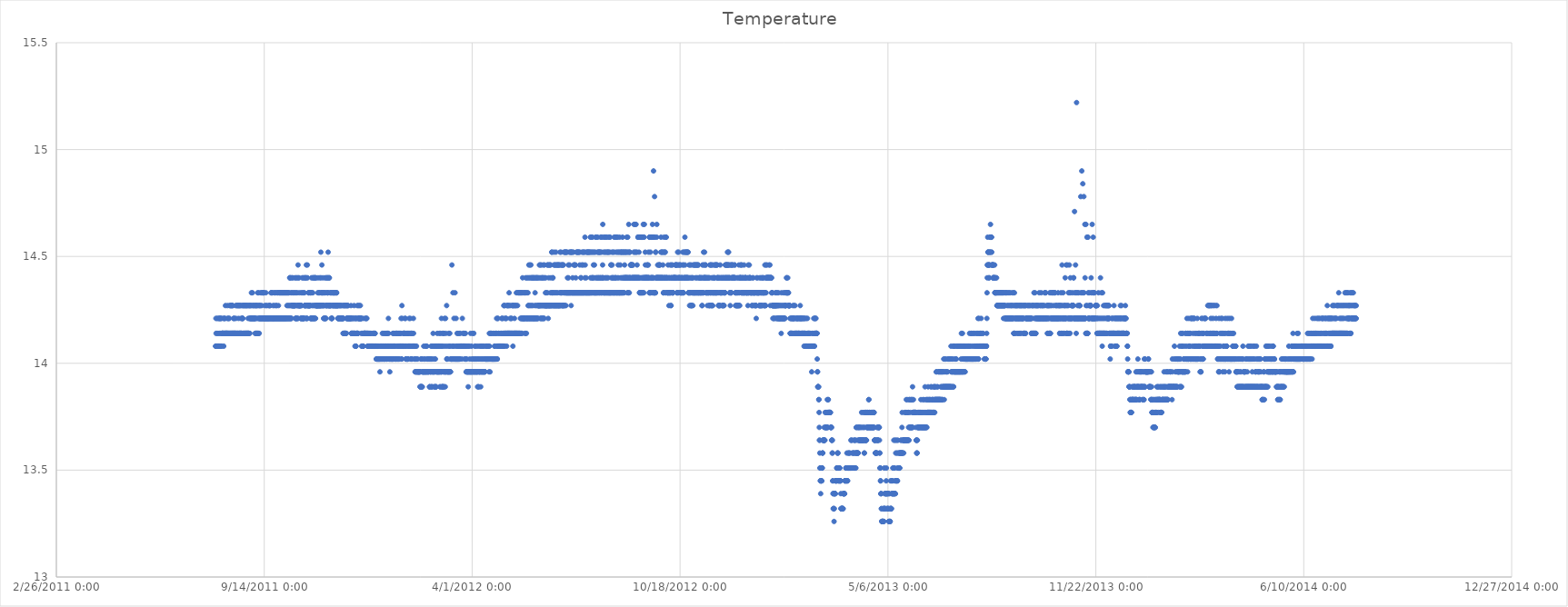
| Category | Temperature  |
|---|---|
| 40753.165972222225 | 14.08 |
| 40753.33263888889 | 14.08 |
| 40753.49930555555 | 14.21 |
| 40753.665972222225 | 14.14 |
| 40753.83263888889 | 14.08 |
| 40753.99930555555 | 14.08 |
| 40754.165972222225 | 14.08 |
| 40754.33263888889 | 14.08 |
| 40754.49930555555 | 14.21 |
| 40754.665972222225 | 14.14 |
| 40754.83263888889 | 14.08 |
| 40754.99930555555 | 14.08 |
| 40755.165972222225 | 14.08 |
| 40755.33263888889 | 14.08 |
| 40755.49930555555 | 14.21 |
| 40755.665972222225 | 14.14 |
| 40755.83263888889 | 14.08 |
| 40755.99930555555 | 14.08 |
| 40756.165972222225 | 14.08 |
| 40756.33263888889 | 14.08 |
| 40756.49930555555 | 14.21 |
| 40756.665972222225 | 14.21 |
| 40756.83263888889 | 14.14 |
| 40756.99930555555 | 14.08 |
| 40757.165972222225 | 14.08 |
| 40757.33263888889 | 14.08 |
| 40757.49930555555 | 14.21 |
| 40757.665972222225 | 14.21 |
| 40757.83263888889 | 14.14 |
| 40757.99930555555 | 14.08 |
| 40758.165972222225 | 14.08 |
| 40758.33263888889 | 14.08 |
| 40758.49930555555 | 14.21 |
| 40758.665972222225 | 14.21 |
| 40758.83263888889 | 14.08 |
| 40758.99930555555 | 14.14 |
| 40759.165972222225 | 14.14 |
| 40759.33263888889 | 14.14 |
| 40759.49930555555 | 14.14 |
| 40759.665972222225 | 14.14 |
| 40759.83263888889 | 14.14 |
| 40759.99930555555 | 14.14 |
| 40760.165972222225 | 14.14 |
| 40760.33263888889 | 14.14 |
| 40760.49930555555 | 14.14 |
| 40760.665972222225 | 14.21 |
| 40760.83263888889 | 14.14 |
| 40760.99930555555 | 14.08 |
| 40761.165972222225 | 14.14 |
| 40761.33263888889 | 14.14 |
| 40761.49930555555 | 14.21 |
| 40761.665972222225 | 14.21 |
| 40761.83263888889 | 14.14 |
| 40761.99930555555 | 14.14 |
| 40762.165972222225 | 14.14 |
| 40762.33263888889 | 14.14 |
| 40762.49930555555 | 14.21 |
| 40762.665972222225 | 14.27 |
| 40762.83263888889 | 14.14 |
| 40762.99930555555 | 14.14 |
| 40763.165972222225 | 14.14 |
| 40763.33263888889 | 14.14 |
| 40763.49930555555 | 14.14 |
| 40763.665972222225 | 14.14 |
| 40763.83263888889 | 14.14 |
| 40763.99930555555 | 14.14 |
| 40764.165972222225 | 14.14 |
| 40764.33263888889 | 14.14 |
| 40764.49930555555 | 14.21 |
| 40764.665972222225 | 14.27 |
| 40764.83263888889 | 14.14 |
| 40764.99930555555 | 14.14 |
| 40765.165972222225 | 14.14 |
| 40765.33263888889 | 14.14 |
| 40765.49930555555 | 14.21 |
| 40765.665972222225 | 14.21 |
| 40765.83263888889 | 14.14 |
| 40765.99930555555 | 14.14 |
| 40766.165972222225 | 14.14 |
| 40766.33263888889 | 14.14 |
| 40766.49930555555 | 14.21 |
| 40766.665972222225 | 14.27 |
| 40766.83263888889 | 14.14 |
| 40766.99930555555 | 14.14 |
| 40767.165972222225 | 14.14 |
| 40767.33263888889 | 14.14 |
| 40767.49930555555 | 14.27 |
| 40767.665972222225 | 14.27 |
| 40767.83263888889 | 14.14 |
| 40767.99930555555 | 14.14 |
| 40768.165972222225 | 14.14 |
| 40768.33263888889 | 14.14 |
| 40768.49930555555 | 14.27 |
| 40768.665972222225 | 14.27 |
| 40768.83263888889 | 14.14 |
| 40768.99930555555 | 14.14 |
| 40769.165972222225 | 14.14 |
| 40769.33263888889 | 14.14 |
| 40769.49930555555 | 14.27 |
| 40769.665972222225 | 14.27 |
| 40769.83263888889 | 14.14 |
| 40769.99930555555 | 14.14 |
| 40770.165972222225 | 14.14 |
| 40770.33263888889 | 14.14 |
| 40770.49930555555 | 14.21 |
| 40770.665972222225 | 14.21 |
| 40770.83263888889 | 14.14 |
| 40770.99930555555 | 14.14 |
| 40771.165972222225 | 14.14 |
| 40771.33263888889 | 14.14 |
| 40771.49930555555 | 14.21 |
| 40771.665972222225 | 14.14 |
| 40771.83263888889 | 14.14 |
| 40771.99930555555 | 14.14 |
| 40772.165972222225 | 14.14 |
| 40772.33263888889 | 14.14 |
| 40772.49930555555 | 14.27 |
| 40772.665972222225 | 14.21 |
| 40772.83263888889 | 14.14 |
| 40772.99930555555 | 14.14 |
| 40773.165972222225 | 14.14 |
| 40773.33263888889 | 14.14 |
| 40773.49930555555 | 14.27 |
| 40773.665972222225 | 14.27 |
| 40773.83263888889 | 14.14 |
| 40773.99930555555 | 14.14 |
| 40774.165972222225 | 14.14 |
| 40774.33263888889 | 14.14 |
| 40774.49930555555 | 14.27 |
| 40774.665972222225 | 14.27 |
| 40774.83263888889 | 14.14 |
| 40774.99930555555 | 14.14 |
| 40775.165972222225 | 14.14 |
| 40775.33263888889 | 14.21 |
| 40775.49930555555 | 14.27 |
| 40775.665972222225 | 14.27 |
| 40775.83263888889 | 14.14 |
| 40775.99930555555 | 14.14 |
| 40776.165972222225 | 14.14 |
| 40776.33263888889 | 14.14 |
| 40776.49930555555 | 14.27 |
| 40776.665972222225 | 14.27 |
| 40776.83263888889 | 14.14 |
| 40776.99930555555 | 14.14 |
| 40777.165972222225 | 14.14 |
| 40777.33263888889 | 14.14 |
| 40777.49930555555 | 14.27 |
| 40777.665972222225 | 14.21 |
| 40777.83263888889 | 14.14 |
| 40777.99930555555 | 14.14 |
| 40778.165972222225 | 14.14 |
| 40778.33263888889 | 14.14 |
| 40778.49930555555 | 14.27 |
| 40778.665972222225 | 14.21 |
| 40778.83263888889 | 14.21 |
| 40778.99930555555 | 14.14 |
| 40779.165972222225 | 14.21 |
| 40779.33263888889 | 14.21 |
| 40779.49930555555 | 14.27 |
| 40779.665972222225 | 14.27 |
| 40779.83263888889 | 14.14 |
| 40779.99930555555 | 14.14 |
| 40780.165972222225 | 14.14 |
| 40780.33263888889 | 14.14 |
| 40780.49930555555 | 14.27 |
| 40780.665972222225 | 14.27 |
| 40780.83263888889 | 14.14 |
| 40780.99930555555 | 14.14 |
| 40781.165972222225 | 14.14 |
| 40781.33263888889 | 14.14 |
| 40781.49930555555 | 14.27 |
| 40781.665972222225 | 14.27 |
| 40781.83263888889 | 14.14 |
| 40781.99930555555 | 14.14 |
| 40782.165972222225 | 14.14 |
| 40782.33263888889 | 14.14 |
| 40782.49930555555 | 14.27 |
| 40782.665972222225 | 14.27 |
| 40782.83263888889 | 14.14 |
| 40782.99930555555 | 14.14 |
| 40783.165972222225 | 14.14 |
| 40783.33263888889 | 14.14 |
| 40783.49930555555 | 14.27 |
| 40783.665972222225 | 14.27 |
| 40783.83263888889 | 14.14 |
| 40783.99930555555 | 14.14 |
| 40784.165972222225 | 14.14 |
| 40784.33263888889 | 14.14 |
| 40784.49930555555 | 14.21 |
| 40784.665972222225 | 14.27 |
| 40784.83263888889 | 14.14 |
| 40784.99930555555 | 14.14 |
| 40785.165972222225 | 14.14 |
| 40785.33263888889 | 14.14 |
| 40785.49930555555 | 14.27 |
| 40785.665972222225 | 14.27 |
| 40785.83263888889 | 14.21 |
| 40785.99930555555 | 14.21 |
| 40786.165972222225 | 14.14 |
| 40786.33263888889 | 14.21 |
| 40786.49930555555 | 14.27 |
| 40786.665972222225 | 14.27 |
| 40786.83263888889 | 14.21 |
| 40786.99930555555 | 14.21 |
| 40787.165972222225 | 14.21 |
| 40787.33263888889 | 14.21 |
| 40787.49930555555 | 14.27 |
| 40787.665972222225 | 14.33 |
| 40787.83263888889 | 14.21 |
| 40787.99930555555 | 14.21 |
| 40788.165972222225 | 14.21 |
| 40788.33263888889 | 14.21 |
| 40788.49930555555 | 14.27 |
| 40788.665972222225 | 14.33 |
| 40788.83263888889 | 14.21 |
| 40788.99930555555 | 14.21 |
| 40789.165972222225 | 14.21 |
| 40789.33263888889 | 14.21 |
| 40789.49930555555 | 14.27 |
| 40789.665972222225 | 14.27 |
| 40789.83263888889 | 14.21 |
| 40789.99930555555 | 14.21 |
| 40790.165972222225 | 14.21 |
| 40790.33263888889 | 14.21 |
| 40790.49930555555 | 14.27 |
| 40790.665972222225 | 14.21 |
| 40790.83263888889 | 14.21 |
| 40790.99930555555 | 14.21 |
| 40791.165972222225 | 14.14 |
| 40791.33263888889 | 14.21 |
| 40791.49930555555 | 14.27 |
| 40791.665972222225 | 14.27 |
| 40791.83263888889 | 14.21 |
| 40791.99930555555 | 14.14 |
| 40792.165972222225 | 14.14 |
| 40792.33263888889 | 14.14 |
| 40792.49930555555 | 14.27 |
| 40792.665972222225 | 14.27 |
| 40792.83263888889 | 14.21 |
| 40792.99930555555 | 14.14 |
| 40793.165972222225 | 14.14 |
| 40793.33263888889 | 14.14 |
| 40793.49930555555 | 14.27 |
| 40793.665972222225 | 14.33 |
| 40793.83263888889 | 14.21 |
| 40793.99930555555 | 14.14 |
| 40794.165972222225 | 14.14 |
| 40794.33263888889 | 14.14 |
| 40794.49930555555 | 14.27 |
| 40794.665972222225 | 14.33 |
| 40794.83263888889 | 14.21 |
| 40794.99930555555 | 14.21 |
| 40795.165972222225 | 14.14 |
| 40795.33263888889 | 14.21 |
| 40795.49930555555 | 14.27 |
| 40795.665972222225 | 14.27 |
| 40795.83263888889 | 14.21 |
| 40795.99930555555 | 14.21 |
| 40796.165972222225 | 14.21 |
| 40796.33263888889 | 14.21 |
| 40796.49930555555 | 14.27 |
| 40796.665972222225 | 14.33 |
| 40796.83263888889 | 14.21 |
| 40796.99930555555 | 14.21 |
| 40797.165972222225 | 14.21 |
| 40797.33263888889 | 14.21 |
| 40797.49930555555 | 14.33 |
| 40797.665972222225 | 14.27 |
| 40797.83263888889 | 14.21 |
| 40797.99930555555 | 14.21 |
| 40798.165972222225 | 14.21 |
| 40798.33263888889 | 14.21 |
| 40798.49930555555 | 14.33 |
| 40798.665972222225 | 14.33 |
| 40798.83263888889 | 14.21 |
| 40798.99930555555 | 14.21 |
| 40799.165972222225 | 14.21 |
| 40799.33263888889 | 14.21 |
| 40799.49930555555 | 14.33 |
| 40799.665972222225 | 14.33 |
| 40799.83263888889 | 14.21 |
| 40799.99930555555 | 14.21 |
| 40800.165972222225 | 14.21 |
| 40800.33263888889 | 14.21 |
| 40800.49930555555 | 14.27 |
| 40800.665972222225 | 14.21 |
| 40800.83263888889 | 14.21 |
| 40800.99930555555 | 14.21 |
| 40801.165972222225 | 14.21 |
| 40801.33263888889 | 14.21 |
| 40801.49930555555 | 14.33 |
| 40801.665972222225 | 14.27 |
| 40801.83263888889 | 14.21 |
| 40801.99930555555 | 14.21 |
| 40802.165972222225 | 14.21 |
| 40802.33263888889 | 14.21 |
| 40802.49930555555 | 14.21 |
| 40802.665972222225 | 14.27 |
| 40802.83263888889 | 14.21 |
| 40802.99930555555 | 14.21 |
| 40803.165972222225 | 14.21 |
| 40803.33263888889 | 14.21 |
| 40803.49930555555 | 14.21 |
| 40803.665972222225 | 14.21 |
| 40803.83263888889 | 14.21 |
| 40803.99930555555 | 14.21 |
| 40804.165972222225 | 14.21 |
| 40804.33263888889 | 14.21 |
| 40804.49930555555 | 14.27 |
| 40804.665972222225 | 14.27 |
| 40804.83263888889 | 14.21 |
| 40804.99930555555 | 14.21 |
| 40805.165972222225 | 14.21 |
| 40805.33263888889 | 14.21 |
| 40805.49930555555 | 14.27 |
| 40805.665972222225 | 14.27 |
| 40805.83263888889 | 14.21 |
| 40805.99930555555 | 14.21 |
| 40806.165972222225 | 14.21 |
| 40806.33263888889 | 14.21 |
| 40806.49930555555 | 14.33 |
| 40806.665972222225 | 14.33 |
| 40806.83263888889 | 14.21 |
| 40806.99930555555 | 14.21 |
| 40807.165972222225 | 14.21 |
| 40807.33263888889 | 14.21 |
| 40807.49930555555 | 14.33 |
| 40807.665972222225 | 14.33 |
| 40807.83263888889 | 14.21 |
| 40807.99930555555 | 14.21 |
| 40808.165972222225 | 14.21 |
| 40808.33263888889 | 14.21 |
| 40808.49930555555 | 14.27 |
| 40808.665972222225 | 14.21 |
| 40808.83263888889 | 14.21 |
| 40808.99930555555 | 14.21 |
| 40809.165972222225 | 14.21 |
| 40809.33263888889 | 14.21 |
| 40809.49930555555 | 14.33 |
| 40809.665972222225 | 14.27 |
| 40809.83263888889 | 14.21 |
| 40809.99930555555 | 14.21 |
| 40810.165972222225 | 14.21 |
| 40810.33263888889 | 14.21 |
| 40810.49930555555 | 14.33 |
| 40810.665972222225 | 14.33 |
| 40810.83263888889 | 14.21 |
| 40810.99930555555 | 14.21 |
| 40811.165972222225 | 14.21 |
| 40811.33263888889 | 14.21 |
| 40811.49930555555 | 14.27 |
| 40811.665972222225 | 14.27 |
| 40811.83263888889 | 14.21 |
| 40811.99930555555 | 14.21 |
| 40812.165972222225 | 14.21 |
| 40812.33263888889 | 14.21 |
| 40812.49930555555 | 14.33 |
| 40812.665972222225 | 14.33 |
| 40812.83263888889 | 14.21 |
| 40812.99930555555 | 14.21 |
| 40813.165972222225 | 14.21 |
| 40813.33263888889 | 14.21 |
| 40813.49930555555 | 14.33 |
| 40813.665972222225 | 14.27 |
| 40813.83263888889 | 14.21 |
| 40813.99930555555 | 14.21 |
| 40814.165972222225 | 14.21 |
| 40814.33263888889 | 14.21 |
| 40814.49930555555 | 14.33 |
| 40814.665972222225 | 14.33 |
| 40814.83263888889 | 14.21 |
| 40814.99930555555 | 14.21 |
| 40815.165972222225 | 14.21 |
| 40815.33263888889 | 14.21 |
| 40815.49930555555 | 14.33 |
| 40815.665972222225 | 14.33 |
| 40815.83263888889 | 14.21 |
| 40815.99930555555 | 14.21 |
| 40816.165972222225 | 14.21 |
| 40816.33263888889 | 14.21 |
| 40816.49930555555 | 14.33 |
| 40816.665972222225 | 14.33 |
| 40816.83263888889 | 14.21 |
| 40816.99930555555 | 14.21 |
| 40817.165972222225 | 14.21 |
| 40817.33263888889 | 14.21 |
| 40817.49930555555 | 14.33 |
| 40817.665972222225 | 14.33 |
| 40817.83263888889 | 14.21 |
| 40817.99930555555 | 14.21 |
| 40818.165972222225 | 14.21 |
| 40818.33263888889 | 14.21 |
| 40818.49930555555 | 14.33 |
| 40818.665972222225 | 14.33 |
| 40818.83263888889 | 14.21 |
| 40818.99930555555 | 14.21 |
| 40819.165972222225 | 14.21 |
| 40819.33263888889 | 14.21 |
| 40819.49930555555 | 14.33 |
| 40819.665972222225 | 14.33 |
| 40819.83263888889 | 14.21 |
| 40819.99930555555 | 14.21 |
| 40820.165972222225 | 14.21 |
| 40820.33263888889 | 14.21 |
| 40820.49930555555 | 14.33 |
| 40820.665972222225 | 14.33 |
| 40820.83263888889 | 14.21 |
| 40820.99930555555 | 14.21 |
| 40821.165972222225 | 14.21 |
| 40821.33263888889 | 14.21 |
| 40821.49930555555 | 14.33 |
| 40821.665972222225 | 14.33 |
| 40821.83263888889 | 14.27 |
| 40821.99930555555 | 14.21 |
| 40822.165972222225 | 14.21 |
| 40822.33263888889 | 14.21 |
| 40822.49930555555 | 14.33 |
| 40822.665972222225 | 14.33 |
| 40822.83263888889 | 14.27 |
| 40822.99930555555 | 14.21 |
| 40823.165972222225 | 14.21 |
| 40823.33263888889 | 14.21 |
| 40823.49930555555 | 14.33 |
| 40823.665972222225 | 14.33 |
| 40823.83263888889 | 14.27 |
| 40823.99930555555 | 14.21 |
| 40824.165972222225 | 14.21 |
| 40824.33263888889 | 14.21 |
| 40824.49930555555 | 14.4 |
| 40824.665972222225 | 14.4 |
| 40824.83263888889 | 14.27 |
| 40824.99930555555 | 14.21 |
| 40825.165972222225 | 14.21 |
| 40825.33263888889 | 14.21 |
| 40825.49930555555 | 14.4 |
| 40825.665972222225 | 14.33 |
| 40825.83263888889 | 14.27 |
| 40825.99930555555 | 14.21 |
| 40826.165972222225 | 14.21 |
| 40826.33263888889 | 14.27 |
| 40826.49930555555 | 14.33 |
| 40826.665972222225 | 14.4 |
| 40826.83263888889 | 14.27 |
| 40826.99930555555 | 14.27 |
| 40827.165972222225 | 14.27 |
| 40827.33263888889 | 14.27 |
| 40827.49930555555 | 14.4 |
| 40827.665972222225 | 14.33 |
| 40827.83263888889 | 14.27 |
| 40827.99930555555 | 14.27 |
| 40828.165972222225 | 14.27 |
| 40828.33263888889 | 14.27 |
| 40828.49930555555 | 14.33 |
| 40828.665972222225 | 14.27 |
| 40828.83263888889 | 14.27 |
| 40828.99930555555 | 14.27 |
| 40829.165972222225 | 14.27 |
| 40829.33263888889 | 14.27 |
| 40829.49930555555 | 14.4 |
| 40829.665972222225 | 14.33 |
| 40829.83263888889 | 14.27 |
| 40829.99930555555 | 14.21 |
| 40830.165972222225 | 14.21 |
| 40830.33263888889 | 14.21 |
| 40830.49930555555 | 14.4 |
| 40830.665972222225 | 14.33 |
| 40830.83263888889 | 14.27 |
| 40830.99930555555 | 14.21 |
| 40831.165972222225 | 14.21 |
| 40831.33263888889 | 14.21 |
| 40831.49930555555 | 14.4 |
| 40831.665972222225 | 14.33 |
| 40831.83263888889 | 14.27 |
| 40831.99930555555 | 14.27 |
| 40832.165972222225 | 14.21 |
| 40832.33263888889 | 14.21 |
| 40832.49930555555 | 14.46 |
| 40832.665972222225 | 14.4 |
| 40832.83263888889 | 14.27 |
| 40832.99930555555 | 14.27 |
| 40833.165972222225 | 14.27 |
| 40833.33263888889 | 14.27 |
| 40833.49930555555 | 14.4 |
| 40833.665972222225 | 14.33 |
| 40833.83263888889 | 14.27 |
| 40833.99930555555 | 14.27 |
| 40834.165972222225 | 14.27 |
| 40834.33263888889 | 14.27 |
| 40834.49930555555 | 14.27 |
| 40834.665972222225 | 14.27 |
| 40834.83263888889 | 14.27 |
| 40834.99930555555 | 14.21 |
| 40835.165972222225 | 14.21 |
| 40835.33263888889 | 14.21 |
| 40835.49930555555 | 14.33 |
| 40835.665972222225 | 14.27 |
| 40835.83263888889 | 14.27 |
| 40835.99930555555 | 14.21 |
| 40836.165972222225 | 14.21 |
| 40836.33263888889 | 14.21 |
| 40836.49930555555 | 14.4 |
| 40836.665972222225 | 14.33 |
| 40836.83263888889 | 14.21 |
| 40836.99930555555 | 14.21 |
| 40837.165972222225 | 14.21 |
| 40837.33263888889 | 14.21 |
| 40837.49930555555 | 14.4 |
| 40837.665972222225 | 14.33 |
| 40837.83263888889 | 14.21 |
| 40837.99930555555 | 14.21 |
| 40838.165972222225 | 14.21 |
| 40838.33263888889 | 14.21 |
| 40838.49930555555 | 14.4 |
| 40838.665972222225 | 14.33 |
| 40838.83263888889 | 14.27 |
| 40838.99930555555 | 14.27 |
| 40839.165972222225 | 14.27 |
| 40839.33263888889 | 14.27 |
| 40839.49930555555 | 14.4 |
| 40839.665972222225 | 14.4 |
| 40839.83263888889 | 14.27 |
| 40839.99930555555 | 14.27 |
| 40840.165972222225 | 14.21 |
| 40840.33263888889 | 14.21 |
| 40840.49930555555 | 14.46 |
| 40840.665972222225 | 14.4 |
| 40840.83263888889 | 14.27 |
| 40840.99930555555 | 14.27 |
| 40841.165972222225 | 14.21 |
| 40841.33263888889 | 14.21 |
| 40841.49930555555 | 14.46 |
| 40841.665972222225 | 14.4 |
| 40841.83263888889 | 14.27 |
| 40841.99930555555 | 14.27 |
| 40842.165972222225 | 14.27 |
| 40842.33263888889 | 14.27 |
| 40842.49930555555 | 14.33 |
| 40842.665972222225 | 14.33 |
| 40842.83263888889 | 14.27 |
| 40842.99930555555 | 14.27 |
| 40843.165972222225 | 14.27 |
| 40843.33263888889 | 14.27 |
| 40843.49930555555 | 14.27 |
| 40843.665972222225 | 14.33 |
| 40843.83263888889 | 14.27 |
| 40843.99930555555 | 14.27 |
| 40844.165972222225 | 14.27 |
| 40844.33263888889 | 14.21 |
| 40844.49930555555 | 14.33 |
| 40844.665972222225 | 14.33 |
| 40844.83263888889 | 14.21 |
| 40844.99930555555 | 14.21 |
| 40845.165972222225 | 14.21 |
| 40845.33263888889 | 14.21 |
| 40845.49930555555 | 14.4 |
| 40845.665972222225 | 14.33 |
| 40845.83263888889 | 14.27 |
| 40845.99930555555 | 14.21 |
| 40846.165972222225 | 14.21 |
| 40846.33263888889 | 14.21 |
| 40846.49930555555 | 14.4 |
| 40846.665972222225 | 14.33 |
| 40846.83263888889 | 14.27 |
| 40846.99930555555 | 14.21 |
| 40847.165972222225 | 14.21 |
| 40847.33263888889 | 14.21 |
| 40847.49930555555 | 14.4 |
| 40847.665972222225 | 14.4 |
| 40847.83263888889 | 14.27 |
| 40847.99930555555 | 14.21 |
| 40848.165972222225 | 14.21 |
| 40848.33263888889 | 14.21 |
| 40848.49930555555 | 14.4 |
| 40848.665972222225 | 14.4 |
| 40848.83263888889 | 14.27 |
| 40848.99930555555 | 14.27 |
| 40849.165972222225 | 14.21 |
| 40849.33263888889 | 14.21 |
| 40849.49930555555 | 14.4 |
| 40849.665972222225 | 14.4 |
| 40849.83263888889 | 14.27 |
| 40849.99930555555 | 14.27 |
| 40850.165972222225 | 14.27 |
| 40850.33263888889 | 14.27 |
| 40850.49930555555 | 14.27 |
| 40850.665972222225 | 14.27 |
| 40850.83263888889 | 14.27 |
| 40850.99930555555 | 14.27 |
| 40851.165972222225 | 14.27 |
| 40851.33263888889 | 14.27 |
| 40851.49930555555 | 14.33 |
| 40851.665972222225 | 14.4 |
| 40851.83263888889 | 14.27 |
| 40851.99930555555 | 14.27 |
| 40852.165972222225 | 14.27 |
| 40852.33263888889 | 14.27 |
| 40852.49930555555 | 14.33 |
| 40852.665972222225 | 14.33 |
| 40852.83263888889 | 14.27 |
| 40852.99930555555 | 14.27 |
| 40853.12430555555 | 14.27 |
| 40853.290972222225 | 14.27 |
| 40853.45763888889 | 14.4 |
| 40853.62430555555 | 14.33 |
| 40853.790972222225 | 14.27 |
| 40853.95763888889 | 14.27 |
| 40854.12430584491 | 14.27 |
| 40854.29097256945 | 14.27 |
| 40854.45763929398 | 14.52 |
| 40854.624306018515 | 14.4 |
| 40854.79097274305 | 14.27 |
| 40854.95763946759 | 14.27 |
| 40855.12430619213 | 14.33 |
| 40855.290972916664 | 14.33 |
| 40855.4576396412 | 14.46 |
| 40855.62430636574 | 14.33 |
| 40855.790973090276 | 14.27 |
| 40855.95763981481 | 14.33 |
| 40856.12430653935 | 14.27 |
| 40856.29097326389 | 14.27 |
| 40856.457639988424 | 14.4 |
| 40856.62430671296 | 14.33 |
| 40856.7909734375 | 14.27 |
| 40856.957640162036 | 14.27 |
| 40857.12430688657 | 14.21 |
| 40857.29097361111 | 14.21 |
| 40857.45764033565 | 14.33 |
| 40857.624307060185 | 14.33 |
| 40857.79097378472 | 14.27 |
| 40857.95764050926 | 14.21 |
| 40858.1243072338 | 14.21 |
| 40858.290973958334 | 14.21 |
| 40858.45764068287 | 14.4 |
| 40858.62430740741 | 14.33 |
| 40858.790974131945 | 14.27 |
| 40858.95764085648 | 14.21 |
| 40859.12430758102 | 14.21 |
| 40859.29097430556 | 14.21 |
| 40859.457641030094 | 14.4 |
| 40859.62430775463 | 14.33 |
| 40859.79097447917 | 14.27 |
| 40859.957641203706 | 14.27 |
| 40860.12430792824 | 14.27 |
| 40860.29097465278 | 14.27 |
| 40860.45764137732 | 14.4 |
| 40860.624308101855 | 14.4 |
| 40860.79097482639 | 14.27 |
| 40860.95764155093 | 14.33 |
| 40861.124308275466 | 14.33 |
| 40861.290975 | 14.33 |
| 40861.45764172453 | 14.52 |
| 40861.62430844907 | 14.4 |
| 40861.79097517361 | 14.27 |
| 40861.957641898145 | 14.27 |
| 40862.12430862268 | 14.27 |
| 40862.29097534722 | 14.27 |
| 40862.45764207176 | 14.4 |
| 40862.624308796294 | 14.4 |
| 40862.79097552083 | 14.27 |
| 40862.95764224537 | 14.27 |
| 40863.124308969906 | 14.27 |
| 40863.29097569444 | 14.27 |
| 40863.45764241898 | 14.33 |
| 40863.62430914352 | 14.33 |
| 40863.790975868054 | 14.27 |
| 40863.95764259259 | 14.27 |
| 40864.12430931713 | 14.27 |
| 40864.290976041666 | 14.21 |
| 40864.4576427662 | 14.33 |
| 40864.62430949074 | 14.33 |
| 40864.79097621528 | 14.21 |
| 40864.957642939815 | 14.21 |
| 40865.12430966435 | 14.21 |
| 40865.29097638889 | 14.21 |
| 40865.45764311343 | 14.33 |
| 40865.624309837964 | 14.33 |
| 40865.7909765625 | 14.27 |
| 40865.95764328704 | 14.27 |
| 40866.124310011575 | 14.27 |
| 40866.29097673611 | 14.27 |
| 40866.45764346065 | 14.33 |
| 40866.62431018519 | 14.33 |
| 40866.790976909724 | 14.33 |
| 40866.95764363426 | 14.27 |
| 40867.1243103588 | 14.33 |
| 40867.290977083336 | 14.27 |
| 40867.45764380787 | 14.33 |
| 40867.62431053241 | 14.33 |
| 40867.79097725695 | 14.27 |
| 40867.957643981485 | 14.27 |
| 40868.12431070602 | 14.27 |
| 40868.29097743056 | 14.27 |
| 40868.457644155096 | 14.33 |
| 40868.624310879626 | 14.33 |
| 40868.79097760416 | 14.27 |
| 40868.9576443287 | 14.27 |
| 40869.12431105324 | 14.27 |
| 40869.290977777775 | 14.33 |
| 40869.45764450231 | 14.33 |
| 40869.62431122685 | 14.33 |
| 40869.79097795139 | 14.27 |
| 40869.957644675924 | 14.27 |
| 40870.12431140046 | 14.27 |
| 40870.290978125 | 14.27 |
| 40870.457644849535 | 14.27 |
| 40870.62431157407 | 14.27 |
| 40870.79097829861 | 14.21 |
| 40870.95764502315 | 14.21 |
| 40871.124311747684 | 14.21 |
| 40871.29097847222 | 14.21 |
| 40871.45764519676 | 14.27 |
| 40871.624311921296 | 14.27 |
| 40871.79097864583 | 14.21 |
| 40871.95764537037 | 14.21 |
| 40872.12431209491 | 14.21 |
| 40872.290978819445 | 14.21 |
| 40872.45764554398 | 14.27 |
| 40872.62431226852 | 14.27 |
| 40872.790978993056 | 14.21 |
| 40872.95764571759 | 14.21 |
| 40873.12431244213 | 14.21 |
| 40873.29097916667 | 14.21 |
| 40873.457645891205 | 14.27 |
| 40873.62431261574 | 14.27 |
| 40873.79097934028 | 14.21 |
| 40873.95764606482 | 14.21 |
| 40874.124312789354 | 14.21 |
| 40874.29097951389 | 14.21 |
| 40874.45764623843 | 14.27 |
| 40874.624312962966 | 14.21 |
| 40874.7909796875 | 14.21 |
| 40874.95764641204 | 14.21 |
| 40875.12431313658 | 14.21 |
| 40875.290979861114 | 14.21 |
| 40875.45764658565 | 14.27 |
| 40875.62431331018 | 14.21 |
| 40875.79098003472 | 14.14 |
| 40875.957646759256 | 14.21 |
| 40876.12431348379 | 14.21 |
| 40876.29098020833 | 14.14 |
| 40876.45764693287 | 14.27 |
| 40876.624313657405 | 14.27 |
| 40876.79098038194 | 14.14 |
| 40876.95764710648 | 14.14 |
| 40877.12431383102 | 14.14 |
| 40877.290980555554 | 14.14 |
| 40877.45764728009 | 14.27 |
| 40877.62431400463 | 14.27 |
| 40877.790980729165 | 14.14 |
| 40877.9576474537 | 14.14 |
| 40878.12431417824 | 14.14 |
| 40878.29098090278 | 14.14 |
| 40878.457647627314 | 14.27 |
| 40878.62431435185 | 14.27 |
| 40878.79098107639 | 14.14 |
| 40878.957647800926 | 14.14 |
| 40879.12431452546 | 14.21 |
| 40879.29098125 | 14.21 |
| 40879.45764797454 | 14.27 |
| 40879.624314699075 | 14.27 |
| 40879.79098142361 | 14.21 |
| 40879.95764814815 | 14.21 |
| 40880.124314872686 | 14.21 |
| 40880.29098159722 | 14.21 |
| 40880.45764832176 | 14.27 |
| 40880.6243150463 | 14.27 |
| 40880.790981770835 | 14.21 |
| 40880.95764849537 | 14.21 |
| 40881.12431521991 | 14.21 |
| 40881.29098194445 | 14.21 |
| 40881.457648668984 | 14.21 |
| 40881.62431539352 | 14.21 |
| 40881.79098211806 | 14.21 |
| 40881.957648842596 | 14.21 |
| 40882.12431556713 | 14.21 |
| 40882.29098229167 | 14.21 |
| 40882.45764901621 | 14.21 |
| 40882.624315740744 | 14.21 |
| 40882.790982465274 | 14.21 |
| 40882.95764918981 | 14.21 |
| 40883.12431591435 | 14.21 |
| 40883.290982638886 | 14.21 |
| 40883.45764936342 | 14.27 |
| 40883.62431608796 | 14.21 |
| 40883.7909828125 | 14.14 |
| 40883.957649537035 | 14.14 |
| 40884.12431626157 | 14.14 |
| 40884.29098298611 | 14.14 |
| 40884.45764971065 | 14.21 |
| 40884.62431643518 | 14.21 |
| 40884.79098315972 | 14.14 |
| 40884.95764988426 | 14.14 |
| 40885.124316608795 | 14.14 |
| 40885.29098333333 | 14.14 |
| 40885.45765005787 | 14.21 |
| 40885.62431678241 | 14.21 |
| 40885.790983506944 | 14.14 |
| 40885.95765023148 | 14.14 |
| 40886.12431695602 | 14.14 |
| 40886.290983680556 | 14.14 |
| 40886.45765040509 | 14.27 |
| 40886.62431712963 | 14.21 |
| 40886.79098385417 | 14.14 |
| 40886.957650578704 | 14.14 |
| 40887.12431730324 | 14.14 |
| 40887.29098402778 | 14.08 |
| 40887.457650752316 | 14.21 |
| 40887.62431747685 | 14.21 |
| 40887.79098420139 | 14.14 |
| 40887.95765092593 | 14.08 |
| 40888.124317650465 | 14.08 |
| 40888.290984375 | 14.08 |
| 40888.45765109954 | 14.21 |
| 40888.62431782408 | 14.21 |
| 40888.790984548614 | 14.14 |
| 40888.95765127315 | 14.14 |
| 40889.12431799769 | 14.14 |
| 40889.290984722225 | 14.14 |
| 40889.45765144676 | 14.27 |
| 40889.6243181713 | 14.21 |
| 40889.79098489583 | 14.14 |
| 40889.95765162037 | 14.14 |
| 40890.124318344904 | 14.14 |
| 40890.29098506944 | 14.14 |
| 40890.45765179398 | 14.27 |
| 40890.624318518516 | 14.21 |
| 40890.79098524305 | 14.21 |
| 40890.95765196759 | 14.21 |
| 40891.12431869213 | 14.21 |
| 40891.290985416665 | 14.21 |
| 40891.4576521412 | 14.27 |
| 40891.62431886574 | 14.21 |
| 40891.790985590276 | 14.21 |
| 40891.95765231481 | 14.21 |
| 40892.12431903935 | 14.21 |
| 40892.29098576389 | 14.21 |
| 40892.457652488425 | 14.27 |
| 40892.62431921296 | 14.21 |
| 40892.7909859375 | 14.21 |
| 40892.95765266204 | 14.21 |
| 40893.124319386574 | 14.21 |
| 40893.29098611111 | 14.14 |
| 40893.45765283565 | 14.21 |
| 40893.624319560186 | 14.21 |
| 40893.79098628472 | 14.08 |
| 40893.95765300926 | 14.08 |
| 40894.1243197338 | 14.08 |
| 40894.290986458334 | 14.08 |
| 40894.45765318287 | 14.14 |
| 40894.62431990741 | 14.14 |
| 40894.790986631946 | 14.08 |
| 40894.95765335648 | 14.08 |
| 40895.12432008102 | 14.08 |
| 40895.29098680556 | 14.08 |
| 40895.457653530095 | 14.21 |
| 40895.62432025463 | 14.14 |
| 40895.79098697917 | 14.14 |
| 40895.95765370371 | 14.14 |
| 40896.124320428244 | 14.14 |
| 40896.29098715278 | 14.14 |
| 40896.45765387732 | 14.14 |
| 40896.624320601855 | 14.14 |
| 40896.79098732639 | 14.14 |
| 40896.95765405092 | 14.14 |
| 40897.12432077546 | 14.14 |
| 40897.2909875 | 14.14 |
| 40897.457654224534 | 14.21 |
| 40897.62432094907 | 14.21 |
| 40897.79098767361 | 14.14 |
| 40897.957654398146 | 14.14 |
| 40898.12432112268 | 14.14 |
| 40898.29098784722 | 14.14 |
| 40898.45765457176 | 14.21 |
| 40898.624321296295 | 14.21 |
| 40898.79098802083 | 14.14 |
| 40898.95765474537 | 14.14 |
| 40899.124321469906 | 14.14 |
| 40899.29098819444 | 14.08 |
| 40899.45765491898 | 14.14 |
| 40899.62432164352 | 14.14 |
| 40899.790988368055 | 14.08 |
| 40899.95765509259 | 14.08 |
| 40900.12432181713 | 14.08 |
| 40900.29098854167 | 14.08 |
| 40900.457655266204 | 14.14 |
| 40900.62432199074 | 14.14 |
| 40900.79098871528 | 14.08 |
| 40900.957655439815 | 14.08 |
| 40901.12432216435 | 14.08 |
| 40901.29098888889 | 14.08 |
| 40901.45765561343 | 14.14 |
| 40901.624322337964 | 14.14 |
| 40901.7909890625 | 14.08 |
| 40901.95765578704 | 14.08 |
| 40902.124322511576 | 14.08 |
| 40902.29098923611 | 14.08 |
| 40902.45765596065 | 14.14 |
| 40902.62432268519 | 14.14 |
| 40902.790989409725 | 14.08 |
| 40902.95765613426 | 14.08 |
| 40903.1243228588 | 14.08 |
| 40903.290989583336 | 14.08 |
| 40903.45765630787 | 14.08 |
| 40903.62432303241 | 14.08 |
| 40903.79098975695 | 14.08 |
| 40903.95765648148 | 14.08 |
| 40904.124323206015 | 14.08 |
| 40904.29098993055 | 14.08 |
| 40904.45765665509 | 14.14 |
| 40904.62432337963 | 14.14 |
| 40904.790990104164 | 14.08 |
| 40904.9576568287 | 14.08 |
| 40905.12432355324 | 14.08 |
| 40905.290990277776 | 14.08 |
| 40905.45765700231 | 14.14 |
| 40905.62432372685 | 14.14 |
| 40905.79099045139 | 14.08 |
| 40905.957657175924 | 14.08 |
| 40906.12432390046 | 14.08 |
| 40906.290990625 | 14.08 |
| 40906.457657349536 | 14.14 |
| 40906.62432407407 | 14.14 |
| 40906.79099079861 | 14.08 |
| 40906.95765752315 | 14.08 |
| 40907.124324247685 | 14.08 |
| 40907.29099097222 | 14.08 |
| 40907.45765769676 | 14.08 |
| 40907.6243244213 | 14.08 |
| 40907.790991145834 | 14.02 |
| 40907.95765787037 | 14.02 |
| 40908.12432459491 | 14.02 |
| 40908.290991319445 | 14.02 |
| 40908.45765804398 | 14.08 |
| 40908.62432476852 | 14.08 |
| 40908.79099149306 | 14.02 |
| 40908.957658217594 | 14.02 |
| 40909.12432494213 | 14.02 |
| 40909.29099166667 | 14.02 |
| 40909.457658391206 | 14.08 |
| 40909.62432511574 | 14.08 |
| 40909.79099184028 | 14.02 |
| 40909.95765856482 | 14.02 |
| 40910.124325289355 | 14.02 |
| 40910.29099201389 | 14.02 |
| 40910.45765873843 | 14.02 |
| 40910.624325462966 | 14.02 |
| 40910.7909921875 | 14.02 |
| 40910.95765891204 | 14.02 |
| 40911.12432563657 | 14.02 |
| 40911.29099236111 | 13.96 |
| 40911.457659085645 | 14.08 |
| 40911.62432581018 | 14.08 |
| 40911.79099253472 | 14.02 |
| 40911.95765925926 | 14.02 |
| 40912.124325983794 | 14.02 |
| 40912.29099270833 | 14.02 |
| 40912.45765943287 | 14.08 |
| 40912.624326157405 | 14.08 |
| 40912.79099288194 | 14.02 |
| 40912.95765960648 | 14.02 |
| 40913.12432633102 | 14.02 |
| 40913.290993055554 | 14.02 |
| 40913.45765978009 | 14.08 |
| 40913.62432650463 | 14.14 |
| 40913.790993229166 | 14.02 |
| 40913.9576599537 | 14.02 |
| 40914.12432667824 | 14.02 |
| 40914.29099340278 | 14.02 |
| 40914.457660127315 | 14.08 |
| 40914.62432685185 | 14.14 |
| 40914.79099357639 | 14.08 |
| 40914.95766030093 | 14.08 |
| 40915.12432702546 | 14.02 |
| 40915.29099375 | 14.02 |
| 40915.45766047454 | 14.08 |
| 40915.624327199075 | 14.14 |
| 40915.79099392361 | 14.02 |
| 40915.95766064815 | 14.02 |
| 40916.12432737269 | 14.02 |
| 40916.290994097224 | 14.02 |
| 40916.45766082176 | 14.14 |
| 40916.6243275463 | 14.08 |
| 40916.790994270836 | 14.08 |
| 40916.95766099537 | 14.08 |
| 40917.12432771991 | 14.08 |
| 40917.29099444445 | 14.02 |
| 40917.457661168984 | 14.14 |
| 40917.62432789352 | 14.14 |
| 40917.79099461806 | 14.02 |
| 40917.957661342596 | 14.02 |
| 40918.124328067126 | 14.02 |
| 40918.29099479166 | 14.02 |
| 40918.4576615162 | 14.14 |
| 40918.62432824074 | 14.14 |
| 40918.790994965275 | 14.08 |
| 40918.95766168981 | 14.08 |
| 40919.12432841435 | 14.08 |
| 40919.29099513889 | 14.08 |
| 40919.457661863424 | 14.21 |
| 40919.62432858796 | 14.14 |
| 40919.7909953125 | 14.08 |
| 40919.957662037035 | 14.02 |
| 40920.12432876157 | 14.02 |
| 40920.29099548611 | 14.02 |
| 40920.45766221065 | 14.08 |
| 40920.624328935184 | 14.02 |
| 40920.79099565972 | 13.96 |
| 40920.95766238426 | 14.02 |
| 40921.124329108796 | 14.02 |
| 40921.29099583333 | 14.02 |
| 40921.45766255787 | 14.08 |
| 40921.62432928241 | 14.08 |
| 40921.790996006945 | 14.02 |
| 40921.95766273148 | 14.02 |
| 40922.12432945602 | 14.02 |
| 40922.290996180556 | 14.02 |
| 40922.45766290509 | 14.08 |
| 40922.62432962963 | 14.08 |
| 40922.79099635417 | 14.02 |
| 40922.957663078705 | 14.02 |
| 40923.12432980324 | 14.02 |
| 40923.29099652778 | 14.02 |
| 40923.45766325232 | 14.08 |
| 40923.624329976854 | 14.14 |
| 40923.79099670139 | 14.02 |
| 40923.95766342593 | 14.02 |
| 40924.124330150466 | 14.02 |
| 40924.290996875 | 14.08 |
| 40924.45766359954 | 14.14 |
| 40924.62433032408 | 14.14 |
| 40924.790997048614 | 14.08 |
| 40924.95766377315 | 14.08 |
| 40925.12433049769 | 14.08 |
| 40925.29099722222 | 14.08 |
| 40925.457663946756 | 14.08 |
| 40925.62433067129 | 14.08 |
| 40925.79099739583 | 14.02 |
| 40925.95766412037 | 14.02 |
| 40926.124330844905 | 14.02 |
| 40926.29099756944 | 14.02 |
| 40926.45766429398 | 14.14 |
| 40926.62433101852 | 14.14 |
| 40926.79099774305 | 14.02 |
| 40926.95766446759 | 14.02 |
| 40927.12433119213 | 14.02 |
| 40927.290997916665 | 14.02 |
| 40927.4576646412 | 14.14 |
| 40927.62433136574 | 14.14 |
| 40927.79099809028 | 14.08 |
| 40927.957664814814 | 14.02 |
| 40928.12433153935 | 14.02 |
| 40928.29099826389 | 14.02 |
| 40928.457664988426 | 14.14 |
| 40928.62433171296 | 14.08 |
| 40928.7909984375 | 14.08 |
| 40928.95766516204 | 14.08 |
| 40929.124331886575 | 14.02 |
| 40929.29099861111 | 14.02 |
| 40929.45766533565 | 14.14 |
| 40929.624332060186 | 14.14 |
| 40929.79099878472 | 14.08 |
| 40929.95766550926 | 14.02 |
| 40930.1243322338 | 14.08 |
| 40930.290998958335 | 14.08 |
| 40930.45766568287 | 14.14 |
| 40930.62433240741 | 14.14 |
| 40930.79099913195 | 14.08 |
| 40930.957665856484 | 14.08 |
| 40931.12433258102 | 14.08 |
| 40931.29099930556 | 14.08 |
| 40931.457666030095 | 14.14 |
| 40931.62433275463 | 14.21 |
| 40931.79099947917 | 14.08 |
| 40931.95766620371 | 14.08 |
| 40932.124332928244 | 14.02 |
| 40932.290999652774 | 14.02 |
| 40932.45766637731 | 14.27 |
| 40932.62433310185 | 14.21 |
| 40932.790999826386 | 14.08 |
| 40932.95766655092 | 14.08 |
| 40933.12433327546 | 14.08 |
| 40933.291 | 14.08 |
| 40933.457666724535 | 14.08 |
| 40933.62433344907 | 14.14 |
| 40933.79100017361 | 14.08 |
| 40933.957666898146 | 14.08 |
| 40934.12433362268 | 14.14 |
| 40934.29100034722 | 14.14 |
| 40934.45766707176 | 14.14 |
| 40934.624333796295 | 14.14 |
| 40934.79100052083 | 14.14 |
| 40934.95766724537 | 14.14 |
| 40935.12433396991 | 14.14 |
| 40935.291000694444 | 14.08 |
| 40935.45766741898 | 14.21 |
| 40935.62433414352 | 14.21 |
| 40935.791000868056 | 14.08 |
| 40935.95766759259 | 14.08 |
| 40936.12433431713 | 14.02 |
| 40936.29100104167 | 14.02 |
| 40936.457667766204 | 14.14 |
| 40936.62433449074 | 14.08 |
| 40936.79100121528 | 14.02 |
| 40936.957667939816 | 14.02 |
| 40937.12433466435 | 14.02 |
| 40937.29100138889 | 14.02 |
| 40937.45766811343 | 14.14 |
| 40937.624334837965 | 14.14 |
| 40937.7910015625 | 14.02 |
| 40937.95766828704 | 14.02 |
| 40938.12433501158 | 14.02 |
| 40938.291001736114 | 14.02 |
| 40938.45766846065 | 14.14 |
| 40938.62433518519 | 14.14 |
| 40938.791001909725 | 14.08 |
| 40938.95766863426 | 14.08 |
| 40939.1243353588 | 14.08 |
| 40939.29100208334 | 14.08 |
| 40939.45766880787 | 14.21 |
| 40939.624335532404 | 14.14 |
| 40939.79100225694 | 14.08 |
| 40939.95766898148 | 14.08 |
| 40940.124335706016 | 14.08 |
| 40940.29100243055 | 14.08 |
| 40940.45766915509 | 14.21 |
| 40940.62433587963 | 14.14 |
| 40940.791002604165 | 14.08 |
| 40940.9576693287 | 14.02 |
| 40941.12433605324 | 14.02 |
| 40941.291002777776 | 14.02 |
| 40941.45766950231 | 14.14 |
| 40941.62433622685 | 14.14 |
| 40941.79100295139 | 14.08 |
| 40941.957669675925 | 14.02 |
| 40942.12433640046 | 14.02 |
| 40942.291003125 | 14.08 |
| 40942.45766984954 | 14.14 |
| 40942.624336574074 | 14.08 |
| 40942.79100329861 | 14.08 |
| 40942.95767002315 | 14.08 |
| 40943.124336747685 | 14.08 |
| 40943.29100347222 | 14.08 |
| 40943.45767019676 | 14.21 |
| 40943.6243369213 | 14.14 |
| 40943.791003645834 | 14.08 |
| 40943.95767037037 | 14.08 |
| 40944.12433709491 | 14.08 |
| 40944.291003819446 | 14.08 |
| 40944.45767054398 | 14.08 |
| 40944.62433726852 | 14.08 |
| 40944.79100399306 | 14.02 |
| 40944.957670717595 | 14.02 |
| 40945.12433744213 | 13.96 |
| 40945.29100416667 | 13.96 |
| 40945.45767089121 | 14.08 |
| 40945.62433761574 | 14.02 |
| 40945.79100434028 | 13.96 |
| 40945.95767106482 | 13.96 |
| 40946.124337789355 | 13.96 |
| 40946.29100451389 | 13.96 |
| 40946.45767123842 | 14.08 |
| 40946.62433796296 | 14.02 |
| 40946.7910046875 | 13.96 |
| 40946.957671412034 | 13.96 |
| 40947.12433813657 | 13.96 |
| 40947.29100486111 | 13.96 |
| 40947.457671585646 | 14.02 |
| 40947.62433831018 | 13.96 |
| 40947.79100503472 | 13.96 |
| 40947.95767175926 | 13.96 |
| 40948.124338483794 | 13.96 |
| 40948.29100520833 | 13.96 |
| 40948.45767193287 | 13.96 |
| 40948.624338657406 | 13.96 |
| 40948.79100538194 | 13.96 |
| 40948.95767210648 | 13.96 |
| 40949.12433883102 | 13.96 |
| 40949.291005555555 | 13.96 |
| 40949.45767228009 | 13.96 |
| 40949.62433900463 | 13.96 |
| 40949.79100572917 | 13.96 |
| 40949.957672453704 | 13.89 |
| 40950.12433917824 | 13.89 |
| 40950.29100590278 | 13.89 |
| 40950.457672627315 | 13.96 |
| 40950.62433935185 | 14.02 |
| 40950.79100607639 | 13.89 |
| 40950.95767280093 | 13.89 |
| 40951.124339525464 | 13.89 |
| 40951.29100625 | 13.89 |
| 40951.45767297454 | 14.02 |
| 40951.624339699076 | 14.02 |
| 40951.79100642361 | 13.89 |
| 40951.95767314815 | 13.89 |
| 40952.12433987269 | 13.96 |
| 40952.291006597225 | 13.96 |
| 40952.45767332176 | 13.96 |
| 40952.6243400463 | 13.96 |
| 40952.791006770836 | 13.96 |
| 40952.95767349537 | 13.96 |
| 40953.12434021991 | 13.96 |
| 40953.29100694445 | 13.96 |
| 40953.457673668985 | 14.08 |
| 40953.624340393515 | 14.02 |
| 40953.79100711805 | 13.96 |
| 40953.95767384259 | 13.96 |
| 40954.12434056713 | 13.96 |
| 40954.291007291664 | 13.96 |
| 40954.4576740162 | 13.96 |
| 40954.62434074074 | 14.02 |
| 40954.791007465275 | 13.96 |
| 40954.95767418981 | 13.96 |
| 40955.12434091435 | 13.96 |
| 40955.29100763889 | 13.96 |
| 40955.457674363424 | 14.08 |
| 40955.62434108796 | 14.08 |
| 40955.7910078125 | 13.96 |
| 40955.957674537036 | 13.96 |
| 40956.12434126157 | 13.96 |
| 40956.29100798611 | 13.96 |
| 40956.45767471065 | 14.08 |
| 40956.624341435185 | 14.02 |
| 40956.79100815972 | 13.96 |
| 40956.95767488426 | 13.96 |
| 40957.1243416088 | 13.96 |
| 40957.29100833333 | 13.96 |
| 40957.45767505787 | 14.02 |
| 40957.62434178241 | 14.02 |
| 40957.791008506945 | 13.96 |
| 40957.95767523148 | 13.96 |
| 40958.12434195602 | 13.96 |
| 40958.29100868056 | 13.96 |
| 40958.457675405094 | 14.02 |
| 40958.62434212963 | 14.02 |
| 40958.79100885417 | 13.96 |
| 40958.957675578706 | 13.89 |
| 40959.12434230324 | 13.89 |
| 40959.29100902778 | 13.89 |
| 40959.45767575232 | 14.02 |
| 40959.624342476855 | 14.02 |
| 40959.79100920139 | 13.96 |
| 40959.95767592593 | 13.96 |
| 40960.124342650466 | 13.96 |
| 40960.291009375 | 13.96 |
| 40960.45767609954 | 14.08 |
| 40960.62434282407 | 14.02 |
| 40960.79100954861 | 13.96 |
| 40960.957676273145 | 13.89 |
| 40961.12434299768 | 13.89 |
| 40961.29100972222 | 13.89 |
| 40961.45767644676 | 14.08 |
| 40961.624343171294 | 14.02 |
| 40961.79100989583 | 13.96 |
| 40961.95767662037 | 13.96 |
| 40962.124343344905 | 13.96 |
| 40962.29101006944 | 13.96 |
| 40962.45767679398 | 14.14 |
| 40962.62434351852 | 14.08 |
| 40962.791010243054 | 13.96 |
| 40962.95767696759 | 13.96 |
| 40963.12434369213 | 13.89 |
| 40963.291010416666 | 13.96 |
| 40963.4576771412 | 14.02 |
| 40963.62434386574 | 14.08 |
| 40963.79101059028 | 13.96 |
| 40963.957677314815 | 13.89 |
| 40964.12434403935 | 13.96 |
| 40964.29101076389 | 13.89 |
| 40964.457677488426 | 14.08 |
| 40964.62434421296 | 14.02 |
| 40964.7910109375 | 13.96 |
| 40964.95767766204 | 13.89 |
| 40965.124344386575 | 13.89 |
| 40965.29101111111 | 13.89 |
| 40965.45767783565 | 14.08 |
| 40965.62434456019 | 14.08 |
| 40965.791011284724 | 13.96 |
| 40965.95767800926 | 13.96 |
| 40966.1243447338 | 13.96 |
| 40966.291011458336 | 13.96 |
| 40966.45767818287 | 14.14 |
| 40966.62434490741 | 14.08 |
| 40966.79101163195 | 13.96 |
| 40966.957678356484 | 13.96 |
| 40967.12434508102 | 13.96 |
| 40967.29101180556 | 13.96 |
| 40967.457678530096 | 14.08 |
| 40967.62434525463 | 14.08 |
| 40967.79101197916 | 13.96 |
| 40967.9576787037 | 13.96 |
| 40968.12434542824 | 13.96 |
| 40968.291012152775 | 13.96 |
| 40968.45767887731 | 14.14 |
| 40968.62434560185 | 14.08 |
| 40968.79101232639 | 13.96 |
| 40968.95767905092 | 13.96 |
| 40969.12434577546 | 13.89 |
| 40969.2910125 | 13.89 |
| 40969.457679224535 | 14.14 |
| 40969.62434594907 | 14.08 |
| 40969.79101267361 | 13.96 |
| 40969.95767939815 | 13.96 |
| 40970.124346122684 | 13.96 |
| 40970.29101284722 | 13.96 |
| 40970.45767957176 | 14.21 |
| 40970.624346296296 | 14.08 |
| 40970.79101302083 | 13.96 |
| 40970.95767974537 | 13.89 |
| 40971.12434646991 | 13.89 |
| 40971.291013194445 | 13.89 |
| 40971.45767991898 | 14.14 |
| 40971.62434664352 | 14.08 |
| 40971.791013368056 | 13.96 |
| 40971.95768009259 | 13.89 |
| 40972.12434681713 | 13.89 |
| 40972.29101354167 | 13.89 |
| 40972.457680266205 | 14.14 |
| 40972.62434699074 | 14.14 |
| 40972.79101371528 | 13.96 |
| 40972.95768043982 | 13.96 |
| 40973.124347164354 | 13.96 |
| 40973.29101388889 | 13.89 |
| 40973.45768061343 | 14.21 |
| 40973.624347337965 | 14.08 |
| 40973.7910140625 | 13.96 |
| 40973.95768078704 | 13.96 |
| 40974.12434751158 | 13.89 |
| 40974.291014236114 | 13.96 |
| 40974.45768096065 | 14.21 |
| 40974.62434768519 | 14.14 |
| 40974.79101440972 | 13.96 |
| 40974.957681134256 | 13.96 |
| 40975.12430555555 | 13.96 |
| 40975.290972222225 | 13.96 |
| 40975.45763888889 | 14.27 |
| 40975.62430555555 | 14.02 |
| 40975.665972222225 | 14.08 |
| 40975.83263888889 | 14.02 |
| 40975.99930555555 | 14.02 |
| 40976.165972222225 | 14.02 |
| 40976.33263888889 | 13.96 |
| 40976.49930555555 | 13.96 |
| 40976.665972222225 | 13.96 |
| 40976.83263888889 | 13.96 |
| 40976.99930555555 | 13.96 |
| 40977.165972222225 | 13.96 |
| 40977.33263888889 | 13.96 |
| 40977.49930555555 | 14.14 |
| 40977.665972222225 | 14.08 |
| 40977.83263888889 | 13.96 |
| 40977.99930555555 | 13.96 |
| 40978.165972222225 | 13.96 |
| 40978.33263888889 | 13.96 |
| 40978.49930555555 | 14.14 |
| 40978.665972222225 | 14.08 |
| 40978.83263888889 | 13.96 |
| 40978.99930555555 | 13.96 |
| 40979.20763888889 | 13.96 |
| 40979.37430555555 | 14.02 |
| 40979.540972222225 | 14.02 |
| 40979.70763888889 | 14.02 |
| 40979.87430555555 | 14.02 |
| 40980.040972222225 | 14.02 |
| 40980.20763888889 | 14.02 |
| 40980.37430555555 | 14.02 |
| 40980.540972222225 | 14.46 |
| 40980.70763888889 | 14.08 |
| 40980.87430555555 | 14.02 |
| 40981.040972222225 | 14.02 |
| 40981.20763888889 | 14.02 |
| 40981.37430555555 | 14.02 |
| 40981.540972222225 | 14.33 |
| 40981.70763888889 | 14.08 |
| 40981.87430555555 | 14.02 |
| 40982.040972222225 | 14.02 |
| 40982.20763888889 | 14.02 |
| 40982.37430555555 | 14.02 |
| 40982.540972222225 | 14.21 |
| 40982.70763888889 | 14.08 |
| 40982.87430555555 | 14.02 |
| 40983.040972222225 | 14.02 |
| 40983.20763888889 | 14.02 |
| 40983.37430555555 | 14.02 |
| 40983.540972222225 | 14.33 |
| 40983.70763888889 | 14.02 |
| 40983.87430555555 | 14.02 |
| 40984.040972222225 | 14.02 |
| 40984.20763888889 | 14.02 |
| 40984.37430555555 | 14.02 |
| 40984.540972222225 | 14.21 |
| 40984.70763888889 | 14.08 |
| 40984.87430555555 | 14.02 |
| 40985.040972222225 | 14.02 |
| 40985.20763888889 | 14.02 |
| 40985.37430555555 | 14.02 |
| 40985.540972222225 | 14.14 |
| 40985.70763888889 | 14.08 |
| 40985.87430555555 | 14.02 |
| 40986.040972222225 | 14.02 |
| 40986.20763888889 | 14.02 |
| 40986.37430555555 | 14.02 |
| 40986.540972222225 | 14.14 |
| 40986.70763888889 | 14.08 |
| 40986.87430555555 | 14.02 |
| 40987.040972222225 | 14.02 |
| 40987.20763888889 | 14.02 |
| 40987.37430555555 | 14.08 |
| 40987.540972222225 | 14.14 |
| 40987.70763888889 | 14.08 |
| 40987.87430555555 | 14.02 |
| 40988.040972222225 | 14.02 |
| 40988.20763888889 | 14.02 |
| 40988.37430555555 | 14.08 |
| 40988.540972222225 | 14.14 |
| 40988.70763888889 | 14.08 |
| 40988.87430555555 | 14.08 |
| 40989.040972222225 | 14.08 |
| 40989.20763888889 | 14.08 |
| 40989.37430555555 | 14.08 |
| 40989.540972222225 | 14.08 |
| 40989.70763888889 | 14.08 |
| 40989.87430555555 | 14.08 |
| 40990.040972222225 | 14.08 |
| 40990.20763888889 | 14.02 |
| 40990.37430555555 | 14.08 |
| 40990.540972222225 | 14.21 |
| 40990.70763888889 | 14.08 |
| 40990.87430555555 | 14.08 |
| 40991.040972222225 | 14.08 |
| 40991.20763888889 | 14.08 |
| 40991.37430555555 | 14.08 |
| 40991.540972222225 | 14.14 |
| 40991.70763888889 | 14.14 |
| 40991.87430555555 | 14.08 |
| 40992.040972222225 | 14.08 |
| 40992.20763888889 | 14.08 |
| 40992.37430555555 | 14.08 |
| 40992.540972222225 | 14.14 |
| 40992.70763888889 | 14.08 |
| 40992.87430555555 | 14.08 |
| 40993.040972222225 | 14.08 |
| 40993.20763888889 | 14.02 |
| 40993.37430555555 | 14.02 |
| 40993.540972222225 | 14.14 |
| 40993.70763888889 | 14.08 |
| 40993.87430555555 | 14.02 |
| 40994.040972222225 | 14.02 |
| 40994.20763888889 | 13.96 |
| 40994.37430555555 | 13.96 |
| 40994.540972222225 | 14.08 |
| 40994.70763888889 | 14.02 |
| 40994.87430555555 | 13.96 |
| 40995.040972222225 | 13.96 |
| 40995.20763888889 | 13.96 |
| 40995.37430555555 | 13.96 |
| 40995.540972222225 | 14.08 |
| 40995.70763888889 | 13.96 |
| 40995.87430555555 | 13.96 |
| 40996.040972222225 | 13.96 |
| 40996.20763888889 | 13.89 |
| 40996.37430555555 | 13.96 |
| 40996.540972222225 | 14.08 |
| 40996.70763888889 | 13.96 |
| 40996.87430555555 | 13.96 |
| 40997.040972222225 | 13.96 |
| 40997.20763888889 | 13.96 |
| 40997.37430555555 | 13.96 |
| 40997.540972222225 | 14.08 |
| 40997.70763888889 | 14.02 |
| 40997.87430555555 | 13.96 |
| 40998.040972222225 | 13.96 |
| 40998.20763888889 | 13.96 |
| 40998.37430555555 | 13.96 |
| 40998.540972222225 | 14.14 |
| 40998.70763888889 | 13.96 |
| 40998.87430555555 | 13.96 |
| 40999.040972222225 | 13.96 |
| 40999.20763888889 | 13.96 |
| 40999.37430555555 | 13.96 |
| 40999.540972222225 | 14.08 |
| 40999.70763888889 | 14.02 |
| 40999.87430555555 | 13.96 |
| 41000.040972222225 | 13.96 |
| 41000.20763888889 | 13.96 |
| 41000.37430555555 | 13.96 |
| 41000.540972222225 | 14.14 |
| 41000.70763888889 | 14.02 |
| 41000.87430555555 | 13.96 |
| 41001.040972222225 | 13.96 |
| 41001.20763888889 | 13.96 |
| 41001.37430555555 | 13.96 |
| 41001.540972222225 | 14.14 |
| 41001.70763888889 | 14.02 |
| 41001.87430555555 | 13.96 |
| 41002.040972222225 | 13.96 |
| 41002.20763888889 | 13.96 |
| 41002.37430555555 | 13.96 |
| 41002.540972222225 | 14.08 |
| 41002.70763888889 | 14.02 |
| 41002.87430555555 | 13.96 |
| 41003.040972222225 | 13.96 |
| 41003.20763888889 | 13.96 |
| 41003.37430555555 | 13.96 |
| 41003.540972222225 | 14.08 |
| 41003.70763888889 | 14.02 |
| 41003.87430555555 | 13.96 |
| 41004.040972222225 | 13.96 |
| 41004.20763888889 | 13.96 |
| 41004.37430555555 | 13.96 |
| 41004.540972222225 | 14.02 |
| 41004.70763888889 | 13.96 |
| 41004.87430555555 | 13.96 |
| 41005.040972222225 | 13.96 |
| 41005.20763888889 | 13.89 |
| 41005.37430555555 | 13.96 |
| 41005.540972222225 | 14.08 |
| 41005.70763888889 | 14.02 |
| 41005.87430555555 | 13.96 |
| 41006.040972222225 | 13.89 |
| 41006.20763888889 | 13.89 |
| 41006.37430555555 | 13.96 |
| 41006.540972222225 | 14.02 |
| 41006.70763888889 | 13.96 |
| 41006.87430555555 | 13.96 |
| 41007.040972222225 | 13.96 |
| 41007.20763888889 | 13.96 |
| 41007.37430555555 | 13.96 |
| 41007.540972222225 | 14.08 |
| 41007.70763888889 | 14.02 |
| 41007.87430555555 | 13.96 |
| 41008.040972222225 | 13.96 |
| 41008.20763888889 | 13.89 |
| 41008.37430555555 | 13.96 |
| 41008.540972222225 | 14.08 |
| 41008.70763888889 | 14.02 |
| 41008.87430555555 | 13.96 |
| 41009.040972222225 | 13.96 |
| 41009.20763888889 | 13.96 |
| 41009.37430555555 | 13.96 |
| 41009.540972222225 | 14.08 |
| 41009.70763888889 | 14.02 |
| 41009.87430555555 | 13.96 |
| 41010.040972222225 | 13.96 |
| 41010.20763888889 | 13.96 |
| 41010.37430555555 | 13.96 |
| 41010.540972222225 | 14.08 |
| 41010.70763888889 | 14.02 |
| 41010.87430555555 | 13.96 |
| 41011.040972222225 | 13.96 |
| 41011.20763888889 | 13.96 |
| 41011.37430555555 | 13.96 |
| 41011.540972222225 | 14.08 |
| 41011.70763888889 | 14.02 |
| 41011.87430555555 | 13.96 |
| 41012.040972222225 | 13.96 |
| 41012.20763888889 | 13.96 |
| 41012.37430555555 | 13.96 |
| 41012.540972222225 | 14.02 |
| 41012.70763888889 | 14.02 |
| 41012.87430555555 | 14.02 |
| 41013.040972222225 | 14.02 |
| 41013.20763888889 | 14.02 |
| 41013.37430555555 | 14.02 |
| 41013.540972222225 | 14.08 |
| 41013.70763888889 | 14.08 |
| 41013.87430555555 | 14.02 |
| 41014.040972222225 | 14.02 |
| 41014.20763888889 | 14.02 |
| 41014.37430555555 | 14.02 |
| 41014.540972222225 | 14.08 |
| 41014.70763888889 | 14.08 |
| 41014.87430555555 | 14.02 |
| 41015.040972222225 | 14.02 |
| 41015.20763888889 | 14.02 |
| 41015.37430555555 | 14.02 |
| 41015.540972222225 | 14.08 |
| 41015.70763888889 | 14.08 |
| 41015.87430555555 | 14.02 |
| 41016.040972222225 | 14.02 |
| 41016.20763888889 | 13.96 |
| 41016.37430555555 | 14.02 |
| 41016.540972222225 | 14.14 |
| 41016.70763888889 | 14.08 |
| 41016.87430555555 | 14.02 |
| 41017.040972222225 | 14.02 |
| 41017.20763888889 | 13.96 |
| 41017.37430555555 | 14.02 |
| 41017.540972222225 | 14.14 |
| 41017.70763888889 | 14.14 |
| 41017.87430555555 | 14.02 |
| 41018.040972222225 | 14.02 |
| 41018.20763888889 | 14.02 |
| 41018.37430555555 | 14.02 |
| 41018.540972222225 | 14.14 |
| 41018.70763888889 | 14.14 |
| 41018.87430555555 | 14.02 |
| 41019.040972222225 | 14.02 |
| 41019.20763888889 | 14.02 |
| 41019.37430555555 | 14.02 |
| 41019.540972222225 | 14.02 |
| 41019.70763888889 | 14.02 |
| 41019.87430555555 | 14.02 |
| 41020.040972222225 | 14.02 |
| 41020.20763888889 | 14.02 |
| 41020.37430555555 | 14.02 |
| 41020.540972222225 | 14.14 |
| 41020.70763888889 | 14.14 |
| 41020.87430555555 | 14.02 |
| 41021.040972222225 | 14.02 |
| 41021.20763888889 | 14.02 |
| 41021.37430555555 | 14.02 |
| 41021.540972222225 | 14.08 |
| 41021.70763888889 | 14.08 |
| 41021.87430555555 | 14.02 |
| 41022.040972222225 | 14.02 |
| 41022.20763888889 | 14.02 |
| 41022.37430555555 | 14.02 |
| 41022.540972222225 | 14.14 |
| 41022.70763888889 | 14.14 |
| 41022.87430555555 | 14.02 |
| 41023.040972222225 | 14.02 |
| 41023.20763888889 | 14.02 |
| 41023.37430555555 | 14.02 |
| 41023.540972222225 | 14.21 |
| 41023.70763888889 | 14.14 |
| 41023.87430555555 | 14.08 |
| 41024.040972222225 | 14.02 |
| 41024.20763888889 | 14.02 |
| 41024.37430555555 | 14.08 |
| 41024.540972222225 | 14.21 |
| 41024.70763888889 | 14.21 |
| 41024.87430555555 | 14.08 |
| 41025.040972222225 | 14.08 |
| 41025.20763888889 | 14.08 |
| 41025.37430555555 | 14.08 |
| 41025.540972222225 | 14.14 |
| 41025.70763888889 | 14.14 |
| 41025.87430555555 | 14.08 |
| 41026.040972222225 | 14.08 |
| 41026.20763888889 | 14.08 |
| 41026.37430555555 | 14.08 |
| 41026.540972222225 | 14.08 |
| 41026.70763888889 | 14.08 |
| 41026.87430555555 | 14.08 |
| 41027.040972222225 | 14.08 |
| 41027.20763888889 | 14.08 |
| 41027.37430555555 | 14.08 |
| 41027.540972222225 | 14.14 |
| 41027.70763888889 | 14.14 |
| 41027.87430555555 | 14.08 |
| 41028.040972222225 | 14.08 |
| 41028.20763888889 | 14.08 |
| 41028.37430555555 | 14.14 |
| 41028.540972222225 | 14.21 |
| 41028.70763888889 | 14.21 |
| 41028.87430555555 | 14.08 |
| 41029.040972222225 | 14.08 |
| 41029.20763888889 | 14.08 |
| 41029.37430555555 | 14.14 |
| 41029.540972222225 | 14.14 |
| 41029.70763888889 | 14.21 |
| 41029.87430555555 | 14.08 |
| 41030.040972222225 | 14.08 |
| 41030.20763888889 | 14.08 |
| 41030.37430555555 | 14.14 |
| 41030.540972222225 | 14.27 |
| 41030.70763888889 | 14.27 |
| 41030.87430555555 | 14.14 |
| 41031.040972222225 | 14.14 |
| 41031.20763888889 | 14.08 |
| 41031.37430555555 | 14.14 |
| 41031.540972222225 | 14.27 |
| 41031.70763888889 | 14.21 |
| 41031.87430555555 | 14.14 |
| 41032.040972222225 | 14.14 |
| 41032.20763888889 | 14.14 |
| 41032.37430555555 | 14.14 |
| 41032.540972222225 | 14.21 |
| 41032.70763888889 | 14.21 |
| 41032.87430555555 | 14.14 |
| 41033.040972222225 | 14.14 |
| 41033.20763888889 | 14.08 |
| 41033.37430555555 | 14.14 |
| 41033.540972222225 | 14.27 |
| 41033.70763888889 | 14.27 |
| 41033.87430555555 | 14.14 |
| 41034.040972222225 | 14.14 |
| 41034.20763888889 | 14.14 |
| 41034.37430555555 | 14.14 |
| 41034.540972222225 | 14.27 |
| 41034.70763888889 | 14.27 |
| 41034.87430555555 | 14.14 |
| 41035.040972222225 | 14.14 |
| 41035.20763888889 | 14.14 |
| 41035.37430555555 | 14.14 |
| 41035.540972222225 | 14.33 |
| 41035.70763888889 | 14.27 |
| 41035.87430555555 | 14.14 |
| 41036.040972222225 | 14.14 |
| 41036.20763888889 | 14.14 |
| 41036.37430555555 | 14.14 |
| 41036.540972222225 | 14.21 |
| 41036.70763888889 | 14.27 |
| 41036.87430555555 | 14.14 |
| 41037.040972222225 | 14.14 |
| 41037.20763888889 | 14.14 |
| 41037.37430555555 | 14.14 |
| 41037.540972222225 | 14.21 |
| 41037.70763888889 | 14.21 |
| 41037.87430555555 | 14.14 |
| 41038.040972222225 | 14.14 |
| 41038.20763888889 | 14.14 |
| 41038.37430555555 | 14.14 |
| 41038.540972222225 | 14.27 |
| 41038.70763888889 | 14.27 |
| 41038.87430555555 | 14.14 |
| 41039.040972222225 | 14.14 |
| 41039.20763888889 | 14.08 |
| 41039.37430555555 | 14.14 |
| 41039.540972222225 | 14.27 |
| 41039.70763888889 | 14.27 |
| 41039.87430555555 | 14.14 |
| 41040.040972222225 | 14.14 |
| 41040.20763888889 | 14.14 |
| 41040.37430555555 | 14.14 |
| 41040.540972222225 | 14.27 |
| 41040.70763888889 | 14.21 |
| 41040.87430555555 | 14.14 |
| 41041.040972222225 | 14.14 |
| 41041.20763888889 | 14.14 |
| 41041.37430555555 | 14.14 |
| 41041.540972222225 | 14.27 |
| 41041.70763888889 | 14.27 |
| 41041.87430555555 | 14.14 |
| 41042.040972222225 | 14.14 |
| 41042.20763888889 | 14.14 |
| 41042.37430555555 | 14.14 |
| 41042.540972222225 | 14.33 |
| 41042.70763888889 | 14.27 |
| 41042.87430555555 | 14.14 |
| 41043.040972222225 | 14.14 |
| 41043.20763888889 | 14.14 |
| 41043.37430555555 | 14.14 |
| 41043.540972222225 | 14.33 |
| 41043.70763888889 | 14.27 |
| 41043.87430555555 | 14.14 |
| 41044.040972222225 | 14.14 |
| 41044.20763888889 | 14.14 |
| 41044.37430555555 | 14.14 |
| 41044.540972222225 | 14.33 |
| 41044.70763888889 | 14.33 |
| 41044.87430555555 | 14.14 |
| 41045.040972222225 | 14.14 |
| 41045.20763888889 | 14.14 |
| 41045.37430555555 | 14.14 |
| 41045.540972222225 | 14.33 |
| 41045.70763888889 | 14.33 |
| 41045.87430555555 | 14.14 |
| 41046.040972222225 | 14.14 |
| 41046.20763888889 | 14.14 |
| 41046.37430555555 | 14.21 |
| 41046.540972222225 | 14.33 |
| 41046.70763888889 | 14.33 |
| 41046.87430555555 | 14.21 |
| 41047.040972222225 | 14.14 |
| 41047.20763888889 | 14.14 |
| 41047.37430555555 | 14.21 |
| 41047.540972222225 | 14.33 |
| 41047.70763888889 | 14.33 |
| 41047.87430555555 | 14.21 |
| 41048.040972222225 | 14.21 |
| 41048.20763888889 | 14.14 |
| 41048.37430555555 | 14.21 |
| 41048.540972222225 | 14.4 |
| 41048.70763888889 | 14.33 |
| 41048.87430555555 | 14.21 |
| 41049.040972222225 | 14.21 |
| 41049.20763888889 | 14.21 |
| 41049.37430555555 | 14.21 |
| 41049.540972222225 | 14.33 |
| 41049.70763888889 | 14.21 |
| 41049.87430555555 | 14.21 |
| 41050.040972222225 | 14.21 |
| 41050.20763888889 | 14.21 |
| 41050.37430555555 | 14.21 |
| 41050.540972222225 | 14.33 |
| 41050.70763888889 | 14.33 |
| 41050.87430555555 | 14.21 |
| 41051.040972222225 | 14.14 |
| 41051.20763888889 | 14.14 |
| 41051.37430555555 | 14.21 |
| 41051.540972222225 | 14.4 |
| 41051.70763888889 | 14.33 |
| 41051.87430555555 | 14.21 |
| 41052.040972222225 | 14.21 |
| 41052.20763888889 | 14.14 |
| 41052.37430555555 | 14.21 |
| 41052.540972222225 | 14.4 |
| 41052.70763888889 | 14.33 |
| 41052.87430555555 | 14.21 |
| 41053.040972222225 | 14.21 |
| 41053.20763888889 | 14.21 |
| 41053.37430555555 | 14.21 |
| 41053.540972222225 | 14.4 |
| 41053.70763888889 | 14.33 |
| 41053.87430555555 | 14.27 |
| 41054.040972222225 | 14.21 |
| 41054.20763888889 | 14.21 |
| 41054.37430555555 | 14.27 |
| 41054.540972222225 | 14.46 |
| 41054.70763888889 | 14.4 |
| 41054.87430555555 | 14.21 |
| 41055.040972222225 | 14.21 |
| 41055.20763888889 | 14.21 |
| 41055.37430555555 | 14.27 |
| 41055.540972222225 | 14.46 |
| 41055.70763888889 | 14.4 |
| 41055.87430555555 | 14.21 |
| 41056.040972222225 | 14.21 |
| 41056.20763888889 | 14.21 |
| 41056.37430555555 | 14.27 |
| 41056.540972222225 | 14.46 |
| 41056.70763888889 | 14.4 |
| 41056.87430555555 | 14.21 |
| 41057.040972222225 | 14.21 |
| 41057.20763888889 | 14.21 |
| 41057.37430555555 | 14.27 |
| 41057.540972222225 | 14.4 |
| 41057.70763888889 | 14.4 |
| 41057.87430555555 | 14.21 |
| 41058.040972222225 | 14.21 |
| 41058.20763888889 | 14.21 |
| 41058.37430555555 | 14.27 |
| 41058.540972222225 | 14.4 |
| 41058.70763888889 | 14.4 |
| 41058.87430555555 | 14.21 |
| 41059.040972222225 | 14.21 |
| 41059.20763888889 | 14.21 |
| 41059.37430555555 | 14.21 |
| 41059.540972222225 | 14.4 |
| 41059.70763888889 | 14.4 |
| 41059.87430555555 | 14.21 |
| 41060.040972222225 | 14.21 |
| 41060.20763888889 | 14.21 |
| 41060.37430555555 | 14.27 |
| 41060.540972222225 | 14.33 |
| 41060.70763888889 | 14.4 |
| 41060.87430555555 | 14.21 |
| 41061.040972222225 | 14.21 |
| 41061.20763888889 | 14.21 |
| 41061.37430555555 | 14.27 |
| 41061.540972222225 | 14.4 |
| 41061.70763888889 | 14.4 |
| 41061.87430555555 | 14.21 |
| 41062.040972222225 | 14.21 |
| 41062.20763888889 | 14.21 |
| 41062.37430555555 | 14.27 |
| 41062.540972222225 | 14.4 |
| 41062.70763888889 | 14.4 |
| 41062.87430555555 | 14.21 |
| 41063.040972222225 | 14.21 |
| 41063.20763888889 | 14.21 |
| 41063.37430555555 | 14.27 |
| 41063.540972222225 | 14.4 |
| 41063.70763888889 | 14.27 |
| 41063.87430555555 | 14.27 |
| 41064.040972222225 | 14.27 |
| 41064.20763888889 | 14.27 |
| 41064.37430555555 | 14.27 |
| 41064.540972222225 | 14.4 |
| 41064.70763888889 | 14.46 |
| 41064.87430555555 | 14.27 |
| 41065.040972222225 | 14.27 |
| 41065.20763888889 | 14.21 |
| 41065.37430555555 | 14.27 |
| 41065.540972222225 | 14.46 |
| 41065.70763888889 | 14.4 |
| 41065.87430555555 | 14.27 |
| 41066.040972222225 | 14.21 |
| 41066.20763888889 | 14.21 |
| 41066.37430555555 | 14.27 |
| 41066.540972222225 | 14.46 |
| 41066.70763888889 | 14.4 |
| 41066.87430555555 | 14.27 |
| 41067.040972222225 | 14.21 |
| 41067.20763888889 | 14.21 |
| 41067.37430555555 | 14.27 |
| 41067.540972222225 | 14.4 |
| 41067.70763888889 | 14.4 |
| 41067.87430555555 | 14.27 |
| 41068.040972222225 | 14.21 |
| 41068.20763888889 | 14.21 |
| 41068.37430555555 | 14.27 |
| 41068.540972222225 | 14.46 |
| 41068.70763888889 | 14.4 |
| 41068.87430555555 | 14.27 |
| 41069.040972222225 | 14.21 |
| 41069.20763888889 | 14.21 |
| 41069.37430555555 | 14.27 |
| 41069.540972222225 | 14.46 |
| 41069.70763888889 | 14.4 |
| 41069.87430555555 | 14.27 |
| 41070.040972222225 | 14.27 |
| 41070.20763888889 | 14.27 |
| 41070.37430555555 | 14.27 |
| 41070.540972222225 | 14.33 |
| 41070.70763888889 | 14.4 |
| 41070.87430555555 | 14.27 |
| 41071.040972222225 | 14.27 |
| 41071.20763888889 | 14.27 |
| 41071.37430555555 | 14.33 |
| 41071.540972222225 | 14.27 |
| 41071.70763888889 | 14.27 |
| 41071.87430555555 | 14.27 |
| 41072.040972222225 | 14.27 |
| 41072.20763888889 | 14.27 |
| 41072.37430555555 | 14.33 |
| 41072.540972222225 | 14.46 |
| 41072.70763888889 | 14.46 |
| 41072.87430555555 | 14.27 |
| 41073.040972222225 | 14.27 |
| 41073.20763888889 | 14.21 |
| 41073.37430555555 | 14.27 |
| 41073.540972222225 | 14.46 |
| 41073.70763888889 | 14.4 |
| 41073.87430555555 | 14.27 |
| 41074.040972222225 | 14.27 |
| 41074.20763888889 | 14.27 |
| 41074.37430555555 | 14.27 |
| 41074.540972222225 | 14.46 |
| 41074.70763888889 | 14.46 |
| 41074.87430555555 | 14.27 |
| 41075.040972222225 | 14.27 |
| 41075.20763888889 | 14.27 |
| 41075.37430555555 | 14.33 |
| 41075.540972222225 | 14.46 |
| 41075.70763888889 | 14.4 |
| 41075.87430555555 | 14.27 |
| 41076.040972222225 | 14.27 |
| 41076.20763888889 | 14.27 |
| 41076.37430555555 | 14.33 |
| 41076.540972222225 | 14.52 |
| 41076.70763888889 | 14.52 |
| 41076.87430555555 | 14.27 |
| 41077.040972222225 | 14.27 |
| 41077.20763888889 | 14.33 |
| 41077.37430555555 | 14.33 |
| 41077.540972222225 | 14.4 |
| 41077.70763888889 | 14.4 |
| 41077.87430555555 | 14.27 |
| 41078.040972222225 | 14.27 |
| 41078.20763888889 | 14.27 |
| 41078.37430555555 | 14.33 |
| 41078.540972222225 | 14.52 |
| 41078.70763888889 | 14.46 |
| 41078.87430555555 | 14.27 |
| 41079.040972222225 | 14.27 |
| 41079.20763888889 | 14.27 |
| 41079.37430555555 | 14.33 |
| 41079.540972222225 | 14.46 |
| 41079.70763888889 | 14.46 |
| 41079.87430555555 | 14.27 |
| 41080.040972222225 | 14.27 |
| 41080.20763888889 | 14.27 |
| 41080.37430555555 | 14.33 |
| 41080.540972222225 | 14.52 |
| 41080.70763888889 | 14.46 |
| 41080.87430555555 | 14.27 |
| 41081.040972222225 | 14.27 |
| 41081.20763888889 | 14.27 |
| 41081.37430555555 | 14.33 |
| 41081.540972222225 | 14.46 |
| 41081.70763888889 | 14.46 |
| 41081.87430555555 | 14.27 |
| 41082.040972222225 | 14.27 |
| 41082.20763888889 | 14.27 |
| 41082.37430555555 | 14.33 |
| 41082.540972222225 | 14.46 |
| 41082.70763888889 | 14.46 |
| 41082.87430555555 | 14.27 |
| 41083.040972222225 | 14.27 |
| 41083.20763888889 | 14.27 |
| 41083.37430555555 | 14.27 |
| 41083.540972222225 | 14.46 |
| 41083.70763888889 | 14.46 |
| 41083.87430555555 | 14.27 |
| 41084.040972222225 | 14.27 |
| 41084.20763888889 | 14.27 |
| 41084.37430555555 | 14.33 |
| 41084.540972222225 | 14.52 |
| 41084.70763888889 | 14.46 |
| 41084.87430555555 | 14.33 |
| 41085.040972222225 | 14.27 |
| 41085.20763888889 | 14.27 |
| 41085.37430555555 | 14.33 |
| 41085.540972222225 | 14.52 |
| 41085.70763888889 | 14.46 |
| 41085.87430555555 | 14.33 |
| 41086.040972222225 | 14.33 |
| 41086.20763888889 | 14.27 |
| 41086.37430555555 | 14.33 |
| 41086.540972222225 | 14.46 |
| 41086.70763888889 | 14.46 |
| 41086.87430555555 | 14.27 |
| 41087.040972222225 | 14.27 |
| 41087.20763888889 | 14.27 |
| 41087.37430555555 | 14.27 |
| 41087.540972222225 | 14.46 |
| 41087.70763888889 | 14.46 |
| 41087.87430555555 | 14.33 |
| 41088.040972222225 | 14.27 |
| 41088.20763888889 | 14.27 |
| 41088.37430555555 | 14.33 |
| 41088.540972222225 | 14.52 |
| 41088.70763888889 | 14.52 |
| 41088.87430555555 | 14.33 |
| 41089.040972222225 | 14.27 |
| 41089.20763888889 | 14.27 |
| 41089.37430555555 | 14.33 |
| 41089.540972222225 | 14.52 |
| 41089.70763888889 | 14.52 |
| 41089.87430555555 | 14.33 |
| 41090.040972222225 | 14.33 |
| 41090.20763888889 | 14.27 |
| 41090.37430555555 | 14.33 |
| 41090.540972222225 | 14.52 |
| 41090.70763888889 | 14.52 |
| 41090.87430555555 | 14.33 |
| 41091.040972222225 | 14.33 |
| 41091.20763888889 | 14.33 |
| 41091.37430555555 | 14.33 |
| 41091.540972222225 | 14.52 |
| 41091.70763888889 | 14.4 |
| 41091.87430555555 | 14.33 |
| 41092.040972222225 | 14.33 |
| 41092.20763888889 | 14.33 |
| 41092.37430555555 | 14.33 |
| 41092.540972222225 | 14.46 |
| 41092.70763888889 | 14.4 |
| 41092.87430555555 | 14.33 |
| 41093.040972222225 | 14.33 |
| 41093.20763888889 | 14.33 |
| 41093.37430555555 | 14.33 |
| 41093.540972222225 | 14.52 |
| 41093.70763888889 | 14.46 |
| 41093.87430555555 | 14.33 |
| 41094.040972222225 | 14.33 |
| 41094.20763888889 | 14.33 |
| 41094.37430555555 | 14.33 |
| 41094.540972222225 | 14.52 |
| 41094.70763888889 | 14.52 |
| 41094.87430555555 | 14.33 |
| 41095.040972222225 | 14.33 |
| 41095.20763888889 | 14.27 |
| 41095.37430555555 | 14.33 |
| 41095.540972222225 | 14.52 |
| 41095.70763888889 | 14.52 |
| 41095.87430555555 | 14.33 |
| 41096.040972222225 | 14.33 |
| 41096.20763888889 | 14.33 |
| 41096.37430555555 | 14.33 |
| 41096.540972222225 | 14.52 |
| 41096.70763888889 | 14.4 |
| 41096.87430555555 | 14.33 |
| 41097.040972222225 | 14.33 |
| 41097.20763888889 | 14.33 |
| 41097.37430555555 | 14.33 |
| 41097.540972222225 | 14.52 |
| 41097.70763888889 | 14.46 |
| 41097.87430555555 | 14.33 |
| 41098.040972222225 | 14.33 |
| 41098.20763888889 | 14.33 |
| 41098.37430555555 | 14.33 |
| 41098.540972222225 | 14.46 |
| 41098.70763888889 | 14.46 |
| 41098.87430555555 | 14.33 |
| 41099.040972222225 | 14.33 |
| 41099.20763888889 | 14.33 |
| 41099.37430555555 | 14.33 |
| 41099.540972222225 | 14.46 |
| 41099.70763888889 | 14.4 |
| 41099.87430555555 | 14.33 |
| 41100.040972222225 | 14.33 |
| 41100.20763888889 | 14.33 |
| 41100.37430555555 | 14.33 |
| 41100.540972222225 | 14.52 |
| 41100.70763888889 | 14.52 |
| 41100.87430555555 | 14.33 |
| 41101.040972222225 | 14.33 |
| 41101.20763888889 | 14.33 |
| 41101.37430555555 | 14.33 |
| 41101.540972222225 | 14.52 |
| 41101.70763888889 | 14.52 |
| 41101.87430555555 | 14.33 |
| 41102.040972222225 | 14.33 |
| 41102.20763888889 | 14.33 |
| 41102.37430555555 | 14.33 |
| 41102.540972222225 | 14.52 |
| 41102.70763888889 | 14.52 |
| 41102.87430555555 | 14.33 |
| 41103.040972222225 | 14.33 |
| 41103.20763888889 | 14.33 |
| 41103.37430555555 | 14.33 |
| 41103.540972222225 | 14.46 |
| 41103.70763888889 | 14.52 |
| 41103.87430555555 | 14.33 |
| 41104.040972222225 | 14.33 |
| 41104.20763888889 | 14.33 |
| 41104.37430555555 | 14.33 |
| 41104.540972222225 | 14.4 |
| 41104.70763888889 | 14.4 |
| 41104.87430555555 | 14.33 |
| 41105.040972222225 | 14.33 |
| 41105.20763888889 | 14.33 |
| 41105.37430555555 | 14.33 |
| 41105.540972222225 | 14.46 |
| 41105.70763888889 | 14.52 |
| 41105.87430555555 | 14.33 |
| 41106.040972222225 | 14.33 |
| 41106.20763888889 | 14.33 |
| 41106.37430555555 | 14.33 |
| 41106.540972222225 | 14.52 |
| 41106.70763888889 | 14.46 |
| 41106.87430555555 | 14.33 |
| 41107.040972222225 | 14.33 |
| 41107.20763888889 | 14.33 |
| 41107.37430555555 | 14.33 |
| 41107.540972222225 | 14.52 |
| 41107.70763888889 | 14.52 |
| 41107.87430555555 | 14.33 |
| 41108.040972222225 | 14.33 |
| 41108.20763888889 | 14.33 |
| 41108.37430555555 | 14.4 |
| 41108.540972222225 | 14.59 |
| 41108.70763888889 | 14.46 |
| 41108.87430555555 | 14.33 |
| 41109.040972222225 | 14.33 |
| 41109.20763888889 | 14.33 |
| 41109.37430555555 | 14.33 |
| 41109.540972222225 | 14.52 |
| 41109.70763888889 | 14.4 |
| 41109.87430555555 | 14.33 |
| 41110.040972222225 | 14.33 |
| 41110.20763888889 | 14.33 |
| 41110.37430555555 | 14.33 |
| 41110.540972222225 | 14.52 |
| 41110.70763888889 | 14.52 |
| 41110.87430555555 | 14.33 |
| 41111.040972222225 | 14.33 |
| 41111.20763888889 | 14.33 |
| 41111.37430555555 | 14.33 |
| 41111.540972222225 | 14.52 |
| 41111.70763888889 | 14.52 |
| 41111.87430555555 | 14.33 |
| 41112.040972222225 | 14.33 |
| 41112.20763888889 | 14.33 |
| 41112.37430555555 | 14.33 |
| 41112.540972222225 | 14.52 |
| 41112.70763888889 | 14.52 |
| 41112.87430555555 | 14.33 |
| 41113.040972222225 | 14.33 |
| 41113.20763888889 | 14.33 |
| 41113.37430555555 | 14.33 |
| 41113.540972222225 | 14.52 |
| 41113.665972222225 | 14.59 |
| 41113.83263888889 | 14.4 |
| 41113.99930555555 | 14.33 |
| 41114.165972222225 | 14.33 |
| 41114.33263888889 | 14.33 |
| 41114.49930555555 | 14.52 |
| 41114.665972222225 | 14.59 |
| 41114.83263888889 | 14.4 |
| 41114.99930555555 | 14.33 |
| 41115.165972222225 | 14.33 |
| 41115.33263888889 | 14.33 |
| 41115.49930555555 | 14.52 |
| 41115.665972222225 | 14.59 |
| 41115.83263888889 | 14.4 |
| 41115.99930555555 | 14.4 |
| 41116.165972222225 | 14.33 |
| 41116.33263888889 | 14.4 |
| 41116.49930555555 | 14.52 |
| 41116.665972222225 | 14.46 |
| 41116.83263888889 | 14.33 |
| 41116.99930555555 | 14.33 |
| 41117.165972222225 | 14.33 |
| 41117.33263888889 | 14.33 |
| 41117.49930555555 | 14.52 |
| 41117.665972222225 | 14.46 |
| 41117.83263888889 | 14.4 |
| 41117.99930555555 | 14.33 |
| 41118.165972222225 | 14.33 |
| 41118.33263888889 | 14.33 |
| 41118.49930555555 | 14.52 |
| 41118.665972222225 | 14.59 |
| 41118.83263888889 | 14.33 |
| 41118.99930555555 | 14.33 |
| 41119.165972222225 | 14.33 |
| 41119.33263888889 | 14.33 |
| 41119.49930555555 | 14.4 |
| 41119.665972222225 | 14.59 |
| 41119.83263888889 | 14.4 |
| 41119.99930555555 | 14.33 |
| 41120.165972222225 | 14.33 |
| 41120.33263888889 | 14.33 |
| 41120.49930555555 | 14.52 |
| 41120.665972222225 | 14.59 |
| 41120.83263888889 | 14.4 |
| 41120.99930555555 | 14.33 |
| 41121.165972222225 | 14.33 |
| 41121.33263888889 | 14.4 |
| 41121.49930555555 | 14.52 |
| 41121.665972222225 | 14.52 |
| 41121.83263888889 | 14.4 |
| 41121.99930555555 | 14.33 |
| 41122.165972222225 | 14.33 |
| 41122.33263888889 | 14.33 |
| 41122.49930555555 | 14.52 |
| 41122.665972222225 | 14.52 |
| 41122.83263888889 | 14.4 |
| 41122.99930555555 | 14.33 |
| 41123.165972222225 | 14.33 |
| 41123.33263888889 | 14.4 |
| 41123.49930555555 | 14.52 |
| 41123.665972222225 | 14.59 |
| 41123.83263888889 | 14.4 |
| 41123.99930555555 | 14.33 |
| 41124.165972222225 | 14.33 |
| 41124.33263888889 | 14.33 |
| 41124.49930555555 | 14.52 |
| 41124.665972222225 | 14.59 |
| 41124.83263888889 | 14.4 |
| 41124.99930555555 | 14.33 |
| 41125.165972222225 | 14.33 |
| 41125.33263888889 | 14.4 |
| 41125.49930555555 | 14.46 |
| 41125.665972222225 | 14.65 |
| 41125.83263888889 | 14.4 |
| 41125.99930555555 | 14.4 |
| 41126.165972222225 | 14.33 |
| 41126.33263888889 | 14.33 |
| 41126.49930555555 | 14.52 |
| 41126.665972222225 | 14.59 |
| 41126.83263888889 | 14.33 |
| 41126.99930555555 | 14.33 |
| 41127.165972222225 | 14.33 |
| 41127.33263888889 | 14.33 |
| 41127.49930555555 | 14.52 |
| 41127.665972222225 | 14.59 |
| 41127.83263888889 | 14.4 |
| 41127.99930555555 | 14.33 |
| 41128.165972222225 | 14.33 |
| 41128.33263888889 | 14.33 |
| 41128.49930555555 | 14.52 |
| 41128.665972222225 | 14.59 |
| 41128.83263888889 | 14.4 |
| 41128.99930555555 | 14.33 |
| 41129.165972222225 | 14.33 |
| 41129.33263888889 | 14.33 |
| 41129.49930555555 | 14.52 |
| 41129.665972222225 | 14.59 |
| 41129.83263888889 | 14.4 |
| 41129.99930555555 | 14.33 |
| 41130.165972222225 | 14.33 |
| 41130.33263888889 | 14.33 |
| 41130.49930555555 | 14.52 |
| 41130.665972222225 | 14.52 |
| 41130.83263888889 | 14.4 |
| 41130.99930555555 | 14.33 |
| 41131.165972222225 | 14.33 |
| 41131.33263888889 | 14.33 |
| 41131.49930555555 | 14.52 |
| 41131.665972222225 | 14.59 |
| 41131.83263888889 | 14.33 |
| 41131.99930555555 | 14.33 |
| 41132.165972222225 | 14.33 |
| 41132.33263888889 | 14.33 |
| 41132.49930555555 | 14.52 |
| 41132.665972222225 | 14.59 |
| 41132.83263888889 | 14.33 |
| 41132.99930555555 | 14.33 |
| 41133.165972222225 | 14.33 |
| 41133.33263888889 | 14.33 |
| 41133.49930555555 | 14.46 |
| 41133.665972222225 | 14.46 |
| 41133.83263888889 | 14.4 |
| 41133.99930555555 | 14.33 |
| 41134.165972222225 | 14.33 |
| 41134.33263888889 | 14.33 |
| 41134.49930555555 | 14.52 |
| 41134.665972222225 | 14.46 |
| 41134.83263888889 | 14.4 |
| 41134.99930555555 | 14.33 |
| 41135.165972222225 | 14.33 |
| 41135.33263888889 | 14.4 |
| 41135.49930555555 | 14.52 |
| 41135.665972222225 | 14.4 |
| 41135.83263888889 | 14.33 |
| 41135.99930555555 | 14.33 |
| 41136.165972222225 | 14.33 |
| 41136.33263888889 | 14.33 |
| 41136.49930555555 | 14.52 |
| 41136.665972222225 | 14.59 |
| 41136.83263888889 | 14.4 |
| 41136.99930555555 | 14.33 |
| 41137.165972222225 | 14.33 |
| 41137.33263888889 | 14.33 |
| 41137.49930555555 | 14.59 |
| 41137.665972222225 | 14.4 |
| 41137.83263888889 | 14.4 |
| 41137.99930555555 | 14.33 |
| 41138.165972222225 | 14.33 |
| 41138.33263888889 | 14.4 |
| 41138.49930555555 | 14.52 |
| 41138.665972222225 | 14.59 |
| 41138.83263888889 | 14.33 |
| 41138.99930555555 | 14.33 |
| 41139.165972222225 | 14.33 |
| 41139.33263888889 | 14.33 |
| 41139.49930555555 | 14.59 |
| 41139.665972222225 | 14.52 |
| 41139.83263888889 | 14.4 |
| 41139.99930555555 | 14.33 |
| 41140.165972222225 | 14.33 |
| 41140.33263888889 | 14.33 |
| 41140.49930555555 | 14.46 |
| 41140.665972222225 | 14.52 |
| 41140.83263888889 | 14.4 |
| 41140.99930555555 | 14.33 |
| 41141.165972222225 | 14.33 |
| 41141.33263888889 | 14.33 |
| 41141.49930555555 | 14.52 |
| 41141.665972222225 | 14.59 |
| 41141.83263888889 | 14.33 |
| 41141.99930555555 | 14.33 |
| 41142.165972222225 | 14.33 |
| 41142.33263888889 | 14.33 |
| 41142.49930555555 | 14.46 |
| 41142.665972222225 | 14.52 |
| 41142.83263888889 | 14.4 |
| 41142.99930555555 | 14.33 |
| 41143.165972222225 | 14.33 |
| 41143.33263888889 | 14.33 |
| 41143.49930555555 | 14.52 |
| 41143.665972222225 | 14.52 |
| 41143.83263888889 | 14.4 |
| 41143.99930555555 | 14.33 |
| 41144.165972222225 | 14.33 |
| 41144.33263888889 | 14.33 |
| 41144.49930555555 | 14.52 |
| 41144.665972222225 | 14.59 |
| 41144.83263888889 | 14.4 |
| 41144.99930555555 | 14.33 |
| 41145.165972222225 | 14.33 |
| 41145.33263888889 | 14.4 |
| 41145.49930555555 | 14.52 |
| 41145.665972222225 | 14.52 |
| 41145.83263888889 | 14.4 |
| 41145.99930555555 | 14.33 |
| 41146.165972222225 | 14.33 |
| 41146.33263888889 | 14.4 |
| 41146.49930555555 | 14.52 |
| 41146.665972222225 | 14.46 |
| 41146.83263888889 | 14.4 |
| 41146.99930555555 | 14.4 |
| 41147.165972222225 | 14.4 |
| 41147.33263888889 | 14.4 |
| 41147.49930555555 | 14.52 |
| 41147.665972222225 | 14.52 |
| 41147.83263888889 | 14.4 |
| 41147.99930555555 | 14.4 |
| 41148.165972222225 | 14.4 |
| 41148.33263888889 | 14.4 |
| 41148.49930555555 | 14.52 |
| 41148.665972222225 | 14.59 |
| 41148.83263888889 | 14.4 |
| 41148.99930555555 | 14.4 |
| 41149.165972222225 | 14.33 |
| 41149.33263888889 | 14.4 |
| 41149.49930555555 | 14.52 |
| 41149.665972222225 | 14.59 |
| 41149.83263888889 | 14.4 |
| 41149.99930555555 | 14.4 |
| 41150.165972222225 | 14.33 |
| 41150.33263888889 | 14.33 |
| 41150.49930555555 | 14.52 |
| 41150.665972222225 | 14.65 |
| 41150.83263888889 | 14.4 |
| 41150.99930555555 | 14.4 |
| 41151.165972222225 | 14.33 |
| 41151.33263888889 | 14.4 |
| 41151.49930555555 | 14.52 |
| 41151.665972222225 | 14.52 |
| 41151.83263888889 | 14.4 |
| 41151.99930555555 | 14.4 |
| 41152.165972222225 | 14.4 |
| 41152.33263888889 | 14.46 |
| 41152.49930555555 | 14.46 |
| 41152.665972222225 | 14.46 |
| 41152.83263888889 | 14.4 |
| 41152.99930555555 | 14.46 |
| 41153.165972222225 | 14.46 |
| 41153.33263888889 | 14.46 |
| 41153.49930555555 | 14.46 |
| 41153.665972222225 | 14.46 |
| 41153.83263888889 | 14.4 |
| 41153.99930555555 | 14.4 |
| 41154.165972222225 | 14.4 |
| 41154.33263888889 | 14.4 |
| 41154.49930555555 | 14.46 |
| 41154.665972222225 | 14.46 |
| 41154.83263888889 | 14.4 |
| 41154.99930555555 | 14.4 |
| 41155.165972222225 | 14.4 |
| 41155.33263888889 | 14.4 |
| 41155.49930555555 | 14.52 |
| 41155.665972222225 | 14.65 |
| 41155.83263888889 | 14.4 |
| 41155.99930555555 | 14.4 |
| 41156.165972222225 | 14.4 |
| 41156.33263888889 | 14.4 |
| 41156.49930555555 | 14.52 |
| 41156.665972222225 | 14.65 |
| 41156.83263888889 | 14.4 |
| 41156.99930555555 | 14.4 |
| 41157.165972222225 | 14.4 |
| 41157.33263888889 | 14.4 |
| 41157.49930555555 | 14.52 |
| 41157.665972222225 | 14.65 |
| 41157.83263888889 | 14.4 |
| 41157.99930555555 | 14.4 |
| 41158.165972222225 | 14.4 |
| 41158.33263888889 | 14.4 |
| 41158.49930555555 | 14.52 |
| 41158.665972222225 | 14.46 |
| 41158.83263888889 | 14.4 |
| 41158.99930555555 | 14.4 |
| 41159.165972222225 | 14.4 |
| 41159.33263888889 | 14.4 |
| 41159.49930555555 | 14.59 |
| 41159.665972222225 | 14.59 |
| 41159.83263888889 | 14.4 |
| 41159.99930555555 | 14.4 |
| 41160.165972222225 | 14.4 |
| 41160.33263888889 | 14.4 |
| 41160.49930555555 | 14.52 |
| 41160.665972222225 | 14.59 |
| 41160.83263888889 | 14.4 |
| 41160.99930555555 | 14.33 |
| 41161.165972222225 | 14.33 |
| 41161.33263888889 | 14.33 |
| 41161.49930555555 | 14.59 |
| 41161.665972222225 | 14.59 |
| 41161.83263888889 | 14.4 |
| 41161.99930555555 | 14.33 |
| 41162.165972222225 | 14.33 |
| 41162.33263888889 | 14.33 |
| 41162.49930555555 | 14.59 |
| 41162.665972222225 | 14.59 |
| 41162.83263888889 | 14.4 |
| 41162.99930555555 | 14.33 |
| 41163.165972222225 | 14.33 |
| 41163.33263888889 | 14.33 |
| 41163.49930555555 | 14.59 |
| 41163.665972222225 | 14.59 |
| 41163.83263888889 | 14.4 |
| 41163.99930555555 | 14.4 |
| 41164.165972222225 | 14.33 |
| 41164.33263888889 | 14.33 |
| 41164.49930555555 | 14.59 |
| 41164.665972222225 | 14.65 |
| 41164.83263888889 | 14.4 |
| 41164.99930555555 | 14.4 |
| 41165.165972222225 | 14.33 |
| 41165.33263888889 | 14.4 |
| 41165.49930555555 | 14.59 |
| 41165.665972222225 | 14.65 |
| 41165.83263888889 | 14.4 |
| 41165.99930555555 | 14.4 |
| 41166.165972222225 | 14.4 |
| 41166.33263888889 | 14.4 |
| 41166.49930555555 | 14.52 |
| 41166.665972222225 | 14.46 |
| 41166.83263888889 | 14.4 |
| 41166.99930555555 | 14.4 |
| 41167.165972222225 | 14.4 |
| 41167.33263888889 | 14.4 |
| 41167.49930555555 | 14.4 |
| 41167.665972222225 | 14.4 |
| 41167.83263888889 | 14.4 |
| 41167.99930555555 | 14.4 |
| 41168.165972222225 | 14.4 |
| 41168.33263888889 | 14.4 |
| 41168.49930555555 | 14.46 |
| 41168.665972222225 | 14.46 |
| 41168.83263888889 | 14.4 |
| 41168.99930555555 | 14.4 |
| 41169.165972222225 | 14.4 |
| 41169.33263888889 | 14.4 |
| 41169.49930555555 | 14.46 |
| 41169.665972222225 | 14.52 |
| 41169.83263888889 | 14.4 |
| 41169.99930555555 | 14.4 |
| 41170.165972222225 | 14.4 |
| 41170.33263888889 | 14.33 |
| 41170.49930555555 | 14.59 |
| 41170.665972222225 | 14.59 |
| 41170.83263888889 | 14.33 |
| 41170.99930555555 | 14.33 |
| 41171.165972222225 | 14.33 |
| 41171.33263888889 | 14.33 |
| 41171.49930555555 | 14.52 |
| 41171.665972222225 | 14.59 |
| 41171.83263888889 | 14.4 |
| 41171.99930555555 | 14.4 |
| 41172.165972222225 | 14.33 |
| 41172.33263888889 | 14.4 |
| 41172.49930555555 | 14.59 |
| 41172.665972222225 | 14.59 |
| 41172.83263888889 | 14.4 |
| 41172.99930555555 | 14.4 |
| 41173.165972222225 | 14.33 |
| 41173.33263888889 | 14.4 |
| 41173.49930555555 | 14.65 |
| 41173.665972222225 | 14.59 |
| 41173.83263888889 | 14.4 |
| 41173.99930555555 | 14.4 |
| 41174.165972222225 | 14.33 |
| 41174.33263888889 | 14.33 |
| 41174.49930555555 | 14.9 |
| 41174.665972222225 | 14.59 |
| 41174.83263888889 | 14.4 |
| 41174.99930555555 | 14.33 |
| 41175.165972222225 | 14.33 |
| 41175.33263888889 | 14.33 |
| 41175.49930555555 | 14.78 |
| 41175.665972222225 | 14.59 |
| 41175.83263888889 | 14.33 |
| 41175.99930555555 | 14.33 |
| 41176.165972222225 | 14.33 |
| 41176.33263888889 | 14.33 |
| 41176.49930555555 | 14.52 |
| 41176.665972222225 | 14.52 |
| 41176.83263888889 | 14.4 |
| 41176.99930555555 | 14.4 |
| 41177.165972222225 | 14.4 |
| 41177.33263888889 | 14.4 |
| 41177.49930555555 | 14.59 |
| 41177.665972222225 | 14.65 |
| 41177.83263888889 | 14.4 |
| 41177.99930555555 | 14.4 |
| 41178.165972222225 | 14.4 |
| 41178.33263888889 | 14.4 |
| 41178.49930555555 | 14.46 |
| 41178.665972222225 | 14.4 |
| 41178.83263888889 | 14.4 |
| 41178.99930555555 | 14.4 |
| 41179.165972222225 | 14.4 |
| 41179.33263888889 | 14.4 |
| 41179.49930555555 | 14.46 |
| 41179.665972222225 | 14.46 |
| 41179.83263888889 | 14.4 |
| 41179.99930555555 | 14.4 |
| 41180.165972222225 | 14.4 |
| 41180.33263888889 | 14.4 |
| 41180.49930555555 | 14.46 |
| 41180.665972222225 | 14.46 |
| 41180.83263888889 | 14.4 |
| 41180.99930555555 | 14.4 |
| 41181.165972222225 | 14.4 |
| 41181.33263888889 | 14.4 |
| 41181.49930555555 | 14.52 |
| 41181.665972222225 | 14.59 |
| 41181.83263888889 | 14.4 |
| 41181.99930555555 | 14.4 |
| 41182.165972222225 | 14.4 |
| 41182.33263888889 | 14.4 |
| 41182.49930555555 | 14.52 |
| 41182.665972222225 | 14.52 |
| 41182.83263888889 | 14.4 |
| 41182.99930555555 | 14.4 |
| 41183.165972222225 | 14.4 |
| 41183.33263888889 | 14.4 |
| 41183.49930555555 | 14.46 |
| 41183.665972222225 | 14.52 |
| 41183.83263888889 | 14.4 |
| 41183.99930555555 | 14.33 |
| 41184.165972222225 | 14.33 |
| 41184.33263888889 | 14.33 |
| 41184.49930555555 | 14.52 |
| 41184.665972222225 | 14.59 |
| 41184.83263888889 | 14.4 |
| 41184.99930555555 | 14.4 |
| 41185.165972222225 | 14.4 |
| 41185.33263888889 | 14.4 |
| 41185.49930555555 | 14.52 |
| 41185.665972222225 | 14.52 |
| 41185.83263888889 | 14.4 |
| 41185.99930555555 | 14.4 |
| 41186.165972222225 | 14.33 |
| 41186.33263888889 | 14.33 |
| 41186.49930555555 | 14.59 |
| 41186.665972222225 | 14.59 |
| 41186.83263888889 | 14.4 |
| 41186.99930555555 | 14.4 |
| 41187.165972222225 | 14.4 |
| 41187.33263888889 | 14.4 |
| 41187.49930555555 | 14.4 |
| 41187.665972222225 | 14.33 |
| 41187.83263888889 | 14.33 |
| 41187.99930555555 | 14.33 |
| 41188.165972222225 | 14.33 |
| 41188.33263888889 | 14.33 |
| 41188.49930555555 | 14.46 |
| 41188.665972222225 | 14.4 |
| 41188.83263888889 | 14.33 |
| 41188.99930555555 | 14.33 |
| 41189.165972222225 | 14.33 |
| 41189.33263888889 | 14.27 |
| 41189.49930555555 | 14.4 |
| 41189.665972222225 | 14.4 |
| 41189.83263888889 | 14.33 |
| 41189.99930555555 | 14.33 |
| 41190.165972222225 | 14.33 |
| 41190.33263888889 | 14.33 |
| 41190.49930555555 | 14.4 |
| 41190.665972222225 | 14.46 |
| 41190.83263888889 | 14.33 |
| 41190.99930555555 | 14.33 |
| 41191.165972222225 | 14.27 |
| 41191.33263888889 | 14.27 |
| 41191.49930555555 | 14.4 |
| 41191.665972222225 | 14.46 |
| 41191.83263888889 | 14.4 |
| 41191.99930555555 | 14.4 |
| 41192.165972222225 | 14.33 |
| 41192.33263888889 | 14.33 |
| 41192.49930555555 | 14.4 |
| 41192.665972222225 | 14.46 |
| 41192.83263888889 | 14.33 |
| 41192.99930555555 | 14.33 |
| 41193.165972222225 | 14.33 |
| 41193.33263888889 | 14.33 |
| 41193.49930555555 | 14.4 |
| 41193.665972222225 | 14.4 |
| 41193.83263888889 | 14.4 |
| 41193.99930555555 | 14.4 |
| 41194.165972222225 | 14.4 |
| 41194.33263888889 | 14.4 |
| 41194.49930555555 | 14.4 |
| 41194.665972222225 | 14.4 |
| 41194.83263888889 | 14.4 |
| 41194.99930555555 | 14.4 |
| 41195.165972222225 | 14.4 |
| 41195.33263888889 | 14.4 |
| 41195.49930555555 | 14.46 |
| 41195.665972222225 | 14.46 |
| 41195.83263888889 | 14.4 |
| 41195.99930555555 | 14.46 |
| 41196.165972222225 | 14.4 |
| 41196.33263888889 | 14.4 |
| 41196.49930555555 | 14.46 |
| 41196.665972222225 | 14.46 |
| 41196.83263888889 | 14.4 |
| 41196.99930555555 | 14.33 |
| 41197.165972222225 | 14.33 |
| 41197.33263888889 | 14.33 |
| 41197.49930555555 | 14.46 |
| 41197.665972222225 | 14.52 |
| 41197.83263888889 | 14.4 |
| 41197.99930555555 | 14.4 |
| 41198.165972222225 | 14.33 |
| 41198.33263888889 | 14.33 |
| 41198.49930555555 | 14.46 |
| 41198.665972222225 | 14.52 |
| 41198.83263888889 | 14.4 |
| 41198.99930555555 | 14.4 |
| 41199.165972222225 | 14.4 |
| 41199.33263888889 | 14.4 |
| 41199.49930555555 | 14.46 |
| 41199.665972222225 | 14.46 |
| 41199.83263888889 | 14.4 |
| 41199.99930555555 | 14.4 |
| 41200.165972222225 | 14.33 |
| 41200.33263888889 | 14.33 |
| 41200.49930555555 | 14.4 |
| 41200.665972222225 | 14.46 |
| 41200.83263888889 | 14.33 |
| 41200.99930555555 | 14.33 |
| 41201.165972222225 | 14.33 |
| 41201.33263888889 | 14.33 |
| 41201.49930555555 | 14.4 |
| 41201.665972222225 | 14.4 |
| 41201.83263888889 | 14.4 |
| 41201.99930555555 | 14.4 |
| 41202.165972222225 | 14.33 |
| 41202.33263888889 | 14.33 |
| 41202.49930555555 | 14.46 |
| 41202.665972222225 | 14.52 |
| 41202.83263888889 | 14.4 |
| 41202.99930555555 | 14.33 |
| 41203.165972222225 | 14.33 |
| 41203.33263888889 | 14.33 |
| 41203.49930555555 | 14.46 |
| 41203.665972222225 | 14.52 |
| 41203.83263888889 | 14.4 |
| 41203.99930555555 | 14.4 |
| 41204.165972222225 | 14.4 |
| 41204.33263888889 | 14.4 |
| 41204.49930555555 | 14.52 |
| 41204.665972222225 | 14.59 |
| 41204.83263888889 | 14.46 |
| 41204.99930555555 | 14.4 |
| 41205.165972222225 | 14.4 |
| 41205.33263888889 | 14.4 |
| 41205.49930555555 | 14.52 |
| 41205.665972222225 | 14.52 |
| 41205.83263888889 | 14.4 |
| 41205.99930555555 | 14.4 |
| 41206.165972222225 | 14.4 |
| 41206.33263888889 | 14.4 |
| 41206.49930555555 | 14.52 |
| 41206.665972222225 | 14.52 |
| 41206.83263888889 | 14.4 |
| 41206.99930555555 | 14.4 |
| 41207.165972222225 | 14.4 |
| 41207.33263888889 | 14.4 |
| 41207.49930555555 | 14.52 |
| 41207.665972222225 | 14.52 |
| 41207.83263888889 | 14.4 |
| 41207.99930555555 | 14.33 |
| 41208.165972222225 | 14.33 |
| 41208.33263888889 | 14.33 |
| 41208.49930555555 | 14.4 |
| 41208.665972222225 | 14.46 |
| 41208.83263888889 | 14.33 |
| 41208.99930555555 | 14.33 |
| 41209.165972222225 | 14.27 |
| 41209.33263888889 | 14.33 |
| 41209.49930555555 | 14.4 |
| 41209.665972222225 | 14.46 |
| 41209.83263888889 | 14.33 |
| 41209.99930555555 | 14.33 |
| 41210.165972222225 | 14.27 |
| 41210.33263888889 | 14.27 |
| 41210.49930555555 | 14.4 |
| 41210.665972222225 | 14.46 |
| 41210.83263888889 | 14.33 |
| 41210.99930555555 | 14.27 |
| 41211.165972222225 | 14.27 |
| 41211.33263888889 | 14.27 |
| 41211.49930555555 | 14.4 |
| 41211.665972222225 | 14.4 |
| 41211.83263888889 | 14.33 |
| 41211.99930555555 | 14.33 |
| 41212.165972222225 | 14.33 |
| 41212.33263888889 | 14.27 |
| 41212.49930555555 | 14.4 |
| 41212.665972222225 | 14.46 |
| 41212.83263888889 | 14.33 |
| 41212.99930555555 | 14.33 |
| 41213.165972222225 | 14.33 |
| 41213.33263888889 | 14.33 |
| 41213.49930555555 | 14.46 |
| 41213.665972222225 | 14.46 |
| 41213.83263888889 | 14.33 |
| 41213.99930555555 | 14.33 |
| 41214.165972222225 | 14.33 |
| 41214.33263888889 | 14.33 |
| 41214.49930555555 | 14.46 |
| 41214.665972222225 | 14.46 |
| 41214.83263888889 | 14.4 |
| 41214.99930555555 | 14.33 |
| 41215.165972222225 | 14.33 |
| 41215.33263888889 | 14.33 |
| 41215.49930555555 | 14.46 |
| 41215.665972222225 | 14.46 |
| 41215.83263888889 | 14.4 |
| 41215.99930555555 | 14.33 |
| 41216.165972222225 | 14.33 |
| 41216.33263888889 | 14.33 |
| 41216.49930555555 | 14.46 |
| 41216.665972222225 | 14.46 |
| 41216.83263888889 | 14.4 |
| 41216.99930555555 | 14.33 |
| 41217.12430555555 | 14.33 |
| 41217.290972222225 | 14.33 |
| 41217.45763888889 | 14.46 |
| 41217.62430555555 | 14.46 |
| 41217.790972222225 | 14.33 |
| 41217.95763888889 | 14.33 |
| 41218.12430584491 | 14.33 |
| 41218.29097256945 | 14.33 |
| 41218.45763929398 | 14.4 |
| 41218.624306018515 | 14.4 |
| 41218.79097274305 | 14.4 |
| 41218.95763946759 | 14.33 |
| 41219.12430619213 | 14.33 |
| 41219.290972916664 | 14.33 |
| 41219.4576396412 | 14.4 |
| 41219.62430636574 | 14.4 |
| 41219.790973090276 | 14.33 |
| 41219.95763981481 | 14.33 |
| 41220.12430653935 | 14.33 |
| 41220.29097326389 | 14.33 |
| 41220.457639988424 | 14.4 |
| 41220.62430671296 | 14.4 |
| 41220.7909734375 | 14.33 |
| 41220.957640162036 | 14.33 |
| 41221.12430688657 | 14.27 |
| 41221.29097361111 | 14.27 |
| 41221.45764033565 | 14.4 |
| 41221.624307060185 | 14.46 |
| 41221.79097378472 | 14.33 |
| 41221.95764050926 | 14.33 |
| 41222.1243072338 | 14.33 |
| 41222.290973958334 | 14.33 |
| 41222.45764068287 | 14.46 |
| 41222.62430740741 | 14.52 |
| 41222.790974131945 | 14.4 |
| 41222.95764085648 | 14.4 |
| 41223.12430758102 | 14.4 |
| 41223.29097430556 | 14.4 |
| 41223.457641030094 | 14.46 |
| 41223.62430775463 | 14.52 |
| 41223.79097447917 | 14.4 |
| 41223.957641203706 | 14.4 |
| 41224.12430792824 | 14.4 |
| 41224.29097465278 | 14.4 |
| 41224.45764137732 | 14.46 |
| 41224.624308101855 | 14.46 |
| 41224.79097482639 | 14.4 |
| 41224.95764155093 | 14.33 |
| 41225.124308275466 | 14.33 |
| 41225.290975 | 14.33 |
| 41225.45764172453 | 14.4 |
| 41225.62430844907 | 14.4 |
| 41225.79097517361 | 14.33 |
| 41225.957641898145 | 14.33 |
| 41226.12430862268 | 14.33 |
| 41226.29097534722 | 14.27 |
| 41226.45764207176 | 14.4 |
| 41226.624308796294 | 14.4 |
| 41226.79097552083 | 14.33 |
| 41226.95764224537 | 14.33 |
| 41227.124308969906 | 14.33 |
| 41227.29097569444 | 14.33 |
| 41227.45764241898 | 14.4 |
| 41227.62430914352 | 14.4 |
| 41227.790975868054 | 14.33 |
| 41227.95764259259 | 14.27 |
| 41228.12430931713 | 14.27 |
| 41228.290976041666 | 14.27 |
| 41228.4576427662 | 14.4 |
| 41228.62430949074 | 14.46 |
| 41228.79097621528 | 14.33 |
| 41228.957642939815 | 14.33 |
| 41229.12430966435 | 14.33 |
| 41229.29097638889 | 14.27 |
| 41229.45764311343 | 14.46 |
| 41229.624309837964 | 14.46 |
| 41229.7909765625 | 14.33 |
| 41229.95764328704 | 14.33 |
| 41230.124310011575 | 14.27 |
| 41230.29097673611 | 14.27 |
| 41230.45764346065 | 14.4 |
| 41230.62431018519 | 14.46 |
| 41230.790976909724 | 14.33 |
| 41230.95764363426 | 14.33 |
| 41231.1243103588 | 14.27 |
| 41231.290977083336 | 14.27 |
| 41231.45764380787 | 14.4 |
| 41231.62431053241 | 14.46 |
| 41231.79097725695 | 14.33 |
| 41231.957643981485 | 14.33 |
| 41232.12431070602 | 14.33 |
| 41232.29097743056 | 14.33 |
| 41232.457644155096 | 14.4 |
| 41232.624310879626 | 14.4 |
| 41232.79097760416 | 14.4 |
| 41232.9576443287 | 14.33 |
| 41233.12431105324 | 14.33 |
| 41233.290977777775 | 14.33 |
| 41233.45764450231 | 14.46 |
| 41233.62431122685 | 14.46 |
| 41233.79097795139 | 14.4 |
| 41233.957644675924 | 14.33 |
| 41234.12431140046 | 14.33 |
| 41234.290978125 | 14.33 |
| 41234.457644849535 | 14.46 |
| 41234.62431157407 | 14.46 |
| 41234.79097829861 | 14.33 |
| 41234.95764502315 | 14.33 |
| 41235.124311747684 | 14.33 |
| 41235.29097847222 | 14.33 |
| 41235.45764519676 | 14.46 |
| 41235.624311921296 | 14.46 |
| 41235.79097864583 | 14.4 |
| 41235.95764537037 | 14.4 |
| 41236.12431209491 | 14.4 |
| 41236.290978819445 | 14.33 |
| 41236.45764554398 | 14.4 |
| 41236.62431226852 | 14.4 |
| 41236.790978993056 | 14.33 |
| 41236.95764571759 | 14.27 |
| 41237.12431244213 | 14.27 |
| 41237.29097916667 | 14.27 |
| 41237.457645891205 | 14.4 |
| 41237.62431261574 | 14.4 |
| 41237.79097934028 | 14.33 |
| 41237.95764606482 | 14.27 |
| 41238.124312789354 | 14.27 |
| 41238.29097951389 | 14.27 |
| 41238.45764623843 | 14.4 |
| 41238.624312962966 | 14.46 |
| 41238.7909796875 | 14.33 |
| 41238.95764641204 | 14.33 |
| 41239.12431313658 | 14.33 |
| 41239.290979861114 | 14.33 |
| 41239.45764658565 | 14.4 |
| 41239.62431331018 | 14.4 |
| 41239.79098003472 | 14.33 |
| 41239.957646759256 | 14.33 |
| 41240.12431348379 | 14.33 |
| 41240.29098020833 | 14.27 |
| 41240.45764693287 | 14.4 |
| 41240.624313657405 | 14.4 |
| 41240.79098038194 | 14.33 |
| 41240.95764710648 | 14.27 |
| 41241.12431383102 | 14.27 |
| 41241.290980555554 | 14.27 |
| 41241.45764728009 | 14.4 |
| 41241.62431400463 | 14.4 |
| 41241.790980729165 | 14.33 |
| 41241.9576474537 | 14.33 |
| 41242.12431417824 | 14.27 |
| 41242.29098090278 | 14.27 |
| 41242.457647627314 | 14.4 |
| 41242.62431435185 | 14.4 |
| 41242.79098107639 | 14.33 |
| 41242.957647800926 | 14.33 |
| 41243.12431452546 | 14.33 |
| 41243.29098125 | 14.33 |
| 41243.45764797454 | 14.46 |
| 41243.624314699075 | 14.46 |
| 41243.79098142361 | 14.4 |
| 41243.95764814815 | 14.4 |
| 41244.124314872686 | 14.4 |
| 41244.29098159722 | 14.4 |
| 41244.45764832176 | 14.46 |
| 41244.6243150463 | 14.46 |
| 41244.790981770835 | 14.46 |
| 41244.95764849537 | 14.46 |
| 41245.12431521991 | 14.4 |
| 41245.29098194445 | 14.4 |
| 41245.457648668984 | 14.46 |
| 41245.62431539352 | 14.52 |
| 41245.79098211806 | 14.4 |
| 41245.957648842596 | 14.4 |
| 41246.12431556713 | 14.46 |
| 41246.29098229167 | 14.46 |
| 41246.45764901621 | 14.52 |
| 41246.624315740744 | 14.52 |
| 41246.790982465274 | 14.46 |
| 41246.95764918981 | 14.4 |
| 41247.12431591435 | 14.4 |
| 41247.290982638886 | 14.4 |
| 41247.45764936342 | 14.4 |
| 41247.62431608796 | 14.46 |
| 41247.7909828125 | 14.33 |
| 41247.957649537035 | 14.33 |
| 41248.12431626157 | 14.33 |
| 41248.29098298611 | 14.27 |
| 41248.45764971065 | 14.4 |
| 41248.62431643518 | 14.46 |
| 41248.79098315972 | 14.33 |
| 41248.95764988426 | 14.33 |
| 41249.124316608795 | 14.33 |
| 41249.29098333333 | 14.33 |
| 41249.45765005787 | 14.46 |
| 41249.62431678241 | 14.46 |
| 41249.790983506944 | 14.4 |
| 41249.95765023148 | 14.4 |
| 41250.12431695602 | 14.4 |
| 41250.290983680556 | 14.4 |
| 41250.45765040509 | 14.46 |
| 41250.62431712963 | 14.46 |
| 41250.79098385417 | 14.4 |
| 41250.957650578704 | 14.4 |
| 41251.12431730324 | 14.4 |
| 41251.29098402778 | 14.4 |
| 41251.457650752316 | 14.4 |
| 41251.62431747685 | 14.4 |
| 41251.79098420139 | 14.4 |
| 41251.95765092593 | 14.4 |
| 41252.124317650465 | 14.4 |
| 41252.290984375 | 14.4 |
| 41252.45765109954 | 14.46 |
| 41252.62431782408 | 14.46 |
| 41252.790984548614 | 14.4 |
| 41252.95765127315 | 14.4 |
| 41253.12431799769 | 14.33 |
| 41253.290984722225 | 14.27 |
| 41253.45765144676 | 14.33 |
| 41253.6243181713 | 14.33 |
| 41253.79098489583 | 14.33 |
| 41253.95765162037 | 14.27 |
| 41254.124318344904 | 14.27 |
| 41254.29098506944 | 14.27 |
| 41254.45765179398 | 14.33 |
| 41254.624318518516 | 14.4 |
| 41254.79098524305 | 14.33 |
| 41254.95765196759 | 14.27 |
| 41255.12431869213 | 14.27 |
| 41255.290985416665 | 14.27 |
| 41255.4576521412 | 14.33 |
| 41255.62431886574 | 14.4 |
| 41255.790985590276 | 14.33 |
| 41255.95765231481 | 14.27 |
| 41256.12431903935 | 14.27 |
| 41256.29098576389 | 14.27 |
| 41256.457652488425 | 14.4 |
| 41256.62431921296 | 14.46 |
| 41256.7909859375 | 14.33 |
| 41256.95765266204 | 14.33 |
| 41257.124319386574 | 14.27 |
| 41257.29098611111 | 14.27 |
| 41257.45765283565 | 14.4 |
| 41257.624319560186 | 14.4 |
| 41257.79098628472 | 14.4 |
| 41257.95765300926 | 14.4 |
| 41258.1243197338 | 14.4 |
| 41258.290986458334 | 14.4 |
| 41258.45765318287 | 14.46 |
| 41258.62431990741 | 14.46 |
| 41258.790986631946 | 14.4 |
| 41258.95765335648 | 14.33 |
| 41259.12432008102 | 14.33 |
| 41259.29098680556 | 14.33 |
| 41259.457653530095 | 14.4 |
| 41259.62432025463 | 14.46 |
| 41259.79098697917 | 14.33 |
| 41259.95765370371 | 14.33 |
| 41260.124320428244 | 14.33 |
| 41260.29098715278 | 14.4 |
| 41260.45765387732 | 14.4 |
| 41260.624320601855 | 14.4 |
| 41260.79098732639 | 14.33 |
| 41260.95765405092 | 14.33 |
| 41261.12432077546 | 14.33 |
| 41261.2909875 | 14.33 |
| 41261.457654224534 | 14.4 |
| 41261.62432094907 | 14.46 |
| 41261.79098767361 | 14.33 |
| 41261.957654398146 | 14.33 |
| 41262.12432112268 | 14.33 |
| 41262.29098784722 | 14.33 |
| 41262.45765457176 | 14.4 |
| 41262.624321296295 | 14.4 |
| 41262.79098802083 | 14.4 |
| 41262.95765474537 | 14.4 |
| 41263.124321469906 | 14.4 |
| 41263.29098819444 | 14.4 |
| 41263.45765491898 | 14.33 |
| 41263.62432164352 | 14.33 |
| 41263.790988368055 | 14.33 |
| 41263.95765509259 | 14.33 |
| 41264.12432181713 | 14.33 |
| 41264.29098854167 | 14.33 |
| 41264.457655266204 | 14.33 |
| 41264.62432199074 | 14.4 |
| 41264.79098871528 | 14.33 |
| 41264.957655439815 | 14.33 |
| 41265.12432216435 | 14.33 |
| 41265.29098888889 | 14.27 |
| 41265.45765561343 | 14.4 |
| 41265.624322337964 | 14.46 |
| 41265.7909890625 | 14.33 |
| 41265.95765578704 | 14.33 |
| 41266.124322511576 | 14.33 |
| 41266.29098923611 | 14.33 |
| 41266.45765596065 | 14.4 |
| 41266.62432268519 | 14.46 |
| 41266.790989409725 | 14.4 |
| 41266.95765613426 | 14.4 |
| 41267.1243228588 | 14.4 |
| 41267.290989583336 | 14.33 |
| 41267.45765630787 | 14.4 |
| 41267.62432303241 | 14.4 |
| 41267.79098975695 | 14.33 |
| 41267.95765648148 | 14.33 |
| 41268.124323206015 | 14.33 |
| 41268.29098993055 | 14.33 |
| 41268.45765665509 | 14.33 |
| 41268.62432337963 | 14.33 |
| 41268.790990104164 | 14.33 |
| 41268.9576568287 | 14.33 |
| 41269.12432355324 | 14.27 |
| 41269.290990277776 | 14.27 |
| 41269.45765700231 | 14.33 |
| 41269.62432372685 | 14.4 |
| 41269.79099045139 | 14.33 |
| 41269.957657175924 | 14.33 |
| 41270.12432390046 | 14.33 |
| 41270.290990625 | 14.27 |
| 41270.457657349536 | 14.4 |
| 41270.62432407407 | 14.33 |
| 41270.79099079861 | 14.33 |
| 41270.95765752315 | 14.33 |
| 41271.124324247685 | 14.33 |
| 41271.29099097222 | 14.33 |
| 41271.45765769676 | 14.33 |
| 41271.6243244213 | 14.33 |
| 41271.790991145834 | 14.27 |
| 41271.95765787037 | 14.33 |
| 41272.12432459491 | 14.33 |
| 41272.290991319445 | 14.27 |
| 41272.45765804398 | 14.33 |
| 41272.62432476852 | 14.33 |
| 41272.79099149306 | 14.27 |
| 41272.957658217594 | 14.27 |
| 41273.12432494213 | 14.27 |
| 41273.29099166667 | 14.21 |
| 41273.457658391206 | 14.33 |
| 41273.62432511574 | 14.4 |
| 41273.79099184028 | 14.33 |
| 41273.95765856482 | 14.33 |
| 41274.124325289355 | 14.33 |
| 41274.29099201389 | 14.33 |
| 41274.45765873843 | 14.4 |
| 41274.624325462966 | 14.33 |
| 41274.7909921875 | 14.33 |
| 41274.95765891204 | 14.33 |
| 41275.12432563657 | 14.33 |
| 41275.29099236111 | 14.33 |
| 41275.457659085645 | 14.33 |
| 41275.62432581018 | 14.33 |
| 41275.79099253472 | 14.33 |
| 41275.95765925926 | 14.33 |
| 41276.124325983794 | 14.27 |
| 41276.29099270833 | 14.27 |
| 41276.45765943287 | 14.33 |
| 41276.624326157405 | 14.4 |
| 41276.79099288194 | 14.33 |
| 41276.95765960648 | 14.27 |
| 41277.12432633102 | 14.27 |
| 41277.290993055554 | 14.27 |
| 41277.45765978009 | 14.33 |
| 41277.62432650463 | 14.4 |
| 41277.790993229166 | 14.33 |
| 41277.9576599537 | 14.27 |
| 41278.12432667824 | 14.27 |
| 41278.29099340278 | 14.33 |
| 41278.457660127315 | 14.33 |
| 41278.62432685185 | 14.4 |
| 41278.79099357639 | 14.33 |
| 41278.95766030093 | 14.27 |
| 41279.12432702546 | 14.27 |
| 41279.29099375 | 14.33 |
| 41279.45766047454 | 14.4 |
| 41279.624327199075 | 14.4 |
| 41279.79099392361 | 14.33 |
| 41279.95766064815 | 14.33 |
| 41280.12432737269 | 14.33 |
| 41280.290994097224 | 14.33 |
| 41280.45766082176 | 14.33 |
| 41280.6243275463 | 14.4 |
| 41280.790994270836 | 14.33 |
| 41280.95766099537 | 14.27 |
| 41281.12432771991 | 14.27 |
| 41281.29099444445 | 14.27 |
| 41281.457661168984 | 14.33 |
| 41281.62432789352 | 14.46 |
| 41281.79099461806 | 14.33 |
| 41281.957661342596 | 14.33 |
| 41282.124328067126 | 14.27 |
| 41282.29099479166 | 14.27 |
| 41282.4576615162 | 14.4 |
| 41282.62432824074 | 14.46 |
| 41282.790994965275 | 14.33 |
| 41282.95766168981 | 14.4 |
| 41283.12432841435 | 14.4 |
| 41283.29099513889 | 14.4 |
| 41283.457661863424 | 14.4 |
| 41283.62432858796 | 14.46 |
| 41283.7909953125 | 14.4 |
| 41283.957662037035 | 14.4 |
| 41284.12432876157 | 14.4 |
| 41284.29099548611 | 14.4 |
| 41284.45766221065 | 14.4 |
| 41284.624328935184 | 14.4 |
| 41284.79099565972 | 14.4 |
| 41284.95766238426 | 14.4 |
| 41285.124329108796 | 14.4 |
| 41285.29099583333 | 14.4 |
| 41285.45766255787 | 14.4 |
| 41285.62432928241 | 14.46 |
| 41285.790996006945 | 14.4 |
| 41285.95766273148 | 14.4 |
| 41286.12432945602 | 14.4 |
| 41286.290996180556 | 14.4 |
| 41286.45766290509 | 14.46 |
| 41286.62432962963 | 14.4 |
| 41286.79099635417 | 14.27 |
| 41286.957663078705 | 14.4 |
| 41287.12432980324 | 14.4 |
| 41287.29099652778 | 14.4 |
| 41287.45766325232 | 14.4 |
| 41287.624329976854 | 14.4 |
| 41287.79099670139 | 14.4 |
| 41287.95766342593 | 14.4 |
| 41288.124330150466 | 14.33 |
| 41288.290996875 | 14.33 |
| 41288.45766359954 | 14.33 |
| 41288.62433032408 | 14.33 |
| 41288.790997048614 | 14.27 |
| 41288.95766377315 | 14.27 |
| 41289.12433049769 | 14.27 |
| 41289.29099722222 | 14.21 |
| 41289.457663946756 | 14.27 |
| 41289.62433067129 | 14.27 |
| 41289.79099739583 | 14.27 |
| 41289.95766412037 | 14.27 |
| 41290.124330844905 | 14.21 |
| 41290.29099756944 | 14.21 |
| 41290.45766429398 | 14.27 |
| 41290.62433101852 | 14.27 |
| 41290.79099774305 | 14.27 |
| 41290.95766446759 | 14.27 |
| 41291.12433119213 | 14.21 |
| 41291.290997916665 | 14.27 |
| 41291.4576646412 | 14.27 |
| 41291.62433136574 | 14.33 |
| 41291.79099809028 | 14.27 |
| 41291.957664814814 | 14.27 |
| 41292.12433153935 | 14.27 |
| 41292.29099826389 | 14.21 |
| 41292.457664988426 | 14.27 |
| 41292.62433171296 | 14.33 |
| 41292.7909984375 | 14.27 |
| 41292.95766516204 | 14.27 |
| 41293.124331886575 | 14.21 |
| 41293.29099861111 | 14.21 |
| 41293.45766533565 | 14.27 |
| 41293.624332060186 | 14.33 |
| 41293.79099878472 | 14.27 |
| 41293.95766550926 | 14.21 |
| 41294.1243322338 | 14.21 |
| 41294.290998958335 | 14.21 |
| 41294.45766568287 | 14.27 |
| 41294.62433240741 | 14.33 |
| 41294.79099913195 | 14.27 |
| 41294.957665856484 | 14.21 |
| 41295.12433258102 | 14.21 |
| 41295.29099930556 | 14.21 |
| 41295.457666030095 | 14.21 |
| 41295.62433275463 | 14.27 |
| 41295.79099947917 | 14.21 |
| 41295.95766620371 | 14.21 |
| 41296.124332928244 | 14.21 |
| 41296.290999652774 | 14.21 |
| 41296.45766637731 | 14.21 |
| 41296.62433310185 | 14.27 |
| 41296.790999826386 | 14.21 |
| 41296.95766655092 | 14.21 |
| 41297.12433327546 | 14.21 |
| 41297.291 | 14.14 |
| 41297.457666724535 | 14.27 |
| 41297.62433344907 | 14.33 |
| 41297.79100017361 | 14.21 |
| 41297.957666898146 | 14.21 |
| 41298.12433362268 | 14.21 |
| 41298.29100034722 | 14.21 |
| 41298.45766707176 | 14.21 |
| 41298.624333796295 | 14.27 |
| 41298.79100052083 | 14.21 |
| 41298.95766724537 | 14.21 |
| 41299.12433396991 | 14.21 |
| 41299.291000694444 | 14.21 |
| 41299.45766741898 | 14.27 |
| 41299.62433414352 | 14.33 |
| 41299.791000868056 | 14.21 |
| 41299.95766759259 | 14.21 |
| 41300.12433431713 | 14.21 |
| 41300.29100104167 | 14.21 |
| 41300.457667766204 | 14.27 |
| 41300.62433449074 | 14.33 |
| 41300.79100121528 | 14.21 |
| 41300.957667939816 | 14.21 |
| 41301.12433466435 | 14.27 |
| 41301.29100138889 | 14.27 |
| 41301.45766811343 | 14.27 |
| 41301.624334837965 | 14.27 |
| 41301.7910015625 | 14.27 |
| 41301.95766828704 | 14.33 |
| 41302.12433501158 | 14.33 |
| 41302.291001736114 | 14.33 |
| 41302.45766846065 | 14.4 |
| 41302.62433518519 | 14.4 |
| 41302.791001909725 | 14.33 |
| 41302.95766863426 | 14.33 |
| 41303.1243353588 | 14.33 |
| 41303.29100208334 | 14.33 |
| 41303.45766880787 | 14.33 |
| 41303.624335532404 | 14.4 |
| 41303.79100225694 | 14.33 |
| 41303.95766898148 | 14.27 |
| 41304.124335706016 | 14.33 |
| 41304.29100243055 | 14.33 |
| 41304.45766915509 | 14.27 |
| 41304.62433587963 | 14.27 |
| 41304.791002604165 | 14.27 |
| 41304.9576693287 | 14.27 |
| 41305.12433605324 | 14.27 |
| 41305.291002777776 | 14.27 |
| 41305.45766950231 | 14.27 |
| 41305.62433622685 | 14.27 |
| 41305.79100295139 | 14.21 |
| 41305.957669675925 | 14.14 |
| 41306.12433640046 | 14.14 |
| 41306.291003125 | 14.14 |
| 41306.45766984954 | 14.21 |
| 41306.624336574074 | 14.21 |
| 41306.79100329861 | 14.14 |
| 41306.95767002315 | 14.14 |
| 41307.124336747685 | 14.14 |
| 41307.29100347222 | 14.14 |
| 41307.45767019676 | 14.21 |
| 41307.6243369213 | 14.21 |
| 41307.791003645834 | 14.21 |
| 41307.95767037037 | 14.14 |
| 41308.12433709491 | 14.14 |
| 41308.291003819446 | 14.21 |
| 41308.45767054398 | 14.21 |
| 41308.62433726852 | 14.27 |
| 41308.79100399306 | 14.14 |
| 41308.957670717595 | 14.21 |
| 41309.12433744213 | 14.21 |
| 41309.29100416667 | 14.21 |
| 41309.45767089121 | 14.21 |
| 41309.62433761574 | 14.27 |
| 41309.79100434028 | 14.21 |
| 41309.95767106482 | 14.14 |
| 41310.124337789355 | 14.14 |
| 41310.29100451389 | 14.14 |
| 41310.45767123842 | 14.21 |
| 41310.62433796296 | 14.27 |
| 41310.7910046875 | 14.14 |
| 41310.957671412034 | 14.14 |
| 41311.12433813657 | 14.14 |
| 41311.29100486111 | 14.14 |
| 41311.457671585646 | 14.21 |
| 41311.62433831018 | 14.21 |
| 41311.79100503472 | 14.14 |
| 41311.95767175926 | 14.14 |
| 41312.124338483794 | 14.14 |
| 41312.29100520833 | 14.14 |
| 41312.45767193287 | 14.21 |
| 41312.624338657406 | 14.21 |
| 41312.79100538194 | 14.21 |
| 41312.95767210648 | 14.21 |
| 41313.12433883102 | 14.14 |
| 41313.291005555555 | 14.14 |
| 41313.45767228009 | 14.21 |
| 41313.62433900463 | 14.21 |
| 41313.79100572917 | 14.14 |
| 41313.957672453704 | 14.14 |
| 41314.12433917824 | 14.14 |
| 41314.29100590278 | 14.14 |
| 41314.457672627315 | 14.21 |
| 41314.62433935185 | 14.21 |
| 41314.79100607639 | 14.14 |
| 41314.95767280093 | 14.14 |
| 41315.124339525464 | 14.21 |
| 41315.29100625 | 14.14 |
| 41315.45767297454 | 14.21 |
| 41315.624339699076 | 14.27 |
| 41315.79100642361 | 14.21 |
| 41315.95767314815 | 14.21 |
| 41316.12433987269 | 14.14 |
| 41316.291006597225 | 14.14 |
| 41316.45767332176 | 14.21 |
| 41316.6243400463 | 14.21 |
| 41316.791006770836 | 14.21 |
| 41316.95767349537 | 14.14 |
| 41317.12434021991 | 14.14 |
| 41317.29100694445 | 14.14 |
| 41317.457673668985 | 14.21 |
| 41317.624340393515 | 14.21 |
| 41317.79100711805 | 14.14 |
| 41317.95767384259 | 14.14 |
| 41318.12434056713 | 14.14 |
| 41318.291007291664 | 14.14 |
| 41318.4576740162 | 14.21 |
| 41318.62434074074 | 14.21 |
| 41318.791007465275 | 14.14 |
| 41318.95767418981 | 14.14 |
| 41319.12434091435 | 14.14 |
| 41319.29100763889 | 14.08 |
| 41319.457674363424 | 14.21 |
| 41319.62434108796 | 14.21 |
| 41319.7910078125 | 14.14 |
| 41319.957674537036 | 14.14 |
| 41320.12434126157 | 14.14 |
| 41320.29100798611 | 14.08 |
| 41320.45767471065 | 14.14 |
| 41320.624341435185 | 14.21 |
| 41320.79100815972 | 14.08 |
| 41320.95767488426 | 14.08 |
| 41321.1243416088 | 14.08 |
| 41321.29100833333 | 14.08 |
| 41321.45767505787 | 14.14 |
| 41321.62434178241 | 14.21 |
| 41321.791008506945 | 14.08 |
| 41321.95767523148 | 14.08 |
| 41322.12434195602 | 14.08 |
| 41322.29100868056 | 14.08 |
| 41322.457675405094 | 14.14 |
| 41322.62434212963 | 14.21 |
| 41322.79100885417 | 14.14 |
| 41322.957675578706 | 14.08 |
| 41323.12434230324 | 14.08 |
| 41323.29100902778 | 14.08 |
| 41323.45767575232 | 14.14 |
| 41323.624342476855 | 14.14 |
| 41323.79100920139 | 14.14 |
| 41323.95767592593 | 14.08 |
| 41324.124342650466 | 14.08 |
| 41324.291009375 | 14.08 |
| 41324.45767609954 | 14.14 |
| 41324.62434282407 | 14.14 |
| 41324.79100954861 | 14.08 |
| 41324.957676273145 | 14.08 |
| 41325.12434299768 | 14.08 |
| 41325.29100972222 | 14.08 |
| 41325.45767644676 | 14.08 |
| 41325.624343171294 | 14.14 |
| 41325.79100989583 | 14.08 |
| 41325.95767662037 | 14.08 |
| 41326.124343344905 | 14.08 |
| 41326.29101006944 | 14.08 |
| 41326.45767679398 | 14.08 |
| 41326.62434351852 | 13.96 |
| 41326.791010243054 | 14.08 |
| 41326.95767696759 | 14.08 |
| 41327.12434369213 | 14.08 |
| 41327.291010416666 | 14.08 |
| 41327.4576771412 | 14.14 |
| 41327.62434386574 | 14.14 |
| 41327.79101059028 | 14.08 |
| 41327.957677314815 | 14.08 |
| 41328.12434403935 | 14.08 |
| 41328.29101076389 | 14.08 |
| 41328.457677488426 | 14.14 |
| 41328.62434421296 | 14.21 |
| 41328.7910109375 | 14.08 |
| 41328.95767766204 | 14.08 |
| 41329.124344386575 | 14.08 |
| 41329.29101111111 | 14.08 |
| 41329.45767783565 | 14.21 |
| 41329.62434456019 | 14.21 |
| 41329.791011284724 | 14.14 |
| 41329.95767800926 | 14.14 |
| 41330.1243447338 | 14.14 |
| 41330.291011458336 | 14.14 |
| 41330.45767818287 | 14.21 |
| 41330.62434490741 | 14.21 |
| 41330.79101163195 | 14.14 |
| 41330.957678356484 | 14.14 |
| 41331.12434508102 | 14.14 |
| 41331.29101180556 | 14.14 |
| 41331.457678530096 | 14.14 |
| 41331.62434525463 | 14.14 |
| 41331.79101197916 | 14.14 |
| 41331.9576787037 | 14.02 |
| 41332.12434542824 | 13.96 |
| 41332.291012152775 | 13.96 |
| 41332.45767887731 | 13.89 |
| 41332.62434560185 | 13.89 |
| 41332.79101232639 | 13.89 |
| 41332.95767905092 | 13.89 |
| 41333.12434577546 | 13.89 |
| 41333.2910125 | 13.89 |
| 41333.457679224535 | 13.83 |
| 41333.62434594907 | 13.83 |
| 41333.79101267361 | 13.77 |
| 41333.95767939815 | 13.7 |
| 41334.124346122684 | 13.64 |
| 41334.29101284722 | 13.64 |
| 41334.45767957176 | 13.58 |
| 41334.624346296296 | 13.51 |
| 41334.79101302083 | 13.51 |
| 41334.95767974537 | 13.45 |
| 41335.12434646991 | 13.45 |
| 41335.291013194445 | 13.39 |
| 41335.45767991898 | 13.45 |
| 41335.62434664352 | 13.45 |
| 41335.791013368056 | 13.45 |
| 41335.95768009259 | 13.45 |
| 41336.12434681713 | 13.45 |
| 41336.29101354167 | 13.45 |
| 41336.457680266205 | 13.51 |
| 41336.62434699074 | 13.51 |
| 41336.79101371528 | 13.51 |
| 41336.95768043982 | 13.58 |
| 41337.124347164354 | 13.58 |
| 41337.29101388889 | 13.58 |
| 41337.45768061343 | 13.64 |
| 41337.624347337965 | 13.64 |
| 41337.7910140625 | 13.64 |
| 41337.95768078704 | 13.64 |
| 41338.12434751158 | 13.64 |
| 41338.291014236114 | 13.64 |
| 41338.45768096065 | 13.64 |
| 41338.62434768519 | 13.7 |
| 41338.79101440972 | 13.64 |
| 41338.957681134256 | 13.64 |
| 41339.12434785879 | 13.64 |
| 41339.29101458333 | 13.64 |
| 41339.45768130787 | 13.7 |
| 41339.624348032405 | 13.77 |
| 41339.79101475694 | 13.7 |
| 41339.95768148148 | 13.7 |
| 41340.124348206016 | 13.7 |
| 41340.29101493055 | 13.7 |
| 41340.45768165509 | 13.77 |
| 41340.62434837963 | 13.77 |
| 41340.791015104165 | 13.7 |
| 41340.9576818287 | 13.7 |
| 41341.12434855324 | 13.7 |
| 41341.29101527778 | 13.7 |
| 41341.457682002314 | 13.77 |
| 41341.62434872685 | 13.83 |
| 41341.79101545139 | 13.77 |
| 41341.957682175926 | 13.7 |
| 41342.12434890046 | 13.7 |
| 41342.291015625 | 13.77 |
| 41342.45768234954 | 13.83 |
| 41342.624349074074 | 13.83 |
| 41342.79101579861 | 13.77 |
| 41342.95768252315 | 13.77 |
| 41343.16601851852 | 13.77 |
| 41343.33268518518 | 13.77 |
| 41343.49935185185 | 13.77 |
| 41343.66601851852 | 13.77 |
| 41343.83268518518 | 13.77 |
| 41343.99935185185 | 13.77 |
| 41344.16601846065 | 13.77 |
| 41344.332685127316 | 13.77 |
| 41344.49935179398 | 13.77 |
| 41344.66601846065 | 13.77 |
| 41344.832685127316 | 13.7 |
| 41344.99935179398 | 13.7 |
| 41345.16601846065 | 13.7 |
| 41345.332685127316 | 13.7 |
| 41345.49935179398 | 13.7 |
| 41345.66601846065 | 13.7 |
| 41345.832685127316 | 13.64 |
| 41345.99935179398 | 13.64 |
| 41346.16601846065 | 13.64 |
| 41346.332685127316 | 13.58 |
| 41346.49935179398 | 13.64 |
| 41346.66601846065 | 13.58 |
| 41346.832685127316 | 13.45 |
| 41346.99935179398 | 13.45 |
| 41347.16601846065 | 13.39 |
| 41347.332685127316 | 13.32 |
| 41347.49935179398 | 13.39 |
| 41347.66601846065 | 13.39 |
| 41347.832685127316 | 13.32 |
| 41347.99935179398 | 13.32 |
| 41348.16601846065 | 13.26 |
| 41348.332685127316 | 13.32 |
| 41348.49935179398 | 13.39 |
| 41348.66601846065 | 13.39 |
| 41348.832685127316 | 13.39 |
| 41348.99935179398 | 13.39 |
| 41349.16601846065 | 13.39 |
| 41349.332685127316 | 13.39 |
| 41349.49935179398 | 13.45 |
| 41349.66601846065 | 13.45 |
| 41349.832685127316 | 13.45 |
| 41349.99935179398 | 13.45 |
| 41350.16601846065 | 13.45 |
| 41350.332685127316 | 13.45 |
| 41350.49935179398 | 13.45 |
| 41350.66601846065 | 13.51 |
| 41350.832685127316 | 13.45 |
| 41350.99935179398 | 13.51 |
| 41351.16601846065 | 13.51 |
| 41351.332685127316 | 13.51 |
| 41351.49935179398 | 13.58 |
| 41351.66601846065 | 13.58 |
| 41351.832685127316 | 13.58 |
| 41351.99935179398 | 13.51 |
| 41352.16601846065 | 13.45 |
| 41352.332685127316 | 13.45 |
| 41352.49935179398 | 13.51 |
| 41352.66601846065 | 13.51 |
| 41352.832685127316 | 13.45 |
| 41352.99935179398 | 13.45 |
| 41353.16601846065 | 13.45 |
| 41353.332685127316 | 13.45 |
| 41353.49935179398 | 13.51 |
| 41353.66601846065 | 13.51 |
| 41353.832685127316 | 13.45 |
| 41353.99935179398 | 13.45 |
| 41354.16601846065 | 13.45 |
| 41354.332685127316 | 13.45 |
| 41354.49935179398 | 13.45 |
| 41354.66601846065 | 13.39 |
| 41354.832685127316 | 13.32 |
| 41354.99935179398 | 13.32 |
| 41355.16601846065 | 13.32 |
| 41355.332685127316 | 13.32 |
| 41355.49935179398 | 13.32 |
| 41355.66601846065 | 13.32 |
| 41355.832685127316 | 13.32 |
| 41355.99935179398 | 13.32 |
| 41356.16601846065 | 13.32 |
| 41356.332685127316 | 13.32 |
| 41356.49935179398 | 13.32 |
| 41356.66601846065 | 13.32 |
| 41356.832685127316 | 13.32 |
| 41356.99935179398 | 13.39 |
| 41357.16601846065 | 13.39 |
| 41357.332685127316 | 13.39 |
| 41357.49935179398 | 13.39 |
| 41357.66601846065 | 13.39 |
| 41357.832685127316 | 13.39 |
| 41357.99935179398 | 13.39 |
| 41358.16601846065 | 13.39 |
| 41358.332685127316 | 13.39 |
| 41358.49935179398 | 13.45 |
| 41358.66601846065 | 13.45 |
| 41358.832685127316 | 13.45 |
| 41358.99935179398 | 13.45 |
| 41359.16601846065 | 13.45 |
| 41359.332685127316 | 13.45 |
| 41359.49935179398 | 13.51 |
| 41359.66601846065 | 13.51 |
| 41359.832685127316 | 13.45 |
| 41359.99935179398 | 13.45 |
| 41360.16601846065 | 13.45 |
| 41360.332685127316 | 13.45 |
| 41360.49935179398 | 13.58 |
| 41360.66601846065 | 13.51 |
| 41360.832685127316 | 13.45 |
| 41360.99935179398 | 13.45 |
| 41361.16601846065 | 13.45 |
| 41361.332685127316 | 13.51 |
| 41361.49935179398 | 13.51 |
| 41361.66601846065 | 13.58 |
| 41361.832685127316 | 13.51 |
| 41361.99935179398 | 13.51 |
| 41362.16601846065 | 13.51 |
| 41362.332685127316 | 13.51 |
| 41362.49935179398 | 13.58 |
| 41362.66601846065 | 13.58 |
| 41362.832685127316 | 13.51 |
| 41362.99935179398 | 13.51 |
| 41363.16601846065 | 13.51 |
| 41363.332685127316 | 13.51 |
| 41363.49935179398 | 13.58 |
| 41363.66601846065 | 13.51 |
| 41363.832685127316 | 13.51 |
| 41363.99935179398 | 13.51 |
| 41364.16601846065 | 13.51 |
| 41364.332685127316 | 13.51 |
| 41364.49935179398 | 13.64 |
| 41364.66601846065 | 13.64 |
| 41364.832685127316 | 13.51 |
| 41364.99935179398 | 13.51 |
| 41365.16601846065 | 13.51 |
| 41365.332685127316 | 13.51 |
| 41365.49935179398 | 13.64 |
| 41365.66601846065 | 13.58 |
| 41365.832685127316 | 13.51 |
| 41365.99935179398 | 13.51 |
| 41366.16601846065 | 13.51 |
| 41366.332685127316 | 13.51 |
| 41366.49935179398 | 13.58 |
| 41366.66601846065 | 13.58 |
| 41366.832685127316 | 13.58 |
| 41366.99935179398 | 13.51 |
| 41367.16601846065 | 13.51 |
| 41367.332685127316 | 13.51 |
| 41367.49935179398 | 13.64 |
| 41367.66601846065 | 13.64 |
| 41367.832685127316 | 13.58 |
| 41367.99935179398 | 13.51 |
| 41368.16601846065 | 13.51 |
| 41368.332685127316 | 13.51 |
| 41368.49935179398 | 13.64 |
| 41368.66601846065 | 13.64 |
| 41368.832685127316 | 13.58 |
| 41368.99935179398 | 13.58 |
| 41369.16601846065 | 13.51 |
| 41369.332685127316 | 13.58 |
| 41369.49935179398 | 13.7 |
| 41369.66601846065 | 13.7 |
| 41369.832685127316 | 13.58 |
| 41369.99935179398 | 13.58 |
| 41370.16601846065 | 13.58 |
| 41370.332685127316 | 13.58 |
| 41370.49935179398 | 13.64 |
| 41370.66601846065 | 13.7 |
| 41370.832685127316 | 13.58 |
| 41370.99935179398 | 13.58 |
| 41371.16601846065 | 13.58 |
| 41371.332685127316 | 13.58 |
| 41371.49935179398 | 13.7 |
| 41371.66601846065 | 13.7 |
| 41371.832685127316 | 13.64 |
| 41371.99935179398 | 13.64 |
| 41372.16601846065 | 13.64 |
| 41372.332685127316 | 13.64 |
| 41372.49935179398 | 13.7 |
| 41372.66601846065 | 13.7 |
| 41372.832685127316 | 13.64 |
| 41372.99935179398 | 13.64 |
| 41373.16601846065 | 13.64 |
| 41373.332685127316 | 13.64 |
| 41373.49935179398 | 13.64 |
| 41373.66601846065 | 13.7 |
| 41373.832685127316 | 13.64 |
| 41373.99935179398 | 13.64 |
| 41374.16601846065 | 13.64 |
| 41374.332685127316 | 13.64 |
| 41374.49935179398 | 13.7 |
| 41374.66601846065 | 13.77 |
| 41374.832685127316 | 13.64 |
| 41374.99935179398 | 13.64 |
| 41375.16601846065 | 13.64 |
| 41375.332685127316 | 13.64 |
| 41375.49935179398 | 13.64 |
| 41375.66601846065 | 13.7 |
| 41375.832685127316 | 13.64 |
| 41375.99935179398 | 13.64 |
| 41376.16601846065 | 13.64 |
| 41376.332685127316 | 13.64 |
| 41376.49935179398 | 13.77 |
| 41376.66601846065 | 13.7 |
| 41376.832685127316 | 13.64 |
| 41376.99935179398 | 13.64 |
| 41377.16601846065 | 13.58 |
| 41377.332685127316 | 13.58 |
| 41377.49935179398 | 13.7 |
| 41377.66601846065 | 13.77 |
| 41377.832685127316 | 13.64 |
| 41377.99935179398 | 13.64 |
| 41378.16601846065 | 13.64 |
| 41378.332685127316 | 13.64 |
| 41378.49935179398 | 13.77 |
| 41378.66601846065 | 13.77 |
| 41378.832685127316 | 13.64 |
| 41378.99935179398 | 13.64 |
| 41379.16601846065 | 13.64 |
| 41379.332685127316 | 13.64 |
| 41379.49935179398 | 13.7 |
| 41379.66601846065 | 13.77 |
| 41379.832685127316 | 13.7 |
| 41379.99935179398 | 13.7 |
| 41380.16601846065 | 13.7 |
| 41380.332685127316 | 13.7 |
| 41380.49935179398 | 13.77 |
| 41380.66601846065 | 13.77 |
| 41380.832685127316 | 13.7 |
| 41380.99935179398 | 13.7 |
| 41381.16601846065 | 13.7 |
| 41381.332685127316 | 13.7 |
| 41381.49935179398 | 13.83 |
| 41381.66601846065 | 13.83 |
| 41381.832685127316 | 13.7 |
| 41381.99935179398 | 13.7 |
| 41382.16601846065 | 13.77 |
| 41382.332685127316 | 13.77 |
| 41382.49935179398 | 13.7 |
| 41382.66601846065 | 13.7 |
| 41382.832685127316 | 13.7 |
| 41382.99935179398 | 13.7 |
| 41383.16601846065 | 13.7 |
| 41383.332685127316 | 13.7 |
| 41383.49935179398 | 13.77 |
| 41383.66601846065 | 13.77 |
| 41383.832685127316 | 13.7 |
| 41383.99935179398 | 13.7 |
| 41384.16601846065 | 13.7 |
| 41384.332685127316 | 13.7 |
| 41384.49935179398 | 13.77 |
| 41384.66601846065 | 13.77 |
| 41384.832685127316 | 13.7 |
| 41384.99935179398 | 13.7 |
| 41385.16601846065 | 13.7 |
| 41385.332685127316 | 13.7 |
| 41385.49935179398 | 13.77 |
| 41385.66601846065 | 13.77 |
| 41385.832685127316 | 13.7 |
| 41385.99935179398 | 13.7 |
| 41386.16601846065 | 13.7 |
| 41386.332685127316 | 13.7 |
| 41386.49935179398 | 13.77 |
| 41386.66601846065 | 13.77 |
| 41386.832685127316 | 13.7 |
| 41386.99935179398 | 13.64 |
| 41387.16601846065 | 13.64 |
| 41387.332685127316 | 13.64 |
| 41387.49935179398 | 13.64 |
| 41387.66601846065 | 13.64 |
| 41387.832685127316 | 13.58 |
| 41387.99935179398 | 13.58 |
| 41388.16601846065 | 13.58 |
| 41388.332685127316 | 13.58 |
| 41388.49935179398 | 13.64 |
| 41388.66601846065 | 13.64 |
| 41388.832685127316 | 13.58 |
| 41388.99935179398 | 13.58 |
| 41389.16601846065 | 13.58 |
| 41389.332685127316 | 13.58 |
| 41389.49935179398 | 13.7 |
| 41389.66601846065 | 13.7 |
| 41389.832685127316 | 13.64 |
| 41389.99935179398 | 13.64 |
| 41390.16601846065 | 13.64 |
| 41390.332685127316 | 13.64 |
| 41390.49935179398 | 13.64 |
| 41390.66601846065 | 13.7 |
| 41390.832685127316 | 13.7 |
| 41390.99935179398 | 13.7 |
| 41391.16601846065 | 13.7 |
| 41391.332685127316 | 13.7 |
| 41391.49935179398 | 13.7 |
| 41391.66601846065 | 13.7 |
| 41391.832685127316 | 13.64 |
| 41391.99935179398 | 13.58 |
| 41392.16601846065 | 13.58 |
| 41392.332685127316 | 13.51 |
| 41392.49935179398 | 13.51 |
| 41392.66601846065 | 13.51 |
| 41392.832685127316 | 13.45 |
| 41392.99935179398 | 13.45 |
| 41393.16601846065 | 13.39 |
| 41393.332685127316 | 13.39 |
| 41393.49935179398 | 13.39 |
| 41393.66601846065 | 13.32 |
| 41393.832685127316 | 13.32 |
| 41393.99935179398 | 13.26 |
| 41394.16601846065 | 13.26 |
| 41394.332685127316 | 13.26 |
| 41394.49935179398 | 13.26 |
| 41394.66601846065 | 13.26 |
| 41394.832685127316 | 13.26 |
| 41394.99935179398 | 13.26 |
| 41395.16601846065 | 13.26 |
| 41395.332685127316 | 13.26 |
| 41395.49935179398 | 13.32 |
| 41395.66601846065 | 13.32 |
| 41395.832685127316 | 13.26 |
| 41395.99935179398 | 13.26 |
| 41396.16601846065 | 13.32 |
| 41396.332685127316 | 13.32 |
| 41396.49935179398 | 13.51 |
| 41396.66601846065 | 13.39 |
| 41396.832685127316 | 13.32 |
| 41396.99935179398 | 13.32 |
| 41397.16601846065 | 13.32 |
| 41397.332685127316 | 13.32 |
| 41397.49935179398 | 13.39 |
| 41397.66601846065 | 13.39 |
| 41397.832685127316 | 13.39 |
| 41397.99935179398 | 13.39 |
| 41398.16601846065 | 13.39 |
| 41398.332685127316 | 13.45 |
| 41398.49935179398 | 13.51 |
| 41398.66601846065 | 13.39 |
| 41398.832685127316 | 13.39 |
| 41398.99935179398 | 13.32 |
| 41399.16601846065 | 13.32 |
| 41399.332685127316 | 13.39 |
| 41399.49935179398 | 13.39 |
| 41399.66601846065 | 13.39 |
| 41399.832685127316 | 13.32 |
| 41399.99935179398 | 13.32 |
| 41400.16601846065 | 13.32 |
| 41400.332685127316 | 13.32 |
| 41400.49935179398 | 13.39 |
| 41400.66601846065 | 13.39 |
| 41400.832685127316 | 13.26 |
| 41400.99935179398 | 13.26 |
| 41401.16601846065 | 13.26 |
| 41401.332685127316 | 13.26 |
| 41401.49935179398 | 13.39 |
| 41401.66601846065 | 13.32 |
| 41401.832685127316 | 13.26 |
| 41401.99935179398 | 13.26 |
| 41402.16601846065 | 13.26 |
| 41402.332685127316 | 13.32 |
| 41402.49935179398 | 13.45 |
| 41402.66601846065 | 13.32 |
| 41402.832685127316 | 13.32 |
| 41402.99935179398 | 13.32 |
| 41403.16601846065 | 13.32 |
| 41403.332685127316 | 13.32 |
| 41403.49935179398 | 13.45 |
| 41403.66601846065 | 13.45 |
| 41403.832685127316 | 13.39 |
| 41403.99935179398 | 13.39 |
| 41404.16601846065 | 13.39 |
| 41404.332685127316 | 13.39 |
| 41404.49935179398 | 13.45 |
| 41404.66601846065 | 13.51 |
| 41404.832685127316 | 13.39 |
| 41404.99935179398 | 13.39 |
| 41405.16601846065 | 13.39 |
| 41405.332685127316 | 13.39 |
| 41405.49935179398 | 13.51 |
| 41405.66601846065 | 13.64 |
| 41405.832685127316 | 13.39 |
| 41405.99935179398 | 13.39 |
| 41406.16601846065 | 13.39 |
| 41406.332685127316 | 13.39 |
| 41406.49935179398 | 13.51 |
| 41406.66601846065 | 13.64 |
| 41406.832685127316 | 13.45 |
| 41406.99935179398 | 13.39 |
| 41407.16601846065 | 13.39 |
| 41407.332685127316 | 13.45 |
| 41407.49935179398 | 13.58 |
| 41407.66601846065 | 13.64 |
| 41407.832685127316 | 13.45 |
| 41407.99935179398 | 13.45 |
| 41408.16601846065 | 13.45 |
| 41408.332685127316 | 13.45 |
| 41408.49935179398 | 13.58 |
| 41408.66601846065 | 13.64 |
| 41408.832685127316 | 13.45 |
| 41408.99935179398 | 13.45 |
| 41409.16601846065 | 13.45 |
| 41409.332685127316 | 13.51 |
| 41409.49935179398 | 13.58 |
| 41409.66601846065 | 13.64 |
| 41409.832685127316 | 13.51 |
| 41409.99935179398 | 13.51 |
| 41410.16601846065 | 13.51 |
| 41410.332685127316 | 13.51 |
| 41410.49935179398 | 13.58 |
| 41410.66601846065 | 13.58 |
| 41410.832685127316 | 13.51 |
| 41410.99935179398 | 13.51 |
| 41411.16601846065 | 13.51 |
| 41411.332685127316 | 13.51 |
| 41411.49935179398 | 13.58 |
| 41411.66601846065 | 13.58 |
| 41411.832685127316 | 13.58 |
| 41411.99935179398 | 13.58 |
| 41412.16601846065 | 13.58 |
| 41412.332685127316 | 13.58 |
| 41412.49935179398 | 13.64 |
| 41412.66601846065 | 13.64 |
| 41412.832685127316 | 13.58 |
| 41412.99935179398 | 13.58 |
| 41413.16601846065 | 13.58 |
| 41413.332685127316 | 13.58 |
| 41413.49935179398 | 13.7 |
| 41413.66601846065 | 13.77 |
| 41413.832685127316 | 13.64 |
| 41413.99935179398 | 13.58 |
| 41414.16601846065 | 13.58 |
| 41414.332685127316 | 13.58 |
| 41414.49935179398 | 13.64 |
| 41414.66601846065 | 13.64 |
| 41414.832685127316 | 13.64 |
| 41414.99935179398 | 13.64 |
| 41415.16601846065 | 13.58 |
| 41415.332685127316 | 13.64 |
| 41415.49935179398 | 13.64 |
| 41415.66601846065 | 13.64 |
| 41415.832685127316 | 13.64 |
| 41415.99935179398 | 13.64 |
| 41416.16601846065 | 13.64 |
| 41416.332685127316 | 13.64 |
| 41416.49935179398 | 13.77 |
| 41416.66601846065 | 13.77 |
| 41416.832685127316 | 13.64 |
| 41416.99935179398 | 13.64 |
| 41417.16601846065 | 13.64 |
| 41417.332685127316 | 13.64 |
| 41417.49935179398 | 13.77 |
| 41417.66601846065 | 13.83 |
| 41417.832685127316 | 13.64 |
| 41417.99935179398 | 13.64 |
| 41418.16601846065 | 13.64 |
| 41418.332685127316 | 13.64 |
| 41418.49935179398 | 13.77 |
| 41418.66601846065 | 13.83 |
| 41418.832685127316 | 13.64 |
| 41418.99935179398 | 13.64 |
| 41419.16601846065 | 13.64 |
| 41419.332685127316 | 13.64 |
| 41419.49935179398 | 13.77 |
| 41419.66601846065 | 13.77 |
| 41419.832685127316 | 13.7 |
| 41419.99935179398 | 13.64 |
| 41420.16601846065 | 13.64 |
| 41420.332685127316 | 13.7 |
| 41420.49935179398 | 13.83 |
| 41420.66601846065 | 13.83 |
| 41420.832685127316 | 13.7 |
| 41420.99935179398 | 13.7 |
| 41421.16601846065 | 13.7 |
| 41421.332685127316 | 13.7 |
| 41421.49935179398 | 13.83 |
| 41421.66601846065 | 13.77 |
| 41421.832685127316 | 13.7 |
| 41421.99935179398 | 13.7 |
| 41422.16601846065 | 13.7 |
| 41422.332685127316 | 13.7 |
| 41422.49935179398 | 13.83 |
| 41422.66601846065 | 13.83 |
| 41422.832685127316 | 13.7 |
| 41422.99935179398 | 13.7 |
| 41423.16601846065 | 13.7 |
| 41423.332685127316 | 13.7 |
| 41423.49935179398 | 13.83 |
| 41423.66601846065 | 13.89 |
| 41423.832685127316 | 13.7 |
| 41423.99935179398 | 13.77 |
| 41424.16601846065 | 13.77 |
| 41424.332685127316 | 13.77 |
| 41424.49935179398 | 13.83 |
| 41424.66601846065 | 13.77 |
| 41424.832685127316 | 13.77 |
| 41424.99935179398 | 13.77 |
| 41425.16601846065 | 13.77 |
| 41425.332685127316 | 13.77 |
| 41425.49935179398 | 13.77 |
| 41425.66601846065 | 13.77 |
| 41425.832685127316 | 13.77 |
| 41425.99935179398 | 13.77 |
| 41426.16601846065 | 13.77 |
| 41426.332685127316 | 13.77 |
| 41426.49935179398 | 13.77 |
| 41426.66601846065 | 13.77 |
| 41426.832685127316 | 13.77 |
| 41426.99935179398 | 13.7 |
| 41427.16601846065 | 13.64 |
| 41427.332685127316 | 13.64 |
| 41427.49935179398 | 13.64 |
| 41427.66601846065 | 13.58 |
| 41427.832685127316 | 13.58 |
| 41427.99935179398 | 13.58 |
| 41428.16601846065 | 13.64 |
| 41428.332685127316 | 13.64 |
| 41428.49935179398 | 13.7 |
| 41428.66601846065 | 13.77 |
| 41428.832685127316 | 13.7 |
| 41428.99935179398 | 13.7 |
| 41429.16601846065 | 13.7 |
| 41429.332685127316 | 13.7 |
| 41429.49935179398 | 13.77 |
| 41429.66601846065 | 13.77 |
| 41429.832685127316 | 13.7 |
| 41429.99935179398 | 13.7 |
| 41430.16601846065 | 13.7 |
| 41430.332685127316 | 13.7 |
| 41430.49935179398 | 13.77 |
| 41430.66601846065 | 13.77 |
| 41430.832685127316 | 13.7 |
| 41430.99935179398 | 13.7 |
| 41431.16601846065 | 13.7 |
| 41431.332685127316 | 13.77 |
| 41431.49935179398 | 13.77 |
| 41431.66601846065 | 13.83 |
| 41431.832685127316 | 13.7 |
| 41431.99935179398 | 13.7 |
| 41432.16601846065 | 13.7 |
| 41432.332685127316 | 13.7 |
| 41432.49935179398 | 13.77 |
| 41432.66601846065 | 13.77 |
| 41432.832685127316 | 13.7 |
| 41432.99935179398 | 13.7 |
| 41433.16601846065 | 13.7 |
| 41433.332685127316 | 13.7 |
| 41433.49935179398 | 13.77 |
| 41433.66601846065 | 13.83 |
| 41433.832685127316 | 13.7 |
| 41433.99935179398 | 13.7 |
| 41434.16601846065 | 13.7 |
| 41434.332685127316 | 13.7 |
| 41434.49935179398 | 13.77 |
| 41434.66601846065 | 13.83 |
| 41434.832685127316 | 13.7 |
| 41434.99935179398 | 13.7 |
| 41435.16601846065 | 13.7 |
| 41435.332685127316 | 13.7 |
| 41435.49935179398 | 13.77 |
| 41435.66601846065 | 13.89 |
| 41435.832685127316 | 13.7 |
| 41435.99935179398 | 13.7 |
| 41436.16601846065 | 13.7 |
| 41436.332685127316 | 13.7 |
| 41436.49935179398 | 13.83 |
| 41436.66601846065 | 13.77 |
| 41436.832685127316 | 13.77 |
| 41436.99935179398 | 13.7 |
| 41437.16601846065 | 13.7 |
| 41437.332685127316 | 13.7 |
| 41437.49935179398 | 13.83 |
| 41437.66601846065 | 13.83 |
| 41437.832685127316 | 13.77 |
| 41437.99935179398 | 13.77 |
| 41438.16601846065 | 13.77 |
| 41438.332685127316 | 13.77 |
| 41438.49935179398 | 13.83 |
| 41438.66601846065 | 13.89 |
| 41438.832685127316 | 13.77 |
| 41438.99935179398 | 13.77 |
| 41439.16601846065 | 13.77 |
| 41439.332685127316 | 13.77 |
| 41439.49935179398 | 13.83 |
| 41439.66601846065 | 13.83 |
| 41439.832685127316 | 13.77 |
| 41439.99935179398 | 13.77 |
| 41440.16601846065 | 13.77 |
| 41440.332685127316 | 13.77 |
| 41440.49935179398 | 13.83 |
| 41440.66601846065 | 13.83 |
| 41440.832685127316 | 13.77 |
| 41440.99935179398 | 13.77 |
| 41441.16601846065 | 13.77 |
| 41441.332685127316 | 13.77 |
| 41441.49935179398 | 13.89 |
| 41441.66601846065 | 13.89 |
| 41441.832685127316 | 13.77 |
| 41441.99935179398 | 13.77 |
| 41442.16601846065 | 13.77 |
| 41442.332685127316 | 13.83 |
| 41442.49935179398 | 13.83 |
| 41442.66601846065 | 13.83 |
| 41442.832685127316 | 13.77 |
| 41442.99935179398 | 13.77 |
| 41443.16601846065 | 13.77 |
| 41443.332685127316 | 13.77 |
| 41443.49935179398 | 13.83 |
| 41443.66601846065 | 13.89 |
| 41443.832685127316 | 13.83 |
| 41443.99935179398 | 13.77 |
| 41444.16601846065 | 13.77 |
| 41444.332685127316 | 13.77 |
| 41444.49935179398 | 13.89 |
| 41444.66601846065 | 13.89 |
| 41444.832685127316 | 13.83 |
| 41444.99935179398 | 13.77 |
| 41445.16601846065 | 13.83 |
| 41445.332685127316 | 13.83 |
| 41445.49935179398 | 13.89 |
| 41445.66601846065 | 13.89 |
| 41445.832685127316 | 13.83 |
| 41445.99935179398 | 13.83 |
| 41446.16601846065 | 13.83 |
| 41446.332685127316 | 13.83 |
| 41446.49935179398 | 13.96 |
| 41446.66601846065 | 13.96 |
| 41446.832685127316 | 13.83 |
| 41446.99935179398 | 13.83 |
| 41447.16601846065 | 13.83 |
| 41447.332685127316 | 13.83 |
| 41447.49935179398 | 13.89 |
| 41447.66601846065 | 13.89 |
| 41447.832685127316 | 13.83 |
| 41447.99935179398 | 13.83 |
| 41448.16601846065 | 13.83 |
| 41448.332685127316 | 13.83 |
| 41448.49935179398 | 13.96 |
| 41448.66601846065 | 13.96 |
| 41448.832685127316 | 13.83 |
| 41448.99935179398 | 13.83 |
| 41449.16601846065 | 13.83 |
| 41449.332685127316 | 13.83 |
| 41449.49935179398 | 13.96 |
| 41449.66601846065 | 13.96 |
| 41449.832685127316 | 13.83 |
| 41449.99935179398 | 13.83 |
| 41450.16601846065 | 13.83 |
| 41450.332685127316 | 13.83 |
| 41450.49935179398 | 13.96 |
| 41450.66601846065 | 13.96 |
| 41450.832685127316 | 13.89 |
| 41450.99935179398 | 13.83 |
| 41451.16601846065 | 13.83 |
| 41451.332685127316 | 13.89 |
| 41451.49935179398 | 13.96 |
| 41451.66601846065 | 13.96 |
| 41451.832685127316 | 13.89 |
| 41451.99935179398 | 13.83 |
| 41452.16601846065 | 13.83 |
| 41452.332685127316 | 13.83 |
| 41452.49935179398 | 13.96 |
| 41452.66601846065 | 13.96 |
| 41452.832685127316 | 13.89 |
| 41452.99935179398 | 13.89 |
| 41453.16601846065 | 13.89 |
| 41453.332685127316 | 13.89 |
| 41453.49935179398 | 13.96 |
| 41453.66601846065 | 14.02 |
| 41453.832685127316 | 13.89 |
| 41453.99935179398 | 13.89 |
| 41454.16601846065 | 13.83 |
| 41454.332685127316 | 13.89 |
| 41454.49935179398 | 13.96 |
| 41454.66601846065 | 14.02 |
| 41454.832685127316 | 13.89 |
| 41454.99935179398 | 13.89 |
| 41455.16601846065 | 13.89 |
| 41455.332685127316 | 13.89 |
| 41455.49935179398 | 13.96 |
| 41455.66601846065 | 14.02 |
| 41455.832685127316 | 13.89 |
| 41455.99935179398 | 13.89 |
| 41456.16601846065 | 13.89 |
| 41456.332685127316 | 13.89 |
| 41456.49935179398 | 13.96 |
| 41456.66601846065 | 13.96 |
| 41456.832685127316 | 13.89 |
| 41456.99935179398 | 13.89 |
| 41457.16601846065 | 13.89 |
| 41457.332685127316 | 13.89 |
| 41457.49935179398 | 13.96 |
| 41457.66601846065 | 14.02 |
| 41457.832685127316 | 13.89 |
| 41457.99935179398 | 13.89 |
| 41458.16601846065 | 13.89 |
| 41458.332685127316 | 13.89 |
| 41458.49935179398 | 14.02 |
| 41458.66601846065 | 14.02 |
| 41458.832685127316 | 13.89 |
| 41458.99935179398 | 13.89 |
| 41459.16601846065 | 13.89 |
| 41459.332685127316 | 13.89 |
| 41459.49935179398 | 14.02 |
| 41459.66601846065 | 14.02 |
| 41459.832685127316 | 13.89 |
| 41459.99935179398 | 13.89 |
| 41460.16601846065 | 13.89 |
| 41460.332685127316 | 13.89 |
| 41460.49935179398 | 14.02 |
| 41460.66601846065 | 14.08 |
| 41460.832685127316 | 13.96 |
| 41460.99935179398 | 13.89 |
| 41461.16601846065 | 13.89 |
| 41461.332685127316 | 13.96 |
| 41461.49935179398 | 14.02 |
| 41461.66601846065 | 13.96 |
| 41461.832685127316 | 13.96 |
| 41461.99935179398 | 13.89 |
| 41462.16601846065 | 13.89 |
| 41462.332685127316 | 13.96 |
| 41462.49935179398 | 14.02 |
| 41462.66601846065 | 14.08 |
| 41462.832685127316 | 13.96 |
| 41462.99935179398 | 13.89 |
| 41463.16601846065 | 13.89 |
| 41463.332685127316 | 13.96 |
| 41463.49935179398 | 14.08 |
| 41463.66601846065 | 14.08 |
| 41463.832685127316 | 13.96 |
| 41463.99935179398 | 13.96 |
| 41464.16601846065 | 13.96 |
| 41464.332685127316 | 13.96 |
| 41464.49935179398 | 14.02 |
| 41464.66601846065 | 14.08 |
| 41464.832685127316 | 13.96 |
| 41464.99935179398 | 13.96 |
| 41465.16601846065 | 13.96 |
| 41465.332685127316 | 13.96 |
| 41465.49935179398 | 14.02 |
| 41465.66601846065 | 14.02 |
| 41465.832685127316 | 13.96 |
| 41465.99935179398 | 13.96 |
| 41466.16601846065 | 13.96 |
| 41466.332685127316 | 13.96 |
| 41466.49935179398 | 14.08 |
| 41466.66601846065 | 14.08 |
| 41466.832685127316 | 13.96 |
| 41466.99935179398 | 13.96 |
| 41467.16601846065 | 13.96 |
| 41467.332685127316 | 13.96 |
| 41467.49935179398 | 14.08 |
| 41467.66601846065 | 14.08 |
| 41467.832685127316 | 13.96 |
| 41467.99935179398 | 13.96 |
| 41468.16601846065 | 13.96 |
| 41468.332685127316 | 13.96 |
| 41468.49935179398 | 14.08 |
| 41468.66601846065 | 14.08 |
| 41468.832685127316 | 13.96 |
| 41468.99935179398 | 13.96 |
| 41469.16601846065 | 13.96 |
| 41469.332685127316 | 13.96 |
| 41469.49935179398 | 14.08 |
| 41469.66601846065 | 14.08 |
| 41469.832685127316 | 13.96 |
| 41469.99935179398 | 13.96 |
| 41470.16601846065 | 13.96 |
| 41470.332685127316 | 14.02 |
| 41470.49935179398 | 14.08 |
| 41470.66601846065 | 14.14 |
| 41470.832685127316 | 13.96 |
| 41470.99935179398 | 13.96 |
| 41471.16601846065 | 13.96 |
| 41471.332685127316 | 13.96 |
| 41471.49935179398 | 14.08 |
| 41471.66601846065 | 14.14 |
| 41471.832685127316 | 14.02 |
| 41471.99935179398 | 13.96 |
| 41472.16601846065 | 13.96 |
| 41472.332685127316 | 13.96 |
| 41472.49935179398 | 14.08 |
| 41472.66601846065 | 14.08 |
| 41472.832685127316 | 14.02 |
| 41472.99935179398 | 13.96 |
| 41473.16601846065 | 13.96 |
| 41473.332685127316 | 14.02 |
| 41473.49935179398 | 14.08 |
| 41473.66601846065 | 14.08 |
| 41473.832685127316 | 14.02 |
| 41473.99935179398 | 13.96 |
| 41474.16601846065 | 13.96 |
| 41474.332685127316 | 14.02 |
| 41474.49935179398 | 14.08 |
| 41474.66601846065 | 14.02 |
| 41474.832685127316 | 14.02 |
| 41474.99935179398 | 14.02 |
| 41475.16601846065 | 14.02 |
| 41475.332685127316 | 14.02 |
| 41475.49935179398 | 14.08 |
| 41475.66601846065 | 14.02 |
| 41475.832685127316 | 14.02 |
| 41475.99935179398 | 14.02 |
| 41476.16601846065 | 14.02 |
| 41476.332685127316 | 14.02 |
| 41476.49935179398 | 14.08 |
| 41476.66601846065 | 14.02 |
| 41476.832685127316 | 14.02 |
| 41476.99935179398 | 14.02 |
| 41477.16601846065 | 14.02 |
| 41477.332685127316 | 14.02 |
| 41477.49935179398 | 14.08 |
| 41477.66601846065 | 14.08 |
| 41477.832685127316 | 14.02 |
| 41477.99935179398 | 14.02 |
| 41478.16601846065 | 14.02 |
| 41478.332685127316 | 14.02 |
| 41478.49935179398 | 14.14 |
| 41478.66601846065 | 14.08 |
| 41478.832685127316 | 14.02 |
| 41478.99935179398 | 14.02 |
| 41479.16601846065 | 14.02 |
| 41479.332685127316 | 14.02 |
| 41479.49935179398 | 14.08 |
| 41479.66601846065 | 14.14 |
| 41479.832685127316 | 14.02 |
| 41479.99935179398 | 14.02 |
| 41480.16601846065 | 14.02 |
| 41480.332685127316 | 14.02 |
| 41480.49935179398 | 14.14 |
| 41480.66601846065 | 14.14 |
| 41480.832685127316 | 14.02 |
| 41480.99935179398 | 14.02 |
| 41481.16601846065 | 14.02 |
| 41481.332685127316 | 14.02 |
| 41481.49935179398 | 14.08 |
| 41481.66601846065 | 14.02 |
| 41481.832685127316 | 14.02 |
| 41481.99935179398 | 14.02 |
| 41482.16601846065 | 14.02 |
| 41482.332685127316 | 14.02 |
| 41482.49935179398 | 14.14 |
| 41482.66601846065 | 14.14 |
| 41482.832685127316 | 14.02 |
| 41482.99935179398 | 14.02 |
| 41483.16601846065 | 14.02 |
| 41483.332685127316 | 14.02 |
| 41483.49935179398 | 14.08 |
| 41483.66601846065 | 14.08 |
| 41483.832685127316 | 14.02 |
| 41483.99935179398 | 14.02 |
| 41484.16601846065 | 14.02 |
| 41484.332685127316 | 14.02 |
| 41484.66601846065 | 14.14 |
| 41484.832685127316 | 14.02 |
| 41484.99935179398 | 14.02 |
| 41485.16601846065 | 14.02 |
| 41485.332685127316 | 14.08 |
| 41485.49935179398 | 14.08 |
| 41485.66601846065 | 14.14 |
| 41485.832685127316 | 14.08 |
| 41485.99935179398 | 14.08 |
| 41486.16601846065 | 14.02 |
| 41486.332685127316 | 14.08 |
| 41486.49935179398 | 14.14 |
| 41486.66601846065 | 14.21 |
| 41486.832685127316 | 14.08 |
| 41486.99935179398 | 14.02 |
| 41487.16601846065 | 14.02 |
| 41487.332685127316 | 14.08 |
| 41487.49935179398 | 14.14 |
| 41487.66601846065 | 14.21 |
| 41487.832685127316 | 14.08 |
| 41487.99935179398 | 14.08 |
| 41488.16601846065 | 14.08 |
| 41488.332685127316 | 14.08 |
| 41488.49935179398 | 14.14 |
| 41488.66601846065 | 14.14 |
| 41488.832685127316 | 14.08 |
| 41488.99935179398 | 14.08 |
| 41489.16601846065 | 14.08 |
| 41489.332685127316 | 14.08 |
| 41489.49935179398 | 14.14 |
| 41489.66601846065 | 14.21 |
| 41489.832685127316 | 14.08 |
| 41489.99935179398 | 14.08 |
| 41490.16601846065 | 14.08 |
| 41490.332685127316 | 14.08 |
| 41490.49935179398 | 14.14 |
| 41490.66601846065 | 14.08 |
| 41490.832685127316 | 14.08 |
| 41490.99935179398 | 14.08 |
| 41491.16601846065 | 14.08 |
| 41491.332685127316 | 14.08 |
| 41491.49935179398 | 14.08 |
| 41491.66601846065 | 14.14 |
| 41491.832685127316 | 14.08 |
| 41491.99935179398 | 14.08 |
| 41492.16601846065 | 14.08 |
| 41492.332685127316 | 14.08 |
| 41492.49935179398 | 14.08 |
| 41492.66601846065 | 14.08 |
| 41492.832685127316 | 14.02 |
| 41492.99935179398 | 14.02 |
| 41493.16601846065 | 14.02 |
| 41493.332685127316 | 14.08 |
| 41493.49935179398 | 14.08 |
| 41493.66601846065 | 14.08 |
| 41493.832685127316 | 14.02 |
| 41493.99935179398 | 14.02 |
| 41494.16601846065 | 14.02 |
| 41494.332685127316 | 14.02 |
| 41494.49935179398 | 14.08 |
| 41494.66601846065 | 14.08 |
| 41494.832685127316 | 14.08 |
| 41494.99935179398 | 14.14 |
| 41495.16601846065 | 14.21 |
| 41495.332685127316 | 14.33 |
| 41495.49935179398 | 14.4 |
| 41495.66601846065 | 14.46 |
| 41495.832685127316 | 14.46 |
| 41495.99935179398 | 14.59 |
| 41496.16601846065 | 14.52 |
| 41496.332685127316 | 14.52 |
| 41496.49935179398 | 14.52 |
| 41496.66601846065 | 14.46 |
| 41496.832685127316 | 14.46 |
| 41496.99935179398 | 14.46 |
| 41497.16601846065 | 14.4 |
| 41497.332685127316 | 14.4 |
| 41497.49935179398 | 14.46 |
| 41497.66601846065 | 14.52 |
| 41497.832685127316 | 14.46 |
| 41497.99935179398 | 14.52 |
| 41498.16601846065 | 14.52 |
| 41498.332685127316 | 14.59 |
| 41498.49935179398 | 14.59 |
| 41498.66601846065 | 14.65 |
| 41498.832685127316 | 14.59 |
| 41498.99935179398 | 14.59 |
| 41499.16601846065 | 14.59 |
| 41499.332685127316 | 14.52 |
| 41499.49935179398 | 14.59 |
| 41499.66601846065 | 14.59 |
| 41499.832685127316 | 14.52 |
| 41499.99935179398 | 14.46 |
| 41500.16601846065 | 14.46 |
| 41500.332685127316 | 14.46 |
| 41500.49935179398 | 14.46 |
| 41500.66601846065 | 14.46 |
| 41500.832685127316 | 14.46 |
| 41500.99935179398 | 14.4 |
| 41501.16601846065 | 14.4 |
| 41501.332685127316 | 14.4 |
| 41501.49935179398 | 14.46 |
| 41501.66601846065 | 14.46 |
| 41501.832685127316 | 14.4 |
| 41501.99935179398 | 14.4 |
| 41502.16601846065 | 14.4 |
| 41502.332685127316 | 14.4 |
| 41502.49935179398 | 14.4 |
| 41502.66601846065 | 14.46 |
| 41502.832685127316 | 14.33 |
| 41502.99935179398 | 14.33 |
| 41503.16601846065 | 14.33 |
| 41503.332685127316 | 14.33 |
| 41503.49935179398 | 14.4 |
| 41503.66601846065 | 14.4 |
| 41503.832685127316 | 14.33 |
| 41503.99935179398 | 14.33 |
| 41504.16601846065 | 14.33 |
| 41504.332685127316 | 14.33 |
| 41504.49935179398 | 14.4 |
| 41504.66601846065 | 14.33 |
| 41504.832685127316 | 14.27 |
| 41504.99935179398 | 14.27 |
| 41505.16601846065 | 14.27 |
| 41505.332685127316 | 14.27 |
| 41505.49935179398 | 14.33 |
| 41505.66601846065 | 14.33 |
| 41505.832685127316 | 14.27 |
| 41505.99935179398 | 14.27 |
| 41506.16601846065 | 14.27 |
| 41506.332685127316 | 14.27 |
| 41506.49935179398 | 14.33 |
| 41506.66601846065 | 14.33 |
| 41506.832685127316 | 14.27 |
| 41506.99935179398 | 14.27 |
| 41507.16601846065 | 14.27 |
| 41507.332685127316 | 14.27 |
| 41507.49935179398 | 14.33 |
| 41507.66601846065 | 14.33 |
| 41507.832685127316 | 14.27 |
| 41507.99935179398 | 14.27 |
| 41508.16601846065 | 14.27 |
| 41508.332685127316 | 14.27 |
| 41508.49935179398 | 14.33 |
| 41508.66601846065 | 14.33 |
| 41508.832685127316 | 14.27 |
| 41508.99935179398 | 14.27 |
| 41509.16601846065 | 14.27 |
| 41509.332685127316 | 14.27 |
| 41509.49935179398 | 14.33 |
| 41509.66601846065 | 14.33 |
| 41509.832685127316 | 14.27 |
| 41509.99935179398 | 14.27 |
| 41510.16601846065 | 14.27 |
| 41510.332685127316 | 14.27 |
| 41510.49935179398 | 14.33 |
| 41510.66601846065 | 14.33 |
| 41510.832685127316 | 14.27 |
| 41510.99935179398 | 14.27 |
| 41511.16601846065 | 14.21 |
| 41511.332685127316 | 14.27 |
| 41511.49935179398 | 14.33 |
| 41511.66601846065 | 14.27 |
| 41511.832685127316 | 14.27 |
| 41511.99935179398 | 14.27 |
| 41512.16601846065 | 14.21 |
| 41512.332685127316 | 14.27 |
| 41512.49935179398 | 14.33 |
| 41512.66601846065 | 14.27 |
| 41512.832685127316 | 14.21 |
| 41512.99935179398 | 14.21 |
| 41513.16601846065 | 14.21 |
| 41513.332685127316 | 14.21 |
| 41513.49935179398 | 14.33 |
| 41513.66601846065 | 14.33 |
| 41513.832685127316 | 14.21 |
| 41513.99935179398 | 14.21 |
| 41514.16601846065 | 14.21 |
| 41514.332685127316 | 14.21 |
| 41514.49935179398 | 14.33 |
| 41514.66601846065 | 14.27 |
| 41514.832685127316 | 14.21 |
| 41514.99935179398 | 14.21 |
| 41515.16601846065 | 14.21 |
| 41515.332685127316 | 14.21 |
| 41515.49935179398 | 14.27 |
| 41515.66601846065 | 14.33 |
| 41515.832685127316 | 14.21 |
| 41515.99935179398 | 14.21 |
| 41516.16601846065 | 14.21 |
| 41516.332685127316 | 14.21 |
| 41516.49935179398 | 14.27 |
| 41516.66601846065 | 14.33 |
| 41516.832685127316 | 14.21 |
| 41516.99935179398 | 14.21 |
| 41517.16601846065 | 14.21 |
| 41517.332685127316 | 14.21 |
| 41517.49935179398 | 14.27 |
| 41517.66601846065 | 14.33 |
| 41517.832685127316 | 14.21 |
| 41517.99935179398 | 14.21 |
| 41518.16601846065 | 14.21 |
| 41518.332685127316 | 14.21 |
| 41518.49935179398 | 14.27 |
| 41518.66601846065 | 14.27 |
| 41518.832685127316 | 14.21 |
| 41518.99935179398 | 14.21 |
| 41519.16601846065 | 14.21 |
| 41519.332685127316 | 14.21 |
| 41519.49935179398 | 14.27 |
| 41519.66601846065 | 14.33 |
| 41519.832685127316 | 14.21 |
| 41519.99935179398 | 14.21 |
| 41520.16601846065 | 14.21 |
| 41520.332685127316 | 14.21 |
| 41520.49935179398 | 14.27 |
| 41520.66601846065 | 14.33 |
| 41520.832685127316 | 14.21 |
| 41520.99935179398 | 14.14 |
| 41521.16601846065 | 14.14 |
| 41521.332685127316 | 14.14 |
| 41521.49935179398 | 14.27 |
| 41521.66601846065 | 14.33 |
| 41521.832685127316 | 14.21 |
| 41521.99935179398 | 14.14 |
| 41522.16601846065 | 14.14 |
| 41522.332685127316 | 14.21 |
| 41522.49935179398 | 14.27 |
| 41522.66601846065 | 14.27 |
| 41522.832685127316 | 14.21 |
| 41522.99935179398 | 14.21 |
| 41523.16601846065 | 14.21 |
| 41523.332685127316 | 14.21 |
| 41523.49935179398 | 14.27 |
| 41523.66601846065 | 14.27 |
| 41523.832685127316 | 14.21 |
| 41523.99935179398 | 14.21 |
| 41524.16601846065 | 14.14 |
| 41524.332685127316 | 14.21 |
| 41524.49935179398 | 14.27 |
| 41524.66601846065 | 14.27 |
| 41524.832685127316 | 14.21 |
| 41524.99935179398 | 14.21 |
| 41525.16601846065 | 14.14 |
| 41525.332685127316 | 14.21 |
| 41525.49935179398 | 14.21 |
| 41525.66601846065 | 14.27 |
| 41525.832685127316 | 14.21 |
| 41525.99935179398 | 14.21 |
| 41526.16601846065 | 14.14 |
| 41526.332685127316 | 14.21 |
| 41526.49935179398 | 14.27 |
| 41526.66601846065 | 14.27 |
| 41526.832685127316 | 14.21 |
| 41526.99935179398 | 14.21 |
| 41527.16601846065 | 14.14 |
| 41527.332685127316 | 14.21 |
| 41527.49935179398 | 14.27 |
| 41527.66601846065 | 14.27 |
| 41527.832685127316 | 14.21 |
| 41527.99935179398 | 14.21 |
| 41528.16601846065 | 14.14 |
| 41528.332685127316 | 14.21 |
| 41528.49935179398 | 14.27 |
| 41528.66601846065 | 14.27 |
| 41528.832685127316 | 14.21 |
| 41528.99935179398 | 14.21 |
| 41529.16601846065 | 14.21 |
| 41529.332685127316 | 14.21 |
| 41529.49935179398 | 14.27 |
| 41529.66601846065 | 14.21 |
| 41529.832685127316 | 14.21 |
| 41529.99935179398 | 14.21 |
| 41530.16601846065 | 14.21 |
| 41530.332685127316 | 14.14 |
| 41530.49935179398 | 14.27 |
| 41530.66601846065 | 14.27 |
| 41530.832685127316 | 14.14 |
| 41530.99935179398 | 14.14 |
| 41531.16601846065 | 14.14 |
| 41531.332685127316 | 14.14 |
| 41531.49935179398 | 14.27 |
| 41531.66601846065 | 14.27 |
| 41531.832685127316 | 14.21 |
| 41531.99935179398 | 14.14 |
| 41532.16601846065 | 14.14 |
| 41532.332685127316 | 14.14 |
| 41532.49935179398 | 14.27 |
| 41532.66601846065 | 14.27 |
| 41532.832685127316 | 14.21 |
| 41532.99935179398 | 14.21 |
| 41533.16601846065 | 14.21 |
| 41533.332685127316 | 14.21 |
| 41533.49935179398 | 14.21 |
| 41533.66601846065 | 14.21 |
| 41533.832685127316 | 14.21 |
| 41533.99935179398 | 14.21 |
| 41534.16601846065 | 14.21 |
| 41534.332685127316 | 14.21 |
| 41534.49935179398 | 14.27 |
| 41534.66601846065 | 14.27 |
| 41534.832685127316 | 14.21 |
| 41534.99935179398 | 14.21 |
| 41535.16601846065 | 14.21 |
| 41535.332685127316 | 14.21 |
| 41535.49935179398 | 14.27 |
| 41535.66601846065 | 14.21 |
| 41535.832685127316 | 14.21 |
| 41535.99935179398 | 14.21 |
| 41536.16601846065 | 14.21 |
| 41536.332685127316 | 14.21 |
| 41536.49935179398 | 14.27 |
| 41536.66601846065 | 14.27 |
| 41536.832685127316 | 14.21 |
| 41536.99935179398 | 14.21 |
| 41537.16601846065 | 14.21 |
| 41537.332685127316 | 14.21 |
| 41537.49935179398 | 14.21 |
| 41537.66601846065 | 14.21 |
| 41537.832685127316 | 14.21 |
| 41537.99935179398 | 14.14 |
| 41538.16601846065 | 14.14 |
| 41538.332685127316 | 14.14 |
| 41538.49935179398 | 14.27 |
| 41538.66601846065 | 14.27 |
| 41538.832685127316 | 14.21 |
| 41538.99935179398 | 14.14 |
| 41539.16601846065 | 14.14 |
| 41539.332685127316 | 14.14 |
| 41539.49935179398 | 14.27 |
| 41539.66601846065 | 14.27 |
| 41539.832685127316 | 14.14 |
| 41539.99935179398 | 14.14 |
| 41540.16601846065 | 14.14 |
| 41540.332685127316 | 14.14 |
| 41540.49935179398 | 14.33 |
| 41540.66601846065 | 14.27 |
| 41540.832685127316 | 14.21 |
| 41540.99935179398 | 14.14 |
| 41541.16601846065 | 14.14 |
| 41541.332685127316 | 14.14 |
| 41541.49935179398 | 14.33 |
| 41541.66601846065 | 14.27 |
| 41541.832685127316 | 14.21 |
| 41541.99935179398 | 14.21 |
| 41542.16601846065 | 14.14 |
| 41542.332685127316 | 14.14 |
| 41542.49935179398 | 14.27 |
| 41542.66601846065 | 14.27 |
| 41542.832685127316 | 14.21 |
| 41542.99935179398 | 14.21 |
| 41543.16601846065 | 14.21 |
| 41543.332685127316 | 14.21 |
| 41543.49935179398 | 14.27 |
| 41543.66601846065 | 14.27 |
| 41543.832685127316 | 14.21 |
| 41543.99935179398 | 14.21 |
| 41544.16601846065 | 14.21 |
| 41544.332685127316 | 14.21 |
| 41544.49935179398 | 14.27 |
| 41544.66601846065 | 14.27 |
| 41544.832685127316 | 14.21 |
| 41544.99935179398 | 14.21 |
| 41545.16601846065 | 14.21 |
| 41545.332685127316 | 14.21 |
| 41545.49935179398 | 14.33 |
| 41545.66601846065 | 14.21 |
| 41545.832685127316 | 14.21 |
| 41545.99935179398 | 14.21 |
| 41546.16601846065 | 14.21 |
| 41546.332685127316 | 14.21 |
| 41546.49935179398 | 14.27 |
| 41546.66601846065 | 14.27 |
| 41546.832685127316 | 14.21 |
| 41546.99935179398 | 14.21 |
| 41547.16601846065 | 14.21 |
| 41547.332685127316 | 14.21 |
| 41547.49935179398 | 14.33 |
| 41547.66601846065 | 14.27 |
| 41547.832685127316 | 14.21 |
| 41547.99935179398 | 14.21 |
| 41548.16601846065 | 14.21 |
| 41548.332685127316 | 14.21 |
| 41548.49935179398 | 14.27 |
| 41548.66601846065 | 14.27 |
| 41548.832685127316 | 14.21 |
| 41548.99935179398 | 14.21 |
| 41549.16601846065 | 14.21 |
| 41549.332685127316 | 14.21 |
| 41549.49935179398 | 14.21 |
| 41549.66601846065 | 14.27 |
| 41549.832685127316 | 14.21 |
| 41549.99935179398 | 14.21 |
| 41550.16601846065 | 14.21 |
| 41550.332685127316 | 14.21 |
| 41550.49935179398 | 14.27 |
| 41550.66601846065 | 14.33 |
| 41550.832685127316 | 14.21 |
| 41550.99935179398 | 14.21 |
| 41551.16601846065 | 14.21 |
| 41551.332685127316 | 14.21 |
| 41551.49935179398 | 14.33 |
| 41551.66601846065 | 14.33 |
| 41551.832685127316 | 14.21 |
| 41551.99935179398 | 14.21 |
| 41552.16601846065 | 14.21 |
| 41552.332685127316 | 14.21 |
| 41552.49935179398 | 14.21 |
| 41552.66601846065 | 14.27 |
| 41552.832685127316 | 14.21 |
| 41552.99935179398 | 14.21 |
| 41553.16601846065 | 14.21 |
| 41553.332685127316 | 14.14 |
| 41553.49935179398 | 14.27 |
| 41553.66601846065 | 14.27 |
| 41553.832685127316 | 14.14 |
| 41553.99935179398 | 14.21 |
| 41554.16601846065 | 14.21 |
| 41554.332685127316 | 14.21 |
| 41554.49935179398 | 14.27 |
| 41554.66601846065 | 14.27 |
| 41554.832685127316 | 14.21 |
| 41554.99935179398 | 14.14 |
| 41555.16601846065 | 14.14 |
| 41555.332685127316 | 14.14 |
| 41555.49935179398 | 14.27 |
| 41555.66601846065 | 14.33 |
| 41555.832685127316 | 14.21 |
| 41555.99935179398 | 14.14 |
| 41556.16601846065 | 14.14 |
| 41556.332685127316 | 14.14 |
| 41556.49935179398 | 14.27 |
| 41556.66601846065 | 14.33 |
| 41556.832685127316 | 14.21 |
| 41556.99935179398 | 14.21 |
| 41557.16601846065 | 14.21 |
| 41557.332685127316 | 14.21 |
| 41557.49935179398 | 14.27 |
| 41557.66601846065 | 14.33 |
| 41557.832685127316 | 14.21 |
| 41557.99935179398 | 14.21 |
| 41558.16601846065 | 14.21 |
| 41558.332685127316 | 14.21 |
| 41558.49935179398 | 14.33 |
| 41558.66601846065 | 14.33 |
| 41558.832685127316 | 14.21 |
| 41558.99935179398 | 14.21 |
| 41559.16601846065 | 14.21 |
| 41559.332685127316 | 14.21 |
| 41559.49935179398 | 14.27 |
| 41559.66601846065 | 14.33 |
| 41559.832685127316 | 14.21 |
| 41559.99935179398 | 14.21 |
| 41560.16601846065 | 14.21 |
| 41560.332685127316 | 14.21 |
| 41560.49935179398 | 14.33 |
| 41560.66601846065 | 14.33 |
| 41560.832685127316 | 14.21 |
| 41560.99935179398 | 14.21 |
| 41561.16601846065 | 14.21 |
| 41561.332685127316 | 14.21 |
| 41561.49935179398 | 14.27 |
| 41561.66601846065 | 14.27 |
| 41561.832685127316 | 14.21 |
| 41561.99935179398 | 14.21 |
| 41562.16601846065 | 14.21 |
| 41562.332685127316 | 14.21 |
| 41562.49935179398 | 14.27 |
| 41562.66601846065 | 14.21 |
| 41562.832685127316 | 14.21 |
| 41562.99935179398 | 14.21 |
| 41563.16601846065 | 14.21 |
| 41563.332685127316 | 14.21 |
| 41563.49935179398 | 14.27 |
| 41563.66601846065 | 14.33 |
| 41563.832685127316 | 14.21 |
| 41563.99935179398 | 14.21 |
| 41564.16601846065 | 14.21 |
| 41564.332685127316 | 14.21 |
| 41564.49935179398 | 14.27 |
| 41564.66601846065 | 14.27 |
| 41564.832685127316 | 14.21 |
| 41564.99935179398 | 14.21 |
| 41565.16601846065 | 14.14 |
| 41565.332685127316 | 14.14 |
| 41565.49935179398 | 14.27 |
| 41565.66601846065 | 14.27 |
| 41565.832685127316 | 14.21 |
| 41565.99935179398 | 14.21 |
| 41566.16601846065 | 14.21 |
| 41566.332685127316 | 14.21 |
| 41566.49935179398 | 14.33 |
| 41566.66601846065 | 14.27 |
| 41566.832685127316 | 14.21 |
| 41566.99935179398 | 14.14 |
| 41567.16601846065 | 14.14 |
| 41567.332685127316 | 14.14 |
| 41567.49935179398 | 14.46 |
| 41567.66601846065 | 14.27 |
| 41567.832685127316 | 14.21 |
| 41567.99935179398 | 14.21 |
| 41568.16601846065 | 14.21 |
| 41568.332685127316 | 14.21 |
| 41568.49935179398 | 14.33 |
| 41568.66601846065 | 14.21 |
| 41568.832685127316 | 14.21 |
| 41568.99935179398 | 14.21 |
| 41569.16601846065 | 14.14 |
| 41569.332685127316 | 14.14 |
| 41569.49935179398 | 14.27 |
| 41569.66601846065 | 14.27 |
| 41569.832685127316 | 14.21 |
| 41569.99935179398 | 14.21 |
| 41570.16601846065 | 14.21 |
| 41570.332685127316 | 14.21 |
| 41570.49935179398 | 14.4 |
| 41570.66601846065 | 14.27 |
| 41570.832685127316 | 14.21 |
| 41570.99935179398 | 14.21 |
| 41571.16601846065 | 14.21 |
| 41571.332685127316 | 14.21 |
| 41571.49935179398 | 14.46 |
| 41571.66601846065 | 14.27 |
| 41571.832685127316 | 14.14 |
| 41571.99935179398 | 14.14 |
| 41572.16601846065 | 14.14 |
| 41572.332685127316 | 14.14 |
| 41572.49935179398 | 14.46 |
| 41572.66601846065 | 14.27 |
| 41572.832685127316 | 14.21 |
| 41572.99935179398 | 14.14 |
| 41573.16601846065 | 14.14 |
| 41573.332685127316 | 14.21 |
| 41573.49935179398 | 14.27 |
| 41573.66601846065 | 14.33 |
| 41573.832685127316 | 14.21 |
| 41573.99935179398 | 14.21 |
| 41574.16601846065 | 14.21 |
| 41574.332685127316 | 14.14 |
| 41574.49935179398 | 14.46 |
| 41574.66601846065 | 14.33 |
| 41574.832685127316 | 14.21 |
| 41574.99935179398 | 14.21 |
| 41575.16601846065 | 14.14 |
| 41575.332685127316 | 14.21 |
| 41575.49935179398 | 14.4 |
| 41575.66601846065 | 14.33 |
| 41575.832685127316 | 14.21 |
| 41575.99935179398 | 14.21 |
| 41576.16601846065 | 14.21 |
| 41576.332685127316 | 14.21 |
| 41576.49935179398 | 14.21 |
| 41576.66601846065 | 14.27 |
| 41576.832685127316 | 14.27 |
| 41576.99935179398 | 14.27 |
| 41577.16601846065 | 14.21 |
| 41577.332685127316 | 14.21 |
| 41577.49935179398 | 14.33 |
| 41577.66601846065 | 14.27 |
| 41577.832685127316 | 14.27 |
| 41577.99935179398 | 14.27 |
| 41578.16601846065 | 14.27 |
| 41578.332685127316 | 14.27 |
| 41578.49935179398 | 14.4 |
| 41578.66601846065 | 14.4 |
| 41578.832685127316 | 14.21 |
| 41578.99935179398 | 14.21 |
| 41579.16601846065 | 14.21 |
| 41579.332685127316 | 14.21 |
| 41579.49935179398 | 14.71 |
| 41579.66601846065 | 14.33 |
| 41579.832685127316 | 14.21 |
| 41579.99935179398 | 14.21 |
| 41580.16601846065 | 14.21 |
| 41580.332685127316 | 14.21 |
| 41580.49935179398 | 14.46 |
| 41580.66601846065 | 14.33 |
| 41580.832685127316 | 14.21 |
| 41580.99935179398 | 14.21 |
| 41581.12435185185 | 14.14 |
| 41581.29101851852 | 14.21 |
| 41581.45768518518 | 15.22 |
| 41581.62435185185 | 14.33 |
| 41581.79101851852 | 14.21 |
| 41581.95768518518 | 14.21 |
| 41582.12435150463 | 14.21 |
| 41582.29101811343 | 14.21 |
| 41582.45768472222 | 14.27 |
| 41582.62435133102 | 14.33 |
| 41582.79101793982 | 14.21 |
| 41582.95768454861 | 14.21 |
| 41583.12435115741 | 14.21 |
| 41583.291017766205 | 14.21 |
| 41583.457684375 | 14.33 |
| 41583.624350983795 | 14.27 |
| 41583.79101759259 | 14.21 |
| 41583.95768420139 | 14.21 |
| 41584.12435081018 | 14.21 |
| 41584.29101741898 | 14.27 |
| 41584.45768402778 | 14.27 |
| 41584.62435063657 | 14.27 |
| 41584.79101724537 | 14.21 |
| 41584.95768385417 | 14.21 |
| 41585.12435046296 | 14.21 |
| 41585.29101707176 | 14.21 |
| 41585.45768368056 | 14.78 |
| 41585.62435028935 | 14.33 |
| 41585.79101689815 | 14.21 |
| 41585.957683506946 | 14.21 |
| 41586.124350115744 | 14.21 |
| 41586.291016724535 | 14.21 |
| 41586.457683333334 | 14.9 |
| 41586.62434994213 | 14.33 |
| 41586.791016550924 | 14.21 |
| 41586.95768315972 | 14.21 |
| 41587.12434976852 | 14.21 |
| 41587.29101637731 | 14.21 |
| 41587.45768298611 | 14.84 |
| 41587.62434959491 | 14.33 |
| 41587.7910162037 | 14.21 |
| 41587.9576828125 | 14.21 |
| 41588.1243494213 | 14.21 |
| 41588.291016030096 | 14.21 |
| 41588.45768263889 | 14.78 |
| 41588.624349247686 | 14.33 |
| 41588.791015856485 | 14.21 |
| 41588.957682465276 | 14.21 |
| 41589.124349074074 | 14.21 |
| 41589.29101568287 | 14.21 |
| 41589.457682291664 | 14.65 |
| 41589.62434890046 | 14.4 |
| 41589.79101550926 | 14.21 |
| 41589.95768211805 | 14.21 |
| 41590.12434872685 | 14.21 |
| 41590.29101533565 | 14.14 |
| 41590.45768194444 | 14.65 |
| 41590.62434855324 | 14.27 |
| 41590.79101516204 | 14.14 |
| 41590.95768177084 | 14.14 |
| 41591.12434837963 | 14.14 |
| 41591.29101498843 | 14.14 |
| 41591.457681597225 | 14.59 |
| 41591.624348206016 | 14.27 |
| 41591.791014814815 | 14.14 |
| 41591.95768142361 | 14.14 |
| 41592.124348032405 | 14.14 |
| 41592.2910146412 | 14.14 |
| 41592.45768125 | 14.59 |
| 41592.62434785879 | 14.33 |
| 41592.79101446759 | 14.21 |
| 41592.95768107639 | 14.21 |
| 41593.12434768519 | 14.21 |
| 41593.29101429398 | 14.21 |
| 41593.45768090278 | 14.27 |
| 41593.62434751158 | 14.33 |
| 41593.79101412037 | 14.21 |
| 41593.95768072917 | 14.21 |
| 41594.124347337965 | 14.21 |
| 41594.29101394676 | 14.27 |
| 41594.457680555555 | 14.27 |
| 41594.624347164354 | 14.27 |
| 41594.791013773145 | 14.27 |
| 41594.957680381944 | 14.27 |
| 41595.12434699074 | 14.27 |
| 41595.29101359953 | 14.27 |
| 41595.45768020833 | 14.4 |
| 41595.62434681713 | 14.33 |
| 41595.79101342593 | 14.21 |
| 41595.95768003472 | 14.21 |
| 41596.12434664352 | 14.21 |
| 41596.29101325232 | 14.21 |
| 41596.45767986111 | 14.65 |
| 41596.62434646991 | 14.33 |
| 41596.791013078706 | 14.21 |
| 41596.9576796875 | 14.21 |
| 41597.124346296296 | 14.21 |
| 41597.291012905094 | 14.21 |
| 41597.457679513886 | 14.59 |
| 41597.624346122684 | 14.33 |
| 41597.79101273148 | 14.21 |
| 41597.95767934028 | 14.21 |
| 41598.12434594907 | 14.21 |
| 41598.29101255787 | 14.21 |
| 41598.45767916667 | 14.33 |
| 41598.62434577546 | 14.33 |
| 41598.79101238426 | 14.21 |
| 41598.95767899306 | 14.21 |
| 41599.12434560185 | 14.21 |
| 41599.29101221065 | 14.21 |
| 41599.457678819446 | 14.21 |
| 41599.62434542824 | 14.27 |
| 41599.791012037036 | 14.27 |
| 41599.957678645835 | 14.27 |
| 41600.12434525463 | 14.27 |
| 41600.291011863425 | 14.27 |
| 41600.45767847222 | 14.27 |
| 41600.62434508102 | 14.27 |
| 41600.79101168981 | 14.21 |
| 41600.95767829861 | 14.21 |
| 41601.12434490741 | 14.14 |
| 41601.2910115162 | 14.14 |
| 41601.457678125 | 14.27 |
| 41601.6243447338 | 14.21 |
| 41601.79101134259 | 14.14 |
| 41601.95767795139 | 14.14 |
| 41602.12434456019 | 14.14 |
| 41602.29101116898 | 14.14 |
| 41602.45767777778 | 14.33 |
| 41602.624344386575 | 14.21 |
| 41602.791010995374 | 14.14 |
| 41602.957677604165 | 14.14 |
| 41603.12434421296 | 14.14 |
| 41603.29101082176 | 14.14 |
| 41603.45767743055 | 14.14 |
| 41603.62434403935 | 14.21 |
| 41603.79101064815 | 14.14 |
| 41603.95767725694 | 14.14 |
| 41604.12434386574 | 14.14 |
| 41604.29101047454 | 14.14 |
| 41604.45767708333 | 14.4 |
| 41604.62434369213 | 14.21 |
| 41604.79101030093 | 14.14 |
| 41604.957676909726 | 14.14 |
| 41605.12434351852 | 14.14 |
| 41605.291010127316 | 14.14 |
| 41605.457676736114 | 14.33 |
| 41605.624343344905 | 14.21 |
| 41605.791009953704 | 14.14 |
| 41605.9576765625 | 14.14 |
| 41606.124343171294 | 14.08 |
| 41606.29100978009 | 14.14 |
| 41606.45767638889 | 14.33 |
| 41606.62434299768 | 14.21 |
| 41606.79100960648 | 14.14 |
| 41606.95767621528 | 14.14 |
| 41607.12434282407 | 14.14 |
| 41607.29100943287 | 14.14 |
| 41607.45767604167 | 14.27 |
| 41607.624342650466 | 14.21 |
| 41607.79100925926 | 14.14 |
| 41607.957675868056 | 14.14 |
| 41608.124342476855 | 14.14 |
| 41608.291009085646 | 14.14 |
| 41608.457675694444 | 14.27 |
| 41608.62434230324 | 14.21 |
| 41608.791008912034 | 14.14 |
| 41608.95767552083 | 14.14 |
| 41609.12434212963 | 14.14 |
| 41609.29100873842 | 14.14 |
| 41609.45767534722 | 14.27 |
| 41609.62434195602 | 14.27 |
| 41609.79100856482 | 14.21 |
| 41609.95767517361 | 14.14 |
| 41610.12434178241 | 14.14 |
| 41610.29100839121 | 14.14 |
| 41610.457675 | 14.27 |
| 41610.6243416088 | 14.27 |
| 41610.791008217595 | 14.14 |
| 41610.957674826386 | 14.21 |
| 41611.124341435185 | 14.21 |
| 41611.29100804398 | 14.21 |
| 41611.457674652775 | 14.27 |
| 41611.62434126157 | 14.27 |
| 41611.79100787037 | 14.21 |
| 41611.95767447917 | 14.21 |
| 41612.12434108796 | 14.21 |
| 41612.29100769676 | 14.21 |
| 41612.45767430556 | 14.27 |
| 41612.62434091435 | 14.27 |
| 41612.79100752315 | 14.21 |
| 41612.95767413195 | 14.21 |
| 41613.12434074074 | 14.14 |
| 41613.29100734954 | 14.14 |
| 41613.457673958335 | 14.14 |
| 41613.62434056713 | 14.14 |
| 41613.791007175925 | 14.02 |
| 41613.957673784724 | 14.14 |
| 41614.124340393515 | 14.08 |
| 41614.29100700231 | 14.08 |
| 41614.45767361111 | 14.08 |
| 41614.62434021991 | 14.14 |
| 41614.7910068287 | 14.14 |
| 41614.9576734375 | 14.14 |
| 41615.1243400463 | 14.08 |
| 41615.29100665509 | 14.08 |
| 41615.45767326389 | 14.21 |
| 41615.62433987269 | 14.21 |
| 41615.79100648148 | 14.14 |
| 41615.95767309028 | 14.14 |
| 41616.124339699076 | 14.14 |
| 41616.29100630787 | 14.14 |
| 41616.457672916666 | 14.21 |
| 41616.624339525464 | 14.14 |
| 41616.79100613426 | 14.14 |
| 41616.957672743054 | 14.14 |
| 41617.12433935185 | 14.14 |
| 41617.29100596065 | 14.14 |
| 41617.45767256944 | 14.27 |
| 41617.62433917824 | 14.21 |
| 41617.79100578704 | 14.14 |
| 41617.95767239583 | 14.14 |
| 41618.12433900463 | 14.14 |
| 41618.29100561343 | 14.08 |
| 41618.45767222222 | 14.21 |
| 41618.62433883102 | 14.21 |
| 41618.791005439816 | 14.14 |
| 41618.95767204861 | 14.14 |
| 41619.124338657406 | 14.08 |
| 41619.291005266205 | 14.08 |
| 41619.457671875 | 14.21 |
| 41619.624338483794 | 14.21 |
| 41619.79100509259 | 14.14 |
| 41619.95767170139 | 14.14 |
| 41620.12433831018 | 14.08 |
| 41620.29100491898 | 14.08 |
| 41620.45767152778 | 14.21 |
| 41620.62433813657 | 14.21 |
| 41620.79100474537 | 14.14 |
| 41620.95767135417 | 14.14 |
| 41621.12433796296 | 14.14 |
| 41621.29100457176 | 14.14 |
| 41621.45767118056 | 14.21 |
| 41621.624337789355 | 14.21 |
| 41621.79100439815 | 14.14 |
| 41621.957671006945 | 14.14 |
| 41622.12433761574 | 14.14 |
| 41622.291004224535 | 14.14 |
| 41622.45767083333 | 14.21 |
| 41622.62433744213 | 14.21 |
| 41622.79100405092 | 14.14 |
| 41622.95767065972 | 14.14 |
| 41623.12433726852 | 14.14 |
| 41623.29100387731 | 14.14 |
| 41623.45767048611 | 14.21 |
| 41623.62433709491 | 14.27 |
| 41623.79100370371 | 14.21 |
| 41623.9576703125 | 14.21 |
| 41624.1243369213 | 14.14 |
| 41624.291003530096 | 14.14 |
| 41624.45767013889 | 14.21 |
| 41624.624336747685 | 14.27 |
| 41624.791003356484 | 14.14 |
| 41624.957669965275 | 14.14 |
| 41625.124336574074 | 14.14 |
| 41625.29100318287 | 14.14 |
| 41625.457669791664 | 14.21 |
| 41625.62433640046 | 14.21 |
| 41625.79100300926 | 14.14 |
| 41625.95766961805 | 14.14 |
| 41626.12433622685 | 14.14 |
| 41626.29100283565 | 14.14 |
| 41626.45766944445 | 14.21 |
| 41626.62433605324 | 14.21 |
| 41626.79100266204 | 14.14 |
| 41626.957669270836 | 14.14 |
| 41627.12433587963 | 14.14 |
| 41627.291002488426 | 14.14 |
| 41627.457669097224 | 14.21 |
| 41627.624335706016 | 14.21 |
| 41627.791002314814 | 14.21 |
| 41627.95766892361 | 14.21 |
| 41628.124335532404 | 14.21 |
| 41628.2910021412 | 14.21 |
| 41628.45766875 | 14.27 |
| 41628.6243353588 | 14.21 |
| 41628.79100196759 | 14.21 |
| 41628.95766857639 | 14.21 |
| 41629.12433518519 | 14.14 |
| 41629.29100179398 | 14.14 |
| 41629.45766840278 | 14.14 |
| 41629.62433501158 | 14.14 |
| 41629.79100162037 | 14.14 |
| 41629.957668229166 | 14.14 |
| 41630.124334837965 | 14.14 |
| 41630.291001446756 | 14.08 |
| 41630.457668055555 | 14.08 |
| 41630.62433466435 | 14.02 |
| 41630.791001273145 | 13.96 |
| 41630.95766788194 | 13.96 |
| 41631.12433449074 | 13.96 |
| 41631.29100109954 | 13.96 |
| 41631.45766770833 | 13.96 |
| 41631.62433431713 | 13.96 |
| 41631.79100092593 | 13.96 |
| 41631.95766753472 | 13.89 |
| 41632.12433414352 | 13.89 |
| 41632.29100075232 | 13.89 |
| 41632.45766736111 | 13.89 |
| 41632.62433396991 | 13.89 |
| 41632.791000578705 | 13.83 |
| 41632.9576671875 | 13.83 |
| 41633.124333796295 | 13.77 |
| 41633.291000405094 | 13.77 |
| 41633.45766701389 | 13.83 |
| 41633.62433362268 | 13.83 |
| 41633.79100023148 | 13.77 |
| 41633.95766684028 | 13.77 |
| 41634.12433344907 | 13.77 |
| 41634.29100005787 | 13.77 |
| 41634.45766666667 | 13.83 |
| 41634.62433327546 | 13.89 |
| 41634.79099988426 | 13.83 |
| 41634.95766649306 | 13.83 |
| 41635.12433310185 | 13.83 |
| 41635.29099971065 | 13.83 |
| 41635.457666319446 | 13.89 |
| 41635.624332928244 | 13.89 |
| 41635.790999537036 | 13.83 |
| 41635.957666145834 | 13.83 |
| 41636.12433275463 | 13.83 |
| 41636.290999363424 | 13.83 |
| 41636.45766597222 | 13.89 |
| 41636.62433258102 | 13.89 |
| 41636.79099918981 | 13.89 |
| 41636.95766579861 | 13.89 |
| 41637.12433240741 | 13.89 |
| 41637.2909990162 | 13.83 |
| 41637.457665625 | 13.89 |
| 41637.6243322338 | 13.89 |
| 41637.79099884259 | 13.83 |
| 41637.95766545139 | 13.83 |
| 41638.124332060186 | 13.83 |
| 41638.290998668985 | 13.83 |
| 41638.457665277776 | 13.89 |
| 41638.624331886575 | 13.96 |
| 41638.79099849537 | 13.89 |
| 41638.957665104164 | 13.83 |
| 41639.12433171296 | 13.83 |
| 41639.29099832176 | 13.83 |
| 41639.45766493055 | 13.89 |
| 41639.62433153935 | 13.96 |
| 41639.79099814815 | 13.89 |
| 41639.95766475694 | 13.89 |
| 41640.12433136574 | 13.89 |
| 41640.29099797454 | 13.89 |
| 41640.45766458334 | 14.02 |
| 41640.62433119213 | 13.96 |
| 41640.79099780093 | 13.89 |
| 41640.957664409725 | 13.89 |
| 41641.12433101852 | 13.89 |
| 41641.290997627315 | 13.83 |
| 41641.45766423611 | 13.89 |
| 41641.624330844905 | 13.96 |
| 41641.7909974537 | 13.89 |
| 41641.9576640625 | 13.83 |
| 41642.12433067129 | 13.83 |
| 41642.29099728009 | 13.83 |
| 41642.45766388889 | 13.96 |
| 41642.62433049769 | 13.96 |
| 41642.79099710648 | 13.89 |
| 41642.95766371528 | 13.89 |
| 41643.12433032408 | 13.89 |
| 41643.29099693287 | 13.89 |
| 41643.45766354167 | 13.96 |
| 41643.624330150466 | 13.96 |
| 41643.79099675926 | 13.89 |
| 41643.957663368055 | 13.89 |
| 41644.124329976854 | 13.89 |
| 41644.290996585645 | 13.89 |
| 41644.457663194444 | 13.89 |
| 41644.62432980324 | 13.96 |
| 41644.79099641203 | 13.89 |
| 41644.95766302083 | 13.83 |
| 41645.12432962963 | 13.83 |
| 41645.29099623843 | 13.89 |
| 41645.45766284722 | 13.89 |
| 41645.62432945602 | 13.96 |
| 41645.79099606482 | 13.89 |
| 41645.95766267361 | 13.89 |
| 41646.12432928241 | 13.83 |
| 41646.290995891206 | 13.83 |
| 41646.4576625 | 13.96 |
| 41646.624329108796 | 14.02 |
| 41646.790995717594 | 13.89 |
| 41646.957662326386 | 13.89 |
| 41647.124328935184 | 13.89 |
| 41647.29099554398 | 13.89 |
| 41647.45766215278 | 14.02 |
| 41647.62432876157 | 13.96 |
| 41647.79099537037 | 13.96 |
| 41647.95766197917 | 13.96 |
| 41648.12432858796 | 13.96 |
| 41648.29099519676 | 13.96 |
| 41648.45766180556 | 13.96 |
| 41648.62432841435 | 13.96 |
| 41648.79099502315 | 13.96 |
| 41648.95766163195 | 13.96 |
| 41649.12432824074 | 13.96 |
| 41649.290994849536 | 13.96 |
| 41649.457661458335 | 13.96 |
| 41649.624328067126 | 13.96 |
| 41649.790994675925 | 13.96 |
| 41649.95766128472 | 13.96 |
| 41650.12432789352 | 13.96 |
| 41650.29099450231 | 13.96 |
| 41650.45766111111 | 14.02 |
| 41650.62432771991 | 14.02 |
| 41650.7909943287 | 13.96 |
| 41650.9576609375 | 13.96 |
| 41651.1243275463 | 13.89 |
| 41651.29099415509 | 13.89 |
| 41651.45766076389 | 13.89 |
| 41651.62432737269 | 13.96 |
| 41651.79099398148 | 13.89 |
| 41651.95766059028 | 13.89 |
| 41652.124327199075 | 13.89 |
| 41652.290993807874 | 13.89 |
| 41652.457660416665 | 13.89 |
| 41652.62432702546 | 13.96 |
| 41652.79099363426 | 13.89 |
| 41652.95766024305 | 13.83 |
| 41653.12432685185 | 13.83 |
| 41653.29099346065 | 13.83 |
| 41653.45766006944 | 13.96 |
| 41653.62432667824 | 13.89 |
| 41653.79099328704 | 13.83 |
| 41653.95765989583 | 13.77 |
| 41654.12432650463 | 13.77 |
| 41654.29099311343 | 13.77 |
| 41654.457659722226 | 13.83 |
| 41654.62432633102 | 13.83 |
| 41654.790992939816 | 13.77 |
| 41654.957659548614 | 13.7 |
| 41655.124326157405 | 13.77 |
| 41655.290992766204 | 13.7 |
| 41655.457659375 | 13.77 |
| 41655.624325983794 | 13.83 |
| 41655.79099259259 | 13.7 |
| 41655.95765920139 | 13.7 |
| 41656.12432581018 | 13.7 |
| 41656.29099241898 | 13.7 |
| 41656.45765902778 | 13.83 |
| 41656.62432563657 | 13.77 |
| 41656.79099224537 | 13.7 |
| 41656.95765885417 | 13.7 |
| 41657.124325462966 | 13.7 |
| 41657.29099207176 | 13.77 |
| 41657.457658680556 | 13.83 |
| 41657.624325289355 | 13.83 |
| 41657.790991898146 | 13.77 |
| 41657.957658506944 | 13.77 |
| 41658.12432511574 | 13.77 |
| 41658.290991724534 | 13.77 |
| 41658.45765833333 | 13.83 |
| 41658.62432494213 | 13.89 |
| 41658.79099155092 | 13.83 |
| 41658.95765815972 | 13.77 |
| 41659.12432476852 | 13.83 |
| 41659.29099137732 | 13.83 |
| 41659.45765798611 | 13.89 |
| 41659.62432459491 | 13.89 |
| 41659.79099120371 | 13.83 |
| 41659.9576578125 | 13.83 |
| 41660.1243244213 | 13.83 |
| 41660.290991030095 | 13.77 |
| 41660.457657638886 | 13.83 |
| 41660.624324247685 | 13.89 |
| 41660.79099085648 | 13.83 |
| 41660.957657465275 | 13.83 |
| 41661.12432407407 | 13.83 |
| 41661.29099068287 | 13.83 |
| 41661.45765729166 | 13.83 |
| 41661.62432390046 | 13.89 |
| 41661.79099050926 | 13.83 |
| 41661.95765711806 | 13.83 |
| 41662.12432372685 | 13.77 |
| 41662.29099033565 | 13.77 |
| 41662.45765694445 | 13.89 |
| 41662.62432355324 | 13.89 |
| 41662.79099016204 | 13.77 |
| 41662.957656770835 | 13.77 |
| 41663.12432337963 | 13.77 |
| 41663.290989988425 | 13.77 |
| 41663.457656597224 | 13.83 |
| 41663.624323206015 | 13.89 |
| 41663.790989814814 | 13.83 |
| 41663.95765642361 | 13.83 |
| 41664.12432303241 | 13.83 |
| 41664.2909896412 | 13.83 |
| 41664.45765625 | 13.89 |
| 41664.6243228588 | 13.89 |
| 41664.79098946759 | 13.83 |
| 41664.95765607639 | 13.83 |
| 41665.12432268519 | 13.83 |
| 41665.29098929398 | 13.83 |
| 41665.45765590278 | 13.89 |
| 41665.624322511576 | 13.96 |
| 41665.79098912037 | 13.89 |
| 41665.957655729166 | 13.83 |
| 41666.124322337964 | 13.83 |
| 41666.29098894676 | 13.83 |
| 41666.457655555554 | 13.89 |
| 41666.62432216435 | 13.89 |
| 41666.79098877315 | 13.83 |
| 41666.95765538194 | 13.83 |
| 41667.12432199074 | 13.83 |
| 41667.29098859954 | 13.83 |
| 41667.45765520833 | 13.89 |
| 41667.62432181713 | 13.96 |
| 41667.79098842593 | 13.83 |
| 41667.95765503472 | 13.83 |
| 41668.12432164352 | 13.83 |
| 41668.290988252316 | 13.83 |
| 41668.45765486111 | 13.89 |
| 41668.624321469906 | 13.96 |
| 41668.790988078705 | 13.83 |
| 41668.9576546875 | 13.83 |
| 41669.124321296295 | 13.83 |
| 41669.29098790509 | 13.83 |
| 41669.45765451389 | 13.89 |
| 41669.62432112268 | 13.96 |
| 41669.79098773148 | 13.89 |
| 41669.95765434028 | 13.89 |
| 41670.12432094907 | 13.89 |
| 41670.29098755787 | 13.89 |
| 41670.45765416667 | 13.89 |
| 41670.62432077546 | 13.89 |
| 41670.79098738426 | 13.89 |
| 41670.95765399306 | 13.89 |
| 41671.124320601855 | 13.89 |
| 41671.29098721065 | 13.89 |
| 41671.457653819445 | 13.96 |
| 41671.624320428244 | 13.96 |
| 41671.790987037035 | 13.89 |
| 41671.95765364583 | 13.89 |
| 41672.12432025463 | 13.89 |
| 41672.29098686342 | 13.89 |
| 41672.45765347222 | 13.89 |
| 41672.62432008102 | 13.89 |
| 41672.79098668981 | 13.89 |
| 41672.95765329861 | 13.89 |
| 41673.12431990741 | 13.89 |
| 41673.2909865162 | 13.83 |
| 41673.457653125 | 13.96 |
| 41673.6243197338 | 14.02 |
| 41673.790986342596 | 13.89 |
| 41673.95765295139 | 13.89 |
| 41674.124319560186 | 13.89 |
| 41674.290986168984 | 13.89 |
| 41674.457652777775 | 13.89 |
| 41674.624319386574 | 13.89 |
| 41674.79098599537 | 13.89 |
| 41674.957652604164 | 13.89 |
| 41675.12431921296 | 13.89 |
| 41675.29098582176 | 13.89 |
| 41675.45765243055 | 14.02 |
| 41675.62431903935 | 14.08 |
| 41675.79098564815 | 13.89 |
| 41675.95765225695 | 13.89 |
| 41676.12431886574 | 13.89 |
| 41676.29098547454 | 13.89 |
| 41676.457652083336 | 13.96 |
| 41676.62431869213 | 14.02 |
| 41676.790985300926 | 13.89 |
| 41676.957651909725 | 13.89 |
| 41677.124318518516 | 13.89 |
| 41677.290985127314 | 13.89 |
| 41677.45765173611 | 14.02 |
| 41677.624318344904 | 13.96 |
| 41677.7909849537 | 13.89 |
| 41677.9576515625 | 13.89 |
| 41678.1243181713 | 13.89 |
| 41678.29098478009 | 13.89 |
| 41678.45765138889 | 14.02 |
| 41678.62431799769 | 14.02 |
| 41678.79098460648 | 13.96 |
| 41678.95765121528 | 13.96 |
| 41679.12431782408 | 13.96 |
| 41679.29098443287 | 13.96 |
| 41679.45765104167 | 13.96 |
| 41679.624317650465 | 14.02 |
| 41679.790984259256 | 13.96 |
| 41679.957650868055 | 13.96 |
| 41680.12431747685 | 13.96 |
| 41680.290984085645 | 13.89 |
| 41680.45765069444 | 14.02 |
| 41680.62431730324 | 14.08 |
| 41680.79098391204 | 13.96 |
| 41680.95765052083 | 13.96 |
| 41681.12431712963 | 13.89 |
| 41681.29098373843 | 13.89 |
| 41681.45765034722 | 14.02 |
| 41681.62431695602 | 14.14 |
| 41681.79098356482 | 13.96 |
| 41681.95765017361 | 13.89 |
| 41682.12431678241 | 13.89 |
| 41682.290983391205 | 13.89 |
| 41682.45765 | 14.08 |
| 41682.624316608795 | 14.14 |
| 41682.790983217594 | 13.96 |
| 41682.95764982639 | 13.96 |
| 41683.12431643518 | 13.96 |
| 41683.29098304398 | 13.96 |
| 41683.45764965278 | 14.08 |
| 41683.62431626157 | 14.14 |
| 41683.79098287037 | 13.96 |
| 41683.95764947917 | 13.96 |
| 41684.12431608796 | 13.96 |
| 41684.29098269676 | 13.96 |
| 41684.45764930556 | 14.02 |
| 41684.62431591435 | 14.02 |
| 41684.79098252315 | 13.96 |
| 41684.957649131946 | 13.96 |
| 41685.124315740744 | 13.96 |
| 41685.290982349536 | 13.96 |
| 41685.457648958334 | 14.08 |
| 41685.62431556713 | 14.02 |
| 41685.790982175924 | 13.96 |
| 41685.95764878472 | 13.96 |
| 41686.12431539352 | 13.96 |
| 41686.29098200231 | 13.96 |
| 41686.45764861111 | 14.14 |
| 41686.62431521991 | 14.14 |
| 41686.7909818287 | 14.02 |
| 41686.9576484375 | 14.02 |
| 41687.1243150463 | 14.02 |
| 41687.29098165509 | 14.02 |
| 41687.45764826389 | 14.08 |
| 41687.624314872686 | 14.21 |
| 41687.790981481485 | 14.02 |
| 41687.957648090276 | 14.02 |
| 41688.124314699075 | 14.02 |
| 41688.29098130787 | 13.96 |
| 41688.457647916664 | 14.14 |
| 41688.62431452546 | 14.14 |
| 41688.79098113426 | 14.02 |
| 41688.95764774305 | 14.02 |
| 41689.12431435185 | 14.02 |
| 41689.29098096065 | 14.02 |
| 41689.45764756944 | 14.21 |
| 41689.62431417824 | 14.14 |
| 41689.79098078704 | 14.08 |
| 41689.95764739584 | 14.08 |
| 41690.12431400463 | 14.08 |
| 41690.29098061343 | 14.08 |
| 41690.457647222225 | 14.14 |
| 41690.62431383102 | 14.14 |
| 41690.790980439815 | 14.02 |
| 41690.95764704861 | 14.02 |
| 41691.124313657405 | 14.02 |
| 41691.2909802662 | 14.02 |
| 41691.457646875 | 14.21 |
| 41691.62431348379 | 14.21 |
| 41691.79098009259 | 14.02 |
| 41691.95764670139 | 14.02 |
| 41692.12431331018 | 14.02 |
| 41692.29097991898 | 14.02 |
| 41692.45764652778 | 14.21 |
| 41692.62431313658 | 14.21 |
| 41692.79097974537 | 14.08 |
| 41692.95764635417 | 14.02 |
| 41693.124312962966 | 14.02 |
| 41693.29097957176 | 14.02 |
| 41693.457646180555 | 14.14 |
| 41693.624312789354 | 14.21 |
| 41693.790979398145 | 14.02 |
| 41693.957646006944 | 14.02 |
| 41694.12431261574 | 14.02 |
| 41694.290979224534 | 14.02 |
| 41694.45764583333 | 14.21 |
| 41694.62431244213 | 14.21 |
| 41694.79097905093 | 14.08 |
| 41694.95764565972 | 14.08 |
| 41695.12431226852 | 14.02 |
| 41695.29097887732 | 14.02 |
| 41695.45764548611 | 14.14 |
| 41695.62431209491 | 14.08 |
| 41695.790978703706 | 14.02 |
| 41695.9576453125 | 14.02 |
| 41696.124311921296 | 14.02 |
| 41696.290978530094 | 14.02 |
| 41696.457645138886 | 14.08 |
| 41696.624311747684 | 14.14 |
| 41696.79097835648 | 14.02 |
| 41696.95764496528 | 14.02 |
| 41697.12431157407 | 14.02 |
| 41697.29097818287 | 14.02 |
| 41697.45764479167 | 14.08 |
| 41697.62431140046 | 14.21 |
| 41697.79097800926 | 14.02 |
| 41697.95764461806 | 14.02 |
| 41698.12431122685 | 14.02 |
| 41698.29097783565 | 14.02 |
| 41698.45764444445 | 14.14 |
| 41698.62431105324 | 14.14 |
| 41698.790977662036 | 14.08 |
| 41698.957644270835 | 14.08 |
| 41699.124310879626 | 14.08 |
| 41699.290977488425 | 14.08 |
| 41699.45764409722 | 14.14 |
| 41699.62431070602 | 14.14 |
| 41699.79097731481 | 14.08 |
| 41699.95764392361 | 14.08 |
| 41700.12431053241 | 14.08 |
| 41700.2909771412 | 13.96 |
| 41700.45764375 | 14.02 |
| 41700.6243103588 | 14.02 |
| 41700.79097696759 | 13.96 |
| 41700.95764357639 | 13.96 |
| 41701.12431018519 | 13.96 |
| 41701.29097679398 | 14.02 |
| 41701.45764340278 | 14.14 |
| 41701.624310011575 | 14.21 |
| 41701.790976620374 | 14.02 |
| 41701.957643229165 | 14.02 |
| 41702.124309837964 | 14.02 |
| 41702.29097644676 | 14.02 |
| 41702.45764305555 | 14.14 |
| 41702.62430966435 | 14.21 |
| 41702.79097627315 | 14.08 |
| 41702.95764288194 | 14.08 |
| 41703.12430949074 | 14.02 |
| 41703.29097609954 | 14.02 |
| 41703.45764270833 | 14.14 |
| 41703.62430931713 | 14.14 |
| 41703.79097592593 | 14.08 |
| 41703.95764253472 | 14.08 |
| 41704.12430914352 | 14.08 |
| 41704.290975752316 | 14.08 |
| 41704.457642361114 | 14.21 |
| 41704.624308969906 | 14.21 |
| 41704.790975578704 | 14.08 |
| 41704.9576421875 | 14.08 |
| 41705.124308796294 | 14.08 |
| 41705.29097540509 | 14.08 |
| 41705.45764201389 | 14.21 |
| 41705.62430862268 | 14.21 |
| 41705.79097523148 | 14.08 |
| 41705.95764184028 | 14.08 |
| 41706.12430844907 | 14.08 |
| 41706.29097505787 | 14.08 |
| 41706.45764166667 | 14.14 |
| 41706.624308275466 | 14.14 |
| 41706.79097488426 | 14.08 |
| 41706.957641493056 | 14.08 |
| 41707.165972222225 | 14.08 |
| 41707.33263888889 | 14.08 |
| 41707.49930555555 | 14.14 |
| 41707.665972222225 | 14.27 |
| 41707.83263888889 | 14.08 |
| 41707.99930555555 | 14.08 |
| 41708.165972222225 | 14.08 |
| 41708.33263888889 | 14.08 |
| 41708.49930555555 | 14.27 |
| 41708.665972222225 | 14.27 |
| 41708.83263888889 | 14.14 |
| 41708.99930555555 | 14.08 |
| 41709.165972222225 | 14.08 |
| 41709.33263888889 | 14.08 |
| 41709.49930555555 | 14.27 |
| 41709.665972222225 | 14.27 |
| 41709.83263888889 | 14.14 |
| 41709.99930555555 | 14.14 |
| 41710.165972222225 | 14.08 |
| 41710.33263888889 | 14.08 |
| 41710.49930555555 | 14.27 |
| 41710.665972222225 | 14.21 |
| 41710.83263888889 | 14.14 |
| 41710.99930555555 | 14.08 |
| 41711.165972222225 | 14.08 |
| 41711.33263888889 | 14.08 |
| 41711.49930555555 | 14.27 |
| 41711.665972222225 | 14.27 |
| 41711.83263888889 | 14.14 |
| 41711.99930555555 | 14.08 |
| 41712.165972222225 | 14.08 |
| 41712.33263888889 | 14.08 |
| 41712.49930555555 | 14.14 |
| 41712.665972222225 | 14.21 |
| 41712.83263888889 | 14.14 |
| 41712.99930555555 | 14.08 |
| 41713.165972222225 | 14.08 |
| 41713.33263888889 | 14.08 |
| 41713.49930555555 | 14.27 |
| 41713.665972222225 | 14.27 |
| 41713.83263888889 | 14.14 |
| 41713.99930555555 | 14.14 |
| 41714.165972222225 | 14.14 |
| 41714.33263888889 | 14.08 |
| 41714.49930555555 | 14.08 |
| 41714.665972222225 | 14.08 |
| 41714.83263888889 | 14.08 |
| 41714.99930555555 | 14.08 |
| 41715.165972222225 | 14.08 |
| 41715.33263888889 | 14.08 |
| 41715.49930555555 | 14.27 |
| 41715.665972222225 | 14.21 |
| 41715.83263888889 | 14.14 |
| 41715.99930555555 | 14.14 |
| 41716.165972222225 | 14.08 |
| 41716.33263888889 | 14.08 |
| 41716.49930555555 | 14.27 |
| 41716.665972222225 | 14.14 |
| 41716.83263888889 | 14.08 |
| 41716.99930555555 | 14.08 |
| 41717.165972222225 | 14.02 |
| 41717.33263888889 | 14.02 |
| 41717.49930555555 | 14.08 |
| 41717.665972222225 | 14.08 |
| 41717.83263888889 | 14.02 |
| 41717.99930555555 | 14.02 |
| 41718.165972222225 | 13.96 |
| 41718.33263888889 | 13.96 |
| 41718.49930555555 | 14.21 |
| 41718.665972222225 | 14.08 |
| 41718.83263888889 | 14.02 |
| 41718.99930555555 | 13.96 |
| 41719.165972222225 | 14.02 |
| 41719.33263888889 | 14.02 |
| 41719.49930555555 | 14.14 |
| 41719.665972222225 | 14.08 |
| 41719.83263888889 | 14.02 |
| 41719.99930555555 | 14.02 |
| 41720.165972222225 | 14.02 |
| 41720.33263888889 | 14.02 |
| 41720.49930555555 | 14.21 |
| 41720.665972222225 | 14.14 |
| 41720.83263888889 | 14.02 |
| 41720.99930555555 | 14.02 |
| 41721.165972222225 | 14.02 |
| 41721.33263888889 | 14.02 |
| 41721.49930555555 | 14.21 |
| 41721.665972222225 | 14.14 |
| 41721.83263888889 | 14.02 |
| 41721.99930555555 | 14.02 |
| 41722.165972222225 | 13.96 |
| 41722.33263888889 | 14.02 |
| 41722.49930555555 | 14.14 |
| 41722.665972222225 | 14.08 |
| 41722.83263888889 | 14.02 |
| 41722.99930555555 | 14.02 |
| 41723.165972222225 | 14.02 |
| 41723.33263888889 | 14.02 |
| 41723.49930555555 | 14.08 |
| 41723.665972222225 | 14.14 |
| 41723.83263888889 | 14.02 |
| 41723.99930555555 | 14.02 |
| 41724.165972222225 | 13.96 |
| 41724.33263888889 | 14.02 |
| 41724.49930555555 | 14.21 |
| 41724.665972222225 | 14.14 |
| 41724.83263888889 | 14.02 |
| 41724.99930555555 | 14.02 |
| 41725.165972222225 | 14.02 |
| 41725.33263888889 | 14.02 |
| 41725.49930555555 | 14.08 |
| 41725.665972222225 | 14.08 |
| 41725.83263888889 | 14.08 |
| 41725.99930555555 | 14.08 |
| 41726.165972222225 | 14.02 |
| 41726.33263888889 | 14.02 |
| 41726.49930555555 | 14.21 |
| 41726.665972222225 | 14.14 |
| 41726.83263888889 | 14.02 |
| 41726.99930555555 | 14.02 |
| 41727.165972222225 | 14.02 |
| 41727.33263888889 | 14.02 |
| 41727.49930555555 | 14.14 |
| 41727.665972222225 | 14.14 |
| 41727.83263888889 | 14.02 |
| 41727.99930555555 | 14.02 |
| 41728.165972222225 | 13.96 |
| 41728.33263888889 | 14.02 |
| 41728.49930555555 | 14.21 |
| 41728.665972222225 | 14.14 |
| 41728.83263888889 | 14.02 |
| 41728.99930555555 | 14.02 |
| 41729.165972222225 | 14.02 |
| 41729.33263888889 | 14.02 |
| 41729.49930555555 | 14.14 |
| 41729.665972222225 | 14.02 |
| 41729.83263888889 | 14.02 |
| 41729.99930555555 | 14.02 |
| 41730.165972222225 | 14.02 |
| 41730.33263888889 | 14.02 |
| 41730.49930555555 | 14.21 |
| 41730.665972222225 | 14.14 |
| 41730.83263888889 | 14.02 |
| 41730.99930555555 | 14.02 |
| 41731.165972222225 | 14.02 |
| 41731.33263888889 | 14.02 |
| 41731.49930555555 | 14.14 |
| 41731.665972222225 | 14.08 |
| 41731.83263888889 | 14.08 |
| 41731.99930555555 | 14.02 |
| 41732.165972222225 | 14.08 |
| 41732.33263888889 | 14.02 |
| 41732.49930555555 | 14.14 |
| 41732.665972222225 | 14.08 |
| 41732.83263888889 | 14.02 |
| 41732.99930555555 | 14.02 |
| 41733.165972222225 | 14.02 |
| 41733.33263888889 | 14.02 |
| 41733.49930555555 | 14.08 |
| 41733.665972222225 | 14.08 |
| 41733.83263888889 | 14.02 |
| 41733.99930555555 | 14.02 |
| 41734.165972222225 | 14.02 |
| 41734.33263888889 | 14.02 |
| 41734.49930555555 | 14.08 |
| 41734.665972222225 | 14.08 |
| 41734.83263888889 | 13.96 |
| 41734.99930555555 | 13.96 |
| 41735.165972222225 | 13.96 |
| 41735.33263888889 | 13.96 |
| 41735.49930555555 | 14.02 |
| 41735.665972222225 | 13.96 |
| 41735.83263888889 | 13.96 |
| 41735.99930555555 | 13.89 |
| 41736.165972222225 | 13.89 |
| 41736.33263888889 | 13.89 |
| 41736.49930555555 | 13.96 |
| 41736.665972222225 | 14.02 |
| 41736.83263888889 | 13.96 |
| 41736.99930555555 | 13.89 |
| 41737.165972222225 | 13.89 |
| 41737.33263888889 | 13.89 |
| 41737.49930555555 | 14.02 |
| 41737.665972222225 | 14.02 |
| 41737.83263888889 | 13.89 |
| 41737.99930555555 | 13.89 |
| 41738.165972222225 | 13.89 |
| 41738.33263888889 | 13.89 |
| 41738.49930555555 | 13.96 |
| 41738.665972222225 | 14.02 |
| 41738.83263888889 | 13.89 |
| 41738.99930555555 | 13.89 |
| 41739.165972222225 | 13.89 |
| 41739.33263888889 | 13.89 |
| 41739.49930555555 | 14.02 |
| 41739.665972222225 | 13.96 |
| 41739.83263888889 | 13.89 |
| 41739.99930555555 | 13.89 |
| 41740.165972222225 | 13.89 |
| 41740.33263888889 | 13.89 |
| 41740.49930555555 | 14.02 |
| 41740.665972222225 | 14.02 |
| 41740.83263888889 | 13.89 |
| 41740.99930555555 | 13.89 |
| 41741.165972222225 | 13.89 |
| 41741.33263888889 | 13.89 |
| 41741.49930555555 | 14.08 |
| 41741.665972222225 | 14.02 |
| 41741.83263888889 | 13.89 |
| 41741.99930555555 | 13.89 |
| 41742.165972222225 | 13.89 |
| 41742.33263888889 | 13.96 |
| 41742.49930555555 | 13.96 |
| 41742.665972222225 | 13.96 |
| 41742.83263888889 | 13.96 |
| 41742.99930555555 | 13.89 |
| 41743.165972222225 | 13.89 |
| 41743.33263888889 | 13.96 |
| 41743.49930555555 | 13.96 |
| 41743.665972222225 | 13.96 |
| 41743.83263888889 | 13.89 |
| 41743.99930555555 | 13.89 |
| 41744.165972222225 | 13.89 |
| 41744.33263888889 | 13.89 |
| 41744.49930555555 | 14.02 |
| 41744.665972222225 | 14.02 |
| 41744.83263888889 | 13.89 |
| 41744.99930555555 | 13.89 |
| 41745.165972222225 | 13.89 |
| 41745.33263888889 | 13.89 |
| 41745.49930555555 | 14.02 |
| 41745.665972222225 | 13.96 |
| 41745.83263888889 | 13.89 |
| 41745.99930555555 | 13.89 |
| 41746.165972222225 | 13.89 |
| 41746.33263888889 | 13.89 |
| 41746.49930555555 | 14.08 |
| 41746.665972222225 | 14.02 |
| 41746.83263888889 | 13.89 |
| 41746.99930555555 | 13.89 |
| 41747.165972222225 | 13.89 |
| 41747.33263888889 | 13.89 |
| 41747.49930555555 | 14.08 |
| 41747.665972222225 | 14.02 |
| 41747.83263888889 | 13.89 |
| 41747.99930555555 | 13.89 |
| 41748.165972222225 | 13.89 |
| 41748.33263888889 | 13.89 |
| 41748.49930555555 | 14.08 |
| 41748.665972222225 | 14.02 |
| 41748.83263888889 | 13.89 |
| 41748.99930555555 | 13.89 |
| 41749.165972222225 | 13.89 |
| 41749.33263888889 | 13.89 |
| 41749.49930555555 | 14.08 |
| 41749.665972222225 | 14.02 |
| 41749.83263888889 | 13.89 |
| 41749.99930555555 | 13.89 |
| 41750.165972222225 | 13.89 |
| 41750.33263888889 | 13.89 |
| 41750.49930555555 | 13.96 |
| 41750.665972222225 | 14.02 |
| 41750.83263888889 | 13.89 |
| 41750.99930555555 | 13.89 |
| 41751.165972222225 | 13.89 |
| 41751.33263888889 | 13.89 |
| 41751.49930555555 | 14.08 |
| 41751.665972222225 | 14.02 |
| 41751.83263888889 | 13.89 |
| 41751.99930555555 | 13.89 |
| 41752.165972222225 | 13.89 |
| 41752.33263888889 | 13.89 |
| 41752.49930555555 | 14.08 |
| 41752.665972222225 | 14.02 |
| 41752.83263888889 | 13.89 |
| 41752.99930555555 | 13.89 |
| 41753.165972222225 | 13.89 |
| 41753.33263888889 | 13.89 |
| 41753.49930555555 | 13.96 |
| 41753.665972222225 | 13.96 |
| 41753.83263888889 | 13.96 |
| 41753.99930555555 | 13.89 |
| 41754.165972222225 | 13.89 |
| 41754.33263888889 | 13.89 |
| 41754.49930555555 | 14.08 |
| 41754.665972222225 | 14.02 |
| 41754.83263888889 | 13.89 |
| 41754.99930555555 | 13.89 |
| 41755.165972222225 | 13.89 |
| 41755.33263888889 | 13.89 |
| 41755.49930555555 | 13.96 |
| 41755.665972222225 | 14.02 |
| 41755.83263888889 | 13.89 |
| 41755.99930555555 | 13.89 |
| 41756.165972222225 | 13.89 |
| 41756.33263888889 | 13.96 |
| 41756.49930555555 | 14.02 |
| 41756.665972222225 | 13.96 |
| 41756.83263888889 | 13.96 |
| 41756.99930555555 | 13.89 |
| 41757.165972222225 | 13.89 |
| 41757.33263888889 | 13.96 |
| 41757.49930555555 | 14.02 |
| 41757.665972222225 | 14.02 |
| 41757.83263888889 | 13.89 |
| 41757.99930555555 | 13.89 |
| 41758.165972222225 | 13.89 |
| 41758.33263888889 | 13.89 |
| 41758.49930555555 | 14.02 |
| 41758.665972222225 | 13.96 |
| 41758.83263888889 | 13.89 |
| 41758.99930555555 | 13.89 |
| 41759.165972222225 | 13.89 |
| 41759.33263888889 | 13.89 |
| 41759.49930555555 | 13.89 |
| 41759.665972222225 | 13.89 |
| 41759.83263888889 | 13.89 |
| 41759.99930555555 | 13.83 |
| 41760.165972222225 | 13.83 |
| 41760.33263888889 | 13.83 |
| 41760.49930555555 | 13.89 |
| 41760.665972222225 | 13.89 |
| 41760.83263888889 | 13.89 |
| 41760.99930555555 | 13.89 |
| 41761.165972222225 | 13.83 |
| 41761.33263888889 | 13.83 |
| 41761.49930555555 | 13.96 |
| 41761.665972222225 | 13.96 |
| 41761.83263888889 | 13.89 |
| 41761.99930555555 | 13.89 |
| 41762.165972222225 | 13.83 |
| 41762.33263888889 | 13.89 |
| 41762.49930555555 | 14.02 |
| 41762.665972222225 | 14.02 |
| 41762.83263888889 | 13.89 |
| 41762.99930555555 | 13.89 |
| 41763.165972222225 | 13.89 |
| 41763.33263888889 | 13.89 |
| 41763.49930555555 | 14.02 |
| 41763.665972222225 | 14.08 |
| 41763.83263888889 | 13.89 |
| 41763.99930555555 | 13.89 |
| 41764.165972222225 | 13.89 |
| 41764.33263888889 | 13.89 |
| 41764.49930555555 | 14.02 |
| 41764.665972222225 | 14.08 |
| 41764.83263888889 | 13.96 |
| 41764.99930555555 | 13.96 |
| 41765.165972222225 | 13.89 |
| 41765.33263888889 | 13.89 |
| 41765.49930555555 | 14.02 |
| 41765.665972222225 | 14.08 |
| 41765.83263888889 | 13.96 |
| 41765.99930555555 | 13.96 |
| 41766.165972222225 | 13.96 |
| 41766.33263888889 | 13.96 |
| 41766.49930555555 | 14.02 |
| 41766.665972222225 | 14.08 |
| 41766.83263888889 | 13.96 |
| 41766.99930555555 | 13.96 |
| 41767.165972222225 | 13.96 |
| 41767.33263888889 | 13.96 |
| 41767.49930555555 | 14.02 |
| 41767.665972222225 | 14.02 |
| 41767.83263888889 | 13.96 |
| 41767.99930555555 | 13.96 |
| 41768.165972222225 | 13.96 |
| 41768.33263888889 | 13.96 |
| 41768.49930555555 | 14.02 |
| 41768.665972222225 | 14.08 |
| 41768.83263888889 | 14.02 |
| 41768.99930555555 | 13.96 |
| 41769.165972222225 | 13.96 |
| 41769.33263888889 | 13.96 |
| 41769.49930555555 | 14.02 |
| 41769.665972222225 | 14.02 |
| 41769.83263888889 | 13.96 |
| 41769.99930555555 | 13.96 |
| 41770.165972222225 | 13.96 |
| 41770.33263888889 | 13.96 |
| 41770.49930555555 | 14.08 |
| 41770.665972222225 | 14.08 |
| 41770.83263888889 | 13.96 |
| 41770.99930555555 | 13.96 |
| 41771.165972222225 | 13.96 |
| 41771.33263888889 | 14.02 |
| 41771.49930555555 | 14.02 |
| 41771.665972222225 | 14.02 |
| 41771.83263888889 | 14.02 |
| 41771.99930555555 | 13.96 |
| 41772.165972222225 | 13.96 |
| 41772.33263888889 | 13.96 |
| 41772.49930555555 | 13.96 |
| 41772.665972222225 | 13.96 |
| 41772.83263888889 | 13.96 |
| 41772.99930555555 | 13.96 |
| 41773.165972222225 | 13.96 |
| 41773.33263888889 | 13.96 |
| 41773.49930555555 | 13.96 |
| 41773.665972222225 | 13.96 |
| 41773.83263888889 | 13.89 |
| 41773.99930555555 | 13.89 |
| 41774.165972222225 | 13.89 |
| 41774.33263888889 | 13.89 |
| 41774.49930555555 | 13.96 |
| 41774.665972222225 | 13.89 |
| 41774.83263888889 | 13.89 |
| 41774.99930555555 | 13.83 |
| 41775.165972222225 | 13.83 |
| 41775.33263888889 | 13.89 |
| 41775.49930555555 | 13.89 |
| 41775.665972222225 | 13.89 |
| 41775.83263888889 | 13.89 |
| 41775.99930555555 | 13.89 |
| 41776.165972222225 | 13.83 |
| 41776.33263888889 | 13.83 |
| 41776.49930555555 | 13.96 |
| 41776.665972222225 | 13.96 |
| 41776.83263888889 | 13.89 |
| 41776.99930555555 | 13.89 |
| 41777.165972222225 | 13.83 |
| 41777.33263888889 | 13.83 |
| 41777.49930555555 | 13.96 |
| 41777.665972222225 | 13.96 |
| 41777.83263888889 | 13.89 |
| 41777.99930555555 | 13.89 |
| 41778.165972222225 | 13.89 |
| 41778.33263888889 | 13.89 |
| 41778.49930555555 | 13.96 |
| 41778.665972222225 | 14.02 |
| 41778.83263888889 | 13.89 |
| 41778.99930555555 | 13.89 |
| 41779.165972222225 | 13.89 |
| 41779.33263888889 | 13.89 |
| 41779.49930555555 | 13.96 |
| 41779.665972222225 | 14.02 |
| 41779.83263888889 | 13.96 |
| 41779.99930555555 | 13.89 |
| 41780.165972222225 | 13.89 |
| 41780.33263888889 | 13.89 |
| 41780.49930555555 | 14.02 |
| 41780.665972222225 | 13.96 |
| 41780.83263888889 | 13.96 |
| 41780.99930555555 | 13.89 |
| 41781.165972222225 | 13.89 |
| 41781.33263888889 | 13.96 |
| 41781.49930555555 | 14.02 |
| 41781.665972222225 | 14.02 |
| 41781.83263888889 | 13.96 |
| 41781.99930555555 | 13.96 |
| 41782.165972222225 | 13.96 |
| 41782.33263888889 | 13.96 |
| 41782.49930555555 | 14.02 |
| 41782.665972222225 | 14.02 |
| 41782.83263888889 | 13.96 |
| 41782.99930555555 | 13.96 |
| 41783.165972222225 | 13.96 |
| 41783.33263888889 | 13.96 |
| 41783.49930555555 | 13.96 |
| 41783.665972222225 | 13.96 |
| 41783.83263888889 | 13.96 |
| 41783.99930555555 | 13.96 |
| 41784.165972222225 | 13.96 |
| 41784.33263888889 | 13.96 |
| 41784.49930555555 | 14.02 |
| 41784.665972222225 | 13.96 |
| 41784.83263888889 | 13.96 |
| 41784.99930555555 | 13.96 |
| 41785.165972222225 | 13.96 |
| 41785.33263888889 | 13.96 |
| 41785.49930555555 | 14.02 |
| 41785.665972222225 | 14.08 |
| 41785.83263888889 | 13.96 |
| 41785.99930555555 | 13.96 |
| 41786.165972222225 | 13.96 |
| 41786.33263888889 | 13.96 |
| 41786.49930555555 | 14.02 |
| 41786.665972222225 | 14.02 |
| 41786.83263888889 | 13.96 |
| 41786.99930555555 | 13.96 |
| 41787.165972222225 | 13.96 |
| 41787.33263888889 | 13.96 |
| 41787.49930555555 | 14.02 |
| 41787.665972222225 | 14.02 |
| 41787.83263888889 | 14.02 |
| 41787.99930555555 | 13.96 |
| 41788.165972222225 | 13.96 |
| 41788.33263888889 | 13.96 |
| 41788.49930555555 | 14.08 |
| 41788.665972222225 | 14.08 |
| 41788.83263888889 | 13.96 |
| 41788.99930555555 | 13.96 |
| 41789.165972222225 | 13.96 |
| 41789.33263888889 | 14.02 |
| 41789.49930555555 | 14.08 |
| 41789.665972222225 | 14.14 |
| 41789.83263888889 | 13.96 |
| 41789.99930555555 | 14.02 |
| 41790.165972222225 | 13.96 |
| 41790.33263888889 | 14.02 |
| 41790.49930555555 | 14.08 |
| 41790.665972222225 | 14.08 |
| 41790.83263888889 | 14.02 |
| 41790.99930555555 | 14.02 |
| 41791.165972222225 | 14.02 |
| 41791.33263888889 | 14.02 |
| 41791.49930555555 | 14.08 |
| 41791.665972222225 | 14.08 |
| 41791.83263888889 | 14.02 |
| 41791.99930555555 | 14.02 |
| 41792.165972222225 | 14.02 |
| 41792.33263888889 | 14.02 |
| 41792.49930555555 | 14.08 |
| 41792.665972222225 | 14.08 |
| 41792.83263888889 | 14.02 |
| 41792.99930555555 | 14.02 |
| 41793.165972222225 | 14.02 |
| 41793.33263888889 | 14.02 |
| 41793.49930555555 | 14.08 |
| 41793.665972222225 | 14.14 |
| 41793.83263888889 | 14.02 |
| 41793.99930555555 | 14.02 |
| 41794.165972222225 | 14.02 |
| 41794.33263888889 | 14.02 |
| 41794.49930555555 | 14.08 |
| 41794.665972222225 | 14.14 |
| 41794.83263888889 | 14.02 |
| 41794.99930555555 | 14.02 |
| 41795.165972222225 | 14.02 |
| 41795.33263888889 | 14.02 |
| 41795.49930555555 | 14.02 |
| 41795.665972222225 | 14.08 |
| 41795.83263888889 | 14.02 |
| 41795.99930555555 | 14.02 |
| 41796.165972222225 | 14.02 |
| 41796.33263888889 | 14.02 |
| 41796.49930555555 | 14.08 |
| 41796.665972222225 | 14.02 |
| 41796.83263888889 | 14.02 |
| 41796.99930555555 | 14.02 |
| 41797.165972222225 | 14.02 |
| 41797.33263888889 | 14.08 |
| 41797.49930555555 | 14.08 |
| 41797.665972222225 | 14.08 |
| 41797.83263888889 | 14.08 |
| 41797.99930555555 | 14.08 |
| 41798.165972222225 | 14.08 |
| 41798.33263888889 | 14.08 |
| 41798.49930555555 | 14.08 |
| 41798.665972222225 | 14.08 |
| 41798.83263888889 | 14.08 |
| 41798.99930555555 | 14.08 |
| 41799.165972222225 | 14.02 |
| 41799.33263888889 | 14.02 |
| 41799.49930555555 | 14.02 |
| 41799.665972222225 | 14.02 |
| 41799.83263888889 | 14.02 |
| 41799.99930555555 | 14.02 |
| 41800.165972222225 | 14.02 |
| 41800.33263888889 | 14.02 |
| 41800.49930555555 | 14.08 |
| 41800.665972222225 | 14.08 |
| 41800.83263888889 | 14.08 |
| 41800.99930555555 | 14.08 |
| 41801.165972222225 | 14.02 |
| 41801.33263888889 | 14.02 |
| 41801.49930555555 | 14.08 |
| 41801.665972222225 | 14.08 |
| 41801.83263888889 | 14.08 |
| 41801.99930555555 | 14.02 |
| 41802.165972222225 | 14.02 |
| 41802.33263888889 | 14.08 |
| 41802.49930555555 | 14.08 |
| 41802.665972222225 | 14.08 |
| 41802.83263888889 | 14.02 |
| 41802.99930555555 | 14.02 |
| 41803.165972222225 | 14.02 |
| 41803.33263888889 | 14.02 |
| 41803.49930555555 | 14.08 |
| 41803.665972222225 | 14.14 |
| 41803.83263888889 | 14.02 |
| 41803.99930555555 | 14.02 |
| 41804.165972222225 | 14.02 |
| 41804.33263888889 | 14.02 |
| 41804.49930555555 | 14.08 |
| 41804.665972222225 | 14.14 |
| 41804.83263888889 | 14.02 |
| 41804.99930555555 | 14.02 |
| 41805.165972222225 | 14.02 |
| 41805.33263888889 | 14.02 |
| 41805.49930555555 | 14.08 |
| 41805.665972222225 | 14.14 |
| 41805.83263888889 | 14.02 |
| 41805.99930555555 | 14.02 |
| 41806.165972222225 | 14.02 |
| 41806.33263888889 | 14.02 |
| 41806.49930555555 | 14.08 |
| 41806.665972222225 | 14.14 |
| 41806.83263888889 | 14.08 |
| 41806.99930555555 | 14.08 |
| 41807.165972222225 | 14.08 |
| 41807.33263888889 | 14.08 |
| 41807.49930555555 | 14.14 |
| 41807.665972222225 | 14.14 |
| 41807.83263888889 | 14.08 |
| 41807.99930555555 | 14.02 |
| 41808.165972222225 | 14.08 |
| 41808.33263888889 | 14.08 |
| 41808.49930555555 | 14.14 |
| 41808.665972222225 | 14.21 |
| 41808.83263888889 | 14.08 |
| 41808.99930555555 | 14.08 |
| 41809.165972222225 | 14.08 |
| 41809.33263888889 | 14.08 |
| 41809.49930555555 | 14.14 |
| 41809.665972222225 | 14.14 |
| 41809.83263888889 | 14.08 |
| 41809.99930555555 | 14.08 |
| 41810.165972222225 | 14.08 |
| 41810.33263888889 | 14.08 |
| 41810.49930555555 | 14.14 |
| 41810.665972222225 | 14.21 |
| 41810.83263888889 | 14.08 |
| 41810.99930555555 | 14.08 |
| 41811.165972222225 | 14.08 |
| 41811.33263888889 | 14.08 |
| 41811.49930555555 | 14.14 |
| 41811.665972222225 | 14.14 |
| 41811.83263888889 | 14.08 |
| 41811.99930555555 | 14.08 |
| 41812.165972222225 | 14.08 |
| 41812.33263888889 | 14.08 |
| 41812.49930555555 | 14.14 |
| 41812.665972222225 | 14.21 |
| 41812.83263888889 | 14.08 |
| 41812.99930555555 | 14.08 |
| 41813.165972222225 | 14.08 |
| 41813.33263888889 | 14.08 |
| 41813.49930555555 | 14.14 |
| 41813.665972222225 | 14.21 |
| 41813.83263888889 | 14.08 |
| 41813.99930555555 | 14.08 |
| 41814.165972222225 | 14.08 |
| 41814.33263888889 | 14.08 |
| 41814.49930555555 | 14.14 |
| 41814.665972222225 | 14.21 |
| 41814.83263888889 | 14.08 |
| 41814.99930555555 | 14.08 |
| 41815.165972222225 | 14.08 |
| 41815.33263888889 | 14.08 |
| 41815.49930555555 | 14.14 |
| 41815.665972222225 | 14.21 |
| 41815.83263888889 | 14.08 |
| 41815.99930555555 | 14.08 |
| 41816.165972222225 | 14.08 |
| 41816.33263888889 | 14.08 |
| 41816.49930555555 | 14.14 |
| 41816.665972222225 | 14.14 |
| 41816.83263888889 | 14.08 |
| 41816.99930555555 | 14.08 |
| 41817.165972222225 | 14.08 |
| 41817.33263888889 | 14.08 |
| 41817.49930555555 | 14.21 |
| 41817.665972222225 | 14.21 |
| 41817.83263888889 | 14.08 |
| 41817.99930555555 | 14.08 |
| 41818.165972222225 | 14.08 |
| 41818.33263888889 | 14.14 |
| 41818.49930555555 | 14.21 |
| 41818.665972222225 | 14.21 |
| 41818.83263888889 | 14.08 |
| 41818.99930555555 | 14.08 |
| 41819.165972222225 | 14.08 |
| 41819.33263888889 | 14.08 |
| 41819.49930555555 | 14.14 |
| 41819.665972222225 | 14.08 |
| 41819.83263888889 | 14.08 |
| 41819.99930555555 | 14.08 |
| 41820.165972222225 | 14.08 |
| 41820.33263888889 | 14.14 |
| 41820.49930555555 | 14.21 |
| 41820.665972222225 | 14.21 |
| 41820.83263888889 | 14.14 |
| 41820.99930555555 | 14.08 |
| 41821.165972222225 | 14.08 |
| 41821.33263888889 | 14.14 |
| 41821.49930555555 | 14.21 |
| 41821.665972222225 | 14.14 |
| 41821.83263888889 | 14.14 |
| 41821.99930555555 | 14.08 |
| 41822.165972222225 | 14.08 |
| 41822.33263888889 | 14.08 |
| 41822.49930555555 | 14.21 |
| 41822.665972222225 | 14.27 |
| 41822.83263888889 | 14.08 |
| 41822.99930555555 | 14.08 |
| 41823.165972222225 | 14.08 |
| 41823.33263888889 | 14.08 |
| 41823.49930555555 | 14.21 |
| 41823.665972222225 | 14.21 |
| 41823.83263888889 | 14.14 |
| 41823.99930555555 | 14.08 |
| 41824.165972222225 | 14.08 |
| 41824.33263888889 | 14.08 |
| 41824.49930555555 | 14.21 |
| 41824.665972222225 | 14.21 |
| 41824.83263888889 | 14.14 |
| 41824.99930555555 | 14.08 |
| 41825.165972222225 | 14.08 |
| 41825.33263888889 | 14.14 |
| 41825.49930555555 | 14.21 |
| 41825.665972222225 | 14.21 |
| 41825.83263888889 | 14.14 |
| 41825.99930555555 | 14.08 |
| 41826.165972222225 | 14.08 |
| 41826.33263888889 | 14.14 |
| 41826.49930555555 | 14.21 |
| 41826.665972222225 | 14.21 |
| 41826.83263888889 | 14.14 |
| 41826.99930555555 | 14.14 |
| 41827.165972222225 | 14.14 |
| 41827.33263888889 | 14.14 |
| 41827.49930555555 | 14.21 |
| 41827.665972222225 | 14.27 |
| 41827.83263888889 | 14.14 |
| 41827.99930555555 | 14.14 |
| 41828.165972222225 | 14.14 |
| 41828.33263888889 | 14.14 |
| 41828.49930555555 | 14.21 |
| 41828.665972222225 | 14.27 |
| 41828.83263888889 | 14.14 |
| 41828.99930555555 | 14.14 |
| 41829.165972222225 | 14.14 |
| 41829.33263888889 | 14.14 |
| 41829.49930555555 | 14.21 |
| 41829.665972222225 | 14.27 |
| 41829.83263888889 | 14.14 |
| 41829.99930555555 | 14.14 |
| 41830.165972222225 | 14.14 |
| 41830.33263888889 | 14.14 |
| 41830.49930555555 | 14.21 |
| 41830.665972222225 | 14.21 |
| 41830.83263888889 | 14.14 |
| 41830.99930555555 | 14.14 |
| 41831.165972222225 | 14.14 |
| 41831.33263888889 | 14.14 |
| 41831.49930555555 | 14.21 |
| 41831.665972222225 | 14.27 |
| 41831.83263888889 | 14.14 |
| 41831.99930555555 | 14.14 |
| 41832.165972222225 | 14.14 |
| 41832.33263888889 | 14.14 |
| 41832.49930555555 | 14.27 |
| 41832.665972222225 | 14.27 |
| 41832.83263888889 | 14.14 |
| 41832.99930555555 | 14.14 |
| 41833.165972222225 | 14.14 |
| 41833.33263888889 | 14.14 |
| 41833.49930555555 | 14.27 |
| 41833.665972222225 | 14.33 |
| 41833.83263888889 | 14.14 |
| 41833.99930555555 | 14.14 |
| 41834.165972222225 | 14.14 |
| 41834.33263888889 | 14.14 |
| 41834.49930555555 | 14.21 |
| 41834.665972222225 | 14.27 |
| 41834.83263888889 | 14.14 |
| 41834.99930555555 | 14.14 |
| 41835.165972222225 | 14.14 |
| 41835.33263888889 | 14.14 |
| 41835.49930555555 | 14.21 |
| 41835.665972222225 | 14.27 |
| 41835.83263888889 | 14.14 |
| 41835.99930555555 | 14.14 |
| 41836.165972222225 | 14.14 |
| 41836.33263888889 | 14.14 |
| 41836.49930555555 | 14.21 |
| 41836.665972222225 | 14.27 |
| 41836.83263888889 | 14.14 |
| 41836.99930555555 | 14.14 |
| 41837.165972222225 | 14.14 |
| 41837.33263888889 | 14.14 |
| 41837.49930555555 | 14.21 |
| 41837.665972222225 | 14.27 |
| 41837.83263888889 | 14.14 |
| 41837.99930555555 | 14.14 |
| 41838.165972222225 | 14.14 |
| 41838.33263888889 | 14.14 |
| 41838.49930555555 | 14.27 |
| 41838.665972222225 | 14.21 |
| 41838.83263888889 | 14.14 |
| 41838.99930555555 | 14.14 |
| 41839.165972222225 | 14.14 |
| 41839.33263888889 | 14.14 |
| 41839.49930555555 | 14.27 |
| 41839.665972222225 | 14.33 |
| 41839.83263888889 | 14.14 |
| 41839.99930555555 | 14.14 |
| 41840.165972222225 | 14.14 |
| 41840.33263888889 | 14.14 |
| 41840.49930555555 | 14.27 |
| 41840.665972222225 | 14.33 |
| 41840.83263888889 | 14.21 |
| 41840.99930555555 | 14.14 |
| 41841.165972222225 | 14.14 |
| 41841.33263888889 | 14.14 |
| 41841.49930555555 | 14.27 |
| 41841.665972222225 | 14.33 |
| 41841.83263888889 | 14.21 |
| 41841.99930555555 | 14.14 |
| 41842.165972222225 | 14.14 |
| 41842.33263888889 | 14.21 |
| 41842.49930555555 | 14.27 |
| 41842.665972222225 | 14.33 |
| 41842.83263888889 | 14.21 |
| 41842.99930555555 | 14.21 |
| 41843.165972222225 | 14.21 |
| 41843.33263888889 | 14.21 |
| 41843.49930555555 | 14.27 |
| 41843.665972222225 | 14.27 |
| 41843.83263888889 | 14.21 |
| 41843.99930555555 | 14.21 |
| 41844.165972222225 | 14.14 |
| 41844.33263888889 | 14.14 |
| 41844.49930555555 | 14.27 |
| 41844.665972222225 | 14.33 |
| 41844.83263888889 | 14.21 |
| 41844.99930555555 | 14.14 |
| 41845.165972222225 | 14.14 |
| 41845.33263888889 | 14.14 |
| 41845.49930555555 | 14.27 |
| 41845.665972222225 | 14.33 |
| 41845.83263888889 | 14.21 |
| 41845.99930555555 | 14.21 |
| 41846.165972222225 | 14.21 |
| 41846.33263888889 | 14.21 |
| 41846.49930555555 | 14.27 |
| 41846.665972222225 | 14.33 |
| 41846.83263888889 | 14.21 |
| 41846.99930555555 | 14.21 |
| 41847.165972222225 | 14.21 |
| 41847.33263888889 | 14.21 |
| 41847.49930555555 | 14.27 |
| 41847.665972222225 | 14.33 |
| 41847.83263888889 | 14.21 |
| 41847.99930555555 | 14.21 |
| 41848.165972222225 | 14.21 |
| 41848.33263888889 | 14.21 |
| 41848.49930555555 | 14.27 |
| 41848.665972222225 | 14.27 |
| 41848.83263888889 | 14.21 |
| 41848.99930555555 | 14.21 |
| 41849.165972222225 | 14.21 |
| 41849.33263888889 | 14.21 |
| 41849.49930555555 | 14.27 |
| 41849.665972222225 | 14.27 |
| 41849.83263888889 | 14.21 |
| 41849.99930555555 | 14.21 |
| 41850.165972222225 | 14.21 |
| 41850.33263888889 | 14.21 |
| 41850.49930555555 | 14.27 |